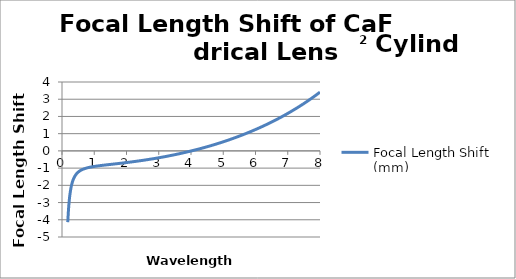
| Category | Focal Length Shift (mm) |
|---|---|
| 0.18 | -4.138 |
| 0.181 | -4.098 |
| 0.182 | -4.059 |
| 0.183 | -4.02 |
| 0.184 | -3.982 |
| 0.185 | -3.945 |
| 0.186 | -3.908 |
| 0.187 | -3.872 |
| 0.188 | -3.837 |
| 0.189 | -3.802 |
| 0.19 | -3.768 |
| 0.191 | -3.735 |
| 0.192 | -3.702 |
| 0.193 | -3.67 |
| 0.194 | -3.638 |
| 0.195 | -3.607 |
| 0.196 | -3.577 |
| 0.197 | -3.547 |
| 0.198 | -3.517 |
| 0.199 | -3.488 |
| 0.2 | -3.46 |
| 0.201 | -3.432 |
| 0.202 | -3.404 |
| 0.203 | -3.377 |
| 0.204 | -3.35 |
| 0.205 | -3.324 |
| 0.206 | -3.298 |
| 0.207 | -3.273 |
| 0.208 | -3.248 |
| 0.209 | -3.223 |
| 0.21 | -3.199 |
| 0.211 | -3.175 |
| 0.212 | -3.152 |
| 0.213 | -3.129 |
| 0.214 | -3.106 |
| 0.215 | -3.084 |
| 0.216 | -3.062 |
| 0.217 | -3.04 |
| 0.218 | -3.019 |
| 0.219 | -2.998 |
| 0.22 | -2.977 |
| 0.221 | -2.956 |
| 0.222 | -2.936 |
| 0.223 | -2.916 |
| 0.224 | -2.897 |
| 0.225 | -2.878 |
| 0.226 | -2.859 |
| 0.227 | -2.84 |
| 0.228 | -2.821 |
| 0.229 | -2.803 |
| 0.23 | -2.785 |
| 0.231 | -2.768 |
| 0.232 | -2.75 |
| 0.233 | -2.733 |
| 0.234 | -2.716 |
| 0.235 | -2.699 |
| 0.236 | -2.683 |
| 0.237 | -2.666 |
| 0.238 | -2.65 |
| 0.239 | -2.635 |
| 0.24 | -2.619 |
| 0.241 | -2.604 |
| 0.242 | -2.588 |
| 0.243 | -2.573 |
| 0.244 | -2.559 |
| 0.245 | -2.544 |
| 0.246 | -2.53 |
| 0.247 | -2.515 |
| 0.248 | -2.501 |
| 0.249 | -2.487 |
| 0.25 | -2.474 |
| 0.251 | -2.46 |
| 0.252 | -2.447 |
| 0.253 | -2.434 |
| 0.254 | -2.421 |
| 0.255 | -2.408 |
| 0.256 | -2.395 |
| 0.257 | -2.382 |
| 0.258 | -2.37 |
| 0.259 | -2.358 |
| 0.26 | -2.346 |
| 0.261 | -2.334 |
| 0.262 | -2.322 |
| 0.263 | -2.31 |
| 0.264 | -2.299 |
| 0.265 | -2.288 |
| 0.266 | -2.276 |
| 0.267 | -2.265 |
| 0.268 | -2.254 |
| 0.269 | -2.243 |
| 0.27 | -2.233 |
| 0.271 | -2.222 |
| 0.272 | -2.212 |
| 0.273 | -2.201 |
| 0.274 | -2.191 |
| 0.275 | -2.181 |
| 0.276 | -2.171 |
| 0.277 | -2.161 |
| 0.278 | -2.151 |
| 0.279 | -2.142 |
| 0.28 | -2.132 |
| 0.281 | -2.123 |
| 0.282 | -2.113 |
| 0.283 | -2.104 |
| 0.284 | -2.095 |
| 0.285 | -2.086 |
| 0.286 | -2.077 |
| 0.287 | -2.068 |
| 0.288 | -2.059 |
| 0.289 | -2.051 |
| 0.29 | -2.042 |
| 0.291 | -2.034 |
| 0.292 | -2.025 |
| 0.293 | -2.017 |
| 0.294 | -2.009 |
| 0.295 | -2.001 |
| 0.296 | -1.993 |
| 0.297 | -1.985 |
| 0.298 | -1.977 |
| 0.299 | -1.969 |
| 0.3 | -1.961 |
| 0.301 | -1.954 |
| 0.302 | -1.946 |
| 0.303 | -1.939 |
| 0.304 | -1.931 |
| 0.305 | -1.924 |
| 0.306 | -1.917 |
| 0.307 | -1.91 |
| 0.308 | -1.903 |
| 0.309 | -1.896 |
| 0.31 | -1.889 |
| 0.311 | -1.882 |
| 0.312 | -1.875 |
| 0.313 | -1.868 |
| 0.314 | -1.862 |
| 0.315 | -1.855 |
| 0.316 | -1.848 |
| 0.317 | -1.842 |
| 0.318 | -1.835 |
| 0.319 | -1.829 |
| 0.32 | -1.823 |
| 0.321 | -1.817 |
| 0.322 | -1.81 |
| 0.323 | -1.804 |
| 0.324 | -1.798 |
| 0.325 | -1.792 |
| 0.326 | -1.786 |
| 0.327 | -1.78 |
| 0.328 | -1.775 |
| 0.329 | -1.769 |
| 0.33 | -1.763 |
| 0.331 | -1.757 |
| 0.332 | -1.752 |
| 0.333 | -1.746 |
| 0.334 | -1.741 |
| 0.335 | -1.735 |
| 0.336 | -1.73 |
| 0.337 | -1.724 |
| 0.338 | -1.719 |
| 0.339 | -1.714 |
| 0.34 | -1.709 |
| 0.341 | -1.703 |
| 0.342 | -1.698 |
| 0.343 | -1.693 |
| 0.344 | -1.688 |
| 0.345 | -1.683 |
| 0.346 | -1.678 |
| 0.347 | -1.673 |
| 0.348 | -1.668 |
| 0.349 | -1.664 |
| 0.35 | -1.659 |
| 0.351 | -1.654 |
| 0.352 | -1.649 |
| 0.353 | -1.645 |
| 0.354 | -1.64 |
| 0.355 | -1.636 |
| 0.356 | -1.631 |
| 0.357 | -1.627 |
| 0.358 | -1.622 |
| 0.359 | -1.618 |
| 0.36 | -1.613 |
| 0.361 | -1.609 |
| 0.362 | -1.605 |
| 0.363 | -1.6 |
| 0.364 | -1.596 |
| 0.365 | -1.592 |
| 0.366 | -1.588 |
| 0.367 | -1.584 |
| 0.368 | -1.58 |
| 0.369 | -1.576 |
| 0.37 | -1.572 |
| 0.371 | -1.568 |
| 0.372 | -1.564 |
| 0.373 | -1.56 |
| 0.374 | -1.556 |
| 0.375 | -1.552 |
| 0.376 | -1.548 |
| 0.377 | -1.544 |
| 0.378 | -1.54 |
| 0.379 | -1.537 |
| 0.38 | -1.533 |
| 0.381 | -1.529 |
| 0.382 | -1.526 |
| 0.383 | -1.522 |
| 0.384 | -1.518 |
| 0.385 | -1.515 |
| 0.386 | -1.511 |
| 0.387 | -1.508 |
| 0.388 | -1.504 |
| 0.389 | -1.501 |
| 0.39 | -1.497 |
| 0.391 | -1.494 |
| 0.392 | -1.491 |
| 0.393 | -1.487 |
| 0.394 | -1.484 |
| 0.395 | -1.481 |
| 0.396 | -1.477 |
| 0.397 | -1.474 |
| 0.398 | -1.471 |
| 0.399 | -1.468 |
| 0.4 | -1.464 |
| 0.401 | -1.461 |
| 0.402 | -1.458 |
| 0.403 | -1.455 |
| 0.404 | -1.452 |
| 0.405 | -1.449 |
| 0.406 | -1.446 |
| 0.407 | -1.443 |
| 0.408 | -1.44 |
| 0.409 | -1.437 |
| 0.41 | -1.434 |
| 0.411 | -1.431 |
| 0.412 | -1.428 |
| 0.413 | -1.425 |
| 0.414 | -1.422 |
| 0.415 | -1.419 |
| 0.416 | -1.417 |
| 0.417 | -1.414 |
| 0.418 | -1.411 |
| 0.419 | -1.408 |
| 0.42 | -1.406 |
| 0.421 | -1.403 |
| 0.422 | -1.4 |
| 0.423 | -1.397 |
| 0.424 | -1.395 |
| 0.425 | -1.392 |
| 0.426 | -1.389 |
| 0.427 | -1.387 |
| 0.428 | -1.384 |
| 0.429 | -1.382 |
| 0.43 | -1.379 |
| 0.431 | -1.377 |
| 0.432 | -1.374 |
| 0.433 | -1.372 |
| 0.434 | -1.369 |
| 0.435 | -1.367 |
| 0.436 | -1.364 |
| 0.437 | -1.362 |
| 0.438 | -1.359 |
| 0.439 | -1.357 |
| 0.44 | -1.354 |
| 0.441 | -1.352 |
| 0.442 | -1.35 |
| 0.443 | -1.347 |
| 0.444 | -1.345 |
| 0.445 | -1.343 |
| 0.446 | -1.34 |
| 0.447 | -1.338 |
| 0.448 | -1.336 |
| 0.449 | -1.334 |
| 0.45 | -1.331 |
| 0.451 | -1.329 |
| 0.452 | -1.327 |
| 0.453 | -1.325 |
| 0.454 | -1.323 |
| 0.455 | -1.321 |
| 0.456 | -1.318 |
| 0.457 | -1.316 |
| 0.458 | -1.314 |
| 0.459 | -1.312 |
| 0.46 | -1.31 |
| 0.461 | -1.308 |
| 0.462 | -1.306 |
| 0.463 | -1.304 |
| 0.464 | -1.302 |
| 0.465 | -1.3 |
| 0.466 | -1.298 |
| 0.467 | -1.296 |
| 0.468 | -1.294 |
| 0.469 | -1.292 |
| 0.47 | -1.29 |
| 0.471 | -1.288 |
| 0.472 | -1.286 |
| 0.473 | -1.284 |
| 0.474 | -1.282 |
| 0.475 | -1.28 |
| 0.476 | -1.278 |
| 0.477 | -1.276 |
| 0.478 | -1.274 |
| 0.479 | -1.273 |
| 0.48 | -1.271 |
| 0.481 | -1.269 |
| 0.482 | -1.267 |
| 0.483 | -1.265 |
| 0.484 | -1.263 |
| 0.485 | -1.262 |
| 0.486 | -1.26 |
| 0.487 | -1.258 |
| 0.488 | -1.256 |
| 0.489 | -1.255 |
| 0.49 | -1.253 |
| 0.491 | -1.251 |
| 0.492 | -1.249 |
| 0.493 | -1.248 |
| 0.494 | -1.246 |
| 0.495 | -1.244 |
| 0.496 | -1.243 |
| 0.497 | -1.241 |
| 0.498 | -1.239 |
| 0.499 | -1.238 |
| 0.5 | -1.236 |
| 0.501 | -1.234 |
| 0.502 | -1.233 |
| 0.503 | -1.231 |
| 0.504 | -1.23 |
| 0.505 | -1.228 |
| 0.506 | -1.226 |
| 0.507 | -1.225 |
| 0.508 | -1.223 |
| 0.509 | -1.222 |
| 0.51 | -1.22 |
| 0.511 | -1.219 |
| 0.512 | -1.217 |
| 0.513 | -1.216 |
| 0.514 | -1.214 |
| 0.515 | -1.213 |
| 0.516 | -1.211 |
| 0.517 | -1.21 |
| 0.518 | -1.208 |
| 0.519 | -1.207 |
| 0.52 | -1.205 |
| 0.521 | -1.204 |
| 0.522 | -1.202 |
| 0.523 | -1.201 |
| 0.524 | -1.199 |
| 0.525 | -1.198 |
| 0.526 | -1.197 |
| 0.527 | -1.195 |
| 0.528 | -1.194 |
| 0.529 | -1.192 |
| 0.53 | -1.191 |
| 0.531 | -1.19 |
| 0.532 | -1.188 |
| 0.533 | -1.187 |
| 0.534 | -1.186 |
| 0.535 | -1.184 |
| 0.536 | -1.183 |
| 0.537 | -1.182 |
| 0.538 | -1.18 |
| 0.539 | -1.179 |
| 0.54 | -1.178 |
| 0.541 | -1.176 |
| 0.542 | -1.175 |
| 0.543 | -1.174 |
| 0.544 | -1.172 |
| 0.545 | -1.171 |
| 0.546 | -1.17 |
| 0.547 | -1.169 |
| 0.548 | -1.167 |
| 0.549 | -1.166 |
| 0.55 | -1.165 |
| 0.551 | -1.164 |
| 0.552 | -1.162 |
| 0.553 | -1.161 |
| 0.554 | -1.16 |
| 0.555 | -1.159 |
| 0.556 | -1.158 |
| 0.557 | -1.156 |
| 0.558 | -1.155 |
| 0.559 | -1.154 |
| 0.56 | -1.153 |
| 0.561 | -1.152 |
| 0.562 | -1.15 |
| 0.563 | -1.149 |
| 0.564 | -1.148 |
| 0.565 | -1.147 |
| 0.566 | -1.146 |
| 0.567 | -1.145 |
| 0.568 | -1.144 |
| 0.569 | -1.142 |
| 0.57 | -1.141 |
| 0.571 | -1.14 |
| 0.572 | -1.139 |
| 0.573 | -1.138 |
| 0.574 | -1.137 |
| 0.575 | -1.136 |
| 0.576 | -1.135 |
| 0.577 | -1.134 |
| 0.578 | -1.133 |
| 0.579 | -1.131 |
| 0.58 | -1.13 |
| 0.581 | -1.129 |
| 0.582 | -1.128 |
| 0.583 | -1.127 |
| 0.584 | -1.126 |
| 0.585 | -1.125 |
| 0.586 | -1.124 |
| 0.587 | -1.123 |
| 0.588 | -1.122 |
| 0.589 | -1.121 |
| 0.59 | -1.12 |
| 0.591 | -1.119 |
| 0.592 | -1.118 |
| 0.593 | -1.117 |
| 0.594 | -1.116 |
| 0.595 | -1.115 |
| 0.596 | -1.114 |
| 0.597 | -1.113 |
| 0.598 | -1.112 |
| 0.599 | -1.111 |
| 0.6 | -1.11 |
| 0.601 | -1.109 |
| 0.602 | -1.108 |
| 0.603 | -1.107 |
| 0.604 | -1.106 |
| 0.605 | -1.105 |
| 0.606 | -1.104 |
| 0.607 | -1.103 |
| 0.608 | -1.102 |
| 0.609 | -1.102 |
| 0.61 | -1.101 |
| 0.611 | -1.1 |
| 0.612 | -1.099 |
| 0.613 | -1.098 |
| 0.614 | -1.097 |
| 0.615 | -1.096 |
| 0.616 | -1.095 |
| 0.617 | -1.094 |
| 0.618 | -1.093 |
| 0.619 | -1.092 |
| 0.62 | -1.092 |
| 0.621 | -1.091 |
| 0.622 | -1.09 |
| 0.623 | -1.089 |
| 0.624 | -1.088 |
| 0.625 | -1.087 |
| 0.626 | -1.086 |
| 0.627 | -1.085 |
| 0.628 | -1.085 |
| 0.629 | -1.084 |
| 0.63 | -1.083 |
| 0.631 | -1.082 |
| 0.632 | -1.081 |
| 0.633 | -1.08 |
| 0.634 | -1.079 |
| 0.635 | -1.079 |
| 0.636 | -1.078 |
| 0.637 | -1.077 |
| 0.638 | -1.076 |
| 0.639 | -1.075 |
| 0.64 | -1.075 |
| 0.641 | -1.074 |
| 0.642 | -1.073 |
| 0.643 | -1.072 |
| 0.644 | -1.071 |
| 0.645 | -1.071 |
| 0.646 | -1.07 |
| 0.647 | -1.069 |
| 0.648 | -1.068 |
| 0.649 | -1.067 |
| 0.65 | -1.067 |
| 0.651 | -1.066 |
| 0.652 | -1.065 |
| 0.653 | -1.064 |
| 0.654 | -1.063 |
| 0.655 | -1.063 |
| 0.656 | -1.062 |
| 0.657 | -1.061 |
| 0.658 | -1.06 |
| 0.659 | -1.06 |
| 0.66 | -1.059 |
| 0.661 | -1.058 |
| 0.662 | -1.057 |
| 0.663 | -1.057 |
| 0.664 | -1.056 |
| 0.665 | -1.055 |
| 0.666 | -1.054 |
| 0.667 | -1.054 |
| 0.668 | -1.053 |
| 0.669 | -1.052 |
| 0.67 | -1.052 |
| 0.671 | -1.051 |
| 0.672 | -1.05 |
| 0.673 | -1.049 |
| 0.674 | -1.049 |
| 0.675 | -1.048 |
| 0.676 | -1.047 |
| 0.677 | -1.047 |
| 0.678 | -1.046 |
| 0.679 | -1.045 |
| 0.68 | -1.045 |
| 0.681 | -1.044 |
| 0.682 | -1.043 |
| 0.683 | -1.042 |
| 0.684 | -1.042 |
| 0.685 | -1.041 |
| 0.686 | -1.04 |
| 0.687 | -1.04 |
| 0.688 | -1.039 |
| 0.689 | -1.038 |
| 0.69 | -1.038 |
| 0.691 | -1.037 |
| 0.692 | -1.036 |
| 0.693 | -1.036 |
| 0.694 | -1.035 |
| 0.695 | -1.034 |
| 0.696 | -1.034 |
| 0.697 | -1.033 |
| 0.698 | -1.033 |
| 0.699 | -1.032 |
| 0.7 | -1.031 |
| 0.701 | -1.031 |
| 0.702 | -1.03 |
| 0.703 | -1.029 |
| 0.704 | -1.029 |
| 0.705 | -1.028 |
| 0.706 | -1.027 |
| 0.707 | -1.027 |
| 0.708 | -1.026 |
| 0.709 | -1.026 |
| 0.71 | -1.025 |
| 0.711 | -1.024 |
| 0.712 | -1.024 |
| 0.713 | -1.023 |
| 0.714 | -1.022 |
| 0.715 | -1.022 |
| 0.716 | -1.021 |
| 0.717 | -1.021 |
| 0.718 | -1.02 |
| 0.719 | -1.019 |
| 0.72 | -1.019 |
| 0.721 | -1.018 |
| 0.722 | -1.018 |
| 0.723 | -1.017 |
| 0.724 | -1.016 |
| 0.725 | -1.016 |
| 0.726 | -1.015 |
| 0.727 | -1.015 |
| 0.728 | -1.014 |
| 0.729 | -1.014 |
| 0.73 | -1.013 |
| 0.731 | -1.012 |
| 0.732 | -1.012 |
| 0.733 | -1.011 |
| 0.734 | -1.011 |
| 0.735 | -1.01 |
| 0.736 | -1.01 |
| 0.737 | -1.009 |
| 0.738 | -1.008 |
| 0.739 | -1.008 |
| 0.74 | -1.007 |
| 0.741 | -1.007 |
| 0.742 | -1.006 |
| 0.743 | -1.006 |
| 0.744 | -1.005 |
| 0.745 | -1.005 |
| 0.746 | -1.004 |
| 0.747 | -1.003 |
| 0.748 | -1.003 |
| 0.749 | -1.002 |
| 0.75 | -1.002 |
| 0.751 | -1.001 |
| 0.752 | -1.001 |
| 0.753 | -1 |
| 0.754 | -1 |
| 0.755 | -0.999 |
| 0.756 | -0.999 |
| 0.757 | -0.998 |
| 0.758 | -0.998 |
| 0.759 | -0.997 |
| 0.76 | -0.997 |
| 0.761 | -0.996 |
| 0.762 | -0.996 |
| 0.763 | -0.995 |
| 0.764 | -0.994 |
| 0.765 | -0.994 |
| 0.766 | -0.993 |
| 0.767 | -0.993 |
| 0.768 | -0.992 |
| 0.769 | -0.992 |
| 0.77 | -0.991 |
| 0.771 | -0.991 |
| 0.772 | -0.99 |
| 0.773 | -0.99 |
| 0.774 | -0.989 |
| 0.775 | -0.989 |
| 0.776 | -0.988 |
| 0.777 | -0.988 |
| 0.778 | -0.987 |
| 0.779 | -0.987 |
| 0.78 | -0.986 |
| 0.781 | -0.986 |
| 0.782 | -0.985 |
| 0.783 | -0.985 |
| 0.784 | -0.984 |
| 0.785 | -0.984 |
| 0.786 | -0.984 |
| 0.787 | -0.983 |
| 0.788 | -0.983 |
| 0.789 | -0.982 |
| 0.79 | -0.982 |
| 0.791 | -0.981 |
| 0.792 | -0.981 |
| 0.793 | -0.98 |
| 0.794 | -0.98 |
| 0.795 | -0.979 |
| 0.796 | -0.979 |
| 0.797 | -0.978 |
| 0.798 | -0.978 |
| 0.799 | -0.977 |
| 0.8 | -0.977 |
| 0.801 | -0.976 |
| 0.802 | -0.976 |
| 0.803 | -0.976 |
| 0.804 | -0.975 |
| 0.805 | -0.975 |
| 0.806 | -0.974 |
| 0.807 | -0.974 |
| 0.808 | -0.973 |
| 0.809 | -0.973 |
| 0.81 | -0.972 |
| 0.811 | -0.972 |
| 0.812 | -0.971 |
| 0.813 | -0.971 |
| 0.814 | -0.971 |
| 0.815 | -0.97 |
| 0.816 | -0.97 |
| 0.817 | -0.969 |
| 0.818 | -0.969 |
| 0.819 | -0.968 |
| 0.82 | -0.968 |
| 0.821 | -0.967 |
| 0.822 | -0.967 |
| 0.823 | -0.967 |
| 0.824 | -0.966 |
| 0.825 | -0.966 |
| 0.826 | -0.965 |
| 0.827 | -0.965 |
| 0.828 | -0.964 |
| 0.829 | -0.964 |
| 0.83 | -0.964 |
| 0.831 | -0.963 |
| 0.832 | -0.963 |
| 0.833 | -0.962 |
| 0.834 | -0.962 |
| 0.835 | -0.962 |
| 0.836 | -0.961 |
| 0.837 | -0.961 |
| 0.838 | -0.96 |
| 0.839 | -0.96 |
| 0.84 | -0.959 |
| 0.841 | -0.959 |
| 0.842 | -0.959 |
| 0.843 | -0.958 |
| 0.844 | -0.958 |
| 0.845 | -0.957 |
| 0.846 | -0.957 |
| 0.847 | -0.957 |
| 0.848 | -0.956 |
| 0.849 | -0.956 |
| 0.85 | -0.955 |
| 0.851 | -0.955 |
| 0.852 | -0.955 |
| 0.853 | -0.954 |
| 0.854 | -0.954 |
| 0.855 | -0.953 |
| 0.856 | -0.953 |
| 0.857 | -0.953 |
| 0.858 | -0.952 |
| 0.859 | -0.952 |
| 0.86 | -0.951 |
| 0.861 | -0.951 |
| 0.862 | -0.951 |
| 0.863 | -0.95 |
| 0.864 | -0.95 |
| 0.865 | -0.949 |
| 0.866 | -0.949 |
| 0.867 | -0.949 |
| 0.868 | -0.948 |
| 0.869 | -0.948 |
| 0.87 | -0.947 |
| 0.871 | -0.947 |
| 0.872 | -0.947 |
| 0.873 | -0.946 |
| 0.874 | -0.946 |
| 0.875 | -0.946 |
| 0.876 | -0.945 |
| 0.877 | -0.945 |
| 0.878 | -0.944 |
| 0.879 | -0.944 |
| 0.88 | -0.944 |
| 0.881 | -0.943 |
| 0.882 | -0.943 |
| 0.883 | -0.943 |
| 0.884 | -0.942 |
| 0.885 | -0.942 |
| 0.886 | -0.941 |
| 0.887 | -0.941 |
| 0.888 | -0.941 |
| 0.889 | -0.94 |
| 0.89 | -0.94 |
| 0.891 | -0.94 |
| 0.892 | -0.939 |
| 0.893 | -0.939 |
| 0.894 | -0.938 |
| 0.895 | -0.938 |
| 0.896 | -0.938 |
| 0.897 | -0.937 |
| 0.898 | -0.937 |
| 0.899 | -0.937 |
| 0.9 | -0.936 |
| 0.901 | -0.936 |
| 0.902 | -0.936 |
| 0.903 | -0.935 |
| 0.904 | -0.935 |
| 0.905 | -0.935 |
| 0.906 | -0.934 |
| 0.907 | -0.934 |
| 0.908 | -0.933 |
| 0.909 | -0.933 |
| 0.91 | -0.933 |
| 0.911 | -0.932 |
| 0.912 | -0.932 |
| 0.913 | -0.932 |
| 0.914 | -0.931 |
| 0.915 | -0.931 |
| 0.916 | -0.931 |
| 0.917 | -0.93 |
| 0.918 | -0.93 |
| 0.919 | -0.93 |
| 0.92 | -0.929 |
| 0.921 | -0.929 |
| 0.922 | -0.929 |
| 0.923 | -0.928 |
| 0.924 | -0.928 |
| 0.925 | -0.928 |
| 0.926 | -0.927 |
| 0.927 | -0.927 |
| 0.928 | -0.927 |
| 0.929 | -0.926 |
| 0.93 | -0.926 |
| 0.931 | -0.926 |
| 0.932 | -0.925 |
| 0.933 | -0.925 |
| 0.934 | -0.925 |
| 0.935 | -0.924 |
| 0.936 | -0.924 |
| 0.937 | -0.924 |
| 0.938 | -0.923 |
| 0.939 | -0.923 |
| 0.94 | -0.923 |
| 0.941 | -0.922 |
| 0.942 | -0.922 |
| 0.943 | -0.922 |
| 0.944 | -0.921 |
| 0.945 | -0.921 |
| 0.946 | -0.921 |
| 0.947 | -0.92 |
| 0.948 | -0.92 |
| 0.949 | -0.92 |
| 0.95 | -0.919 |
| 0.951 | -0.919 |
| 0.952 | -0.919 |
| 0.953 | -0.918 |
| 0.954 | -0.918 |
| 0.955 | -0.918 |
| 0.956 | -0.917 |
| 0.957 | -0.917 |
| 0.958 | -0.917 |
| 0.959 | -0.916 |
| 0.96 | -0.916 |
| 0.961 | -0.916 |
| 0.962 | -0.915 |
| 0.963 | -0.915 |
| 0.964 | -0.915 |
| 0.965 | -0.915 |
| 0.966 | -0.914 |
| 0.967 | -0.914 |
| 0.968 | -0.914 |
| 0.969 | -0.913 |
| 0.97 | -0.913 |
| 0.971 | -0.913 |
| 0.972 | -0.912 |
| 0.973 | -0.912 |
| 0.974 | -0.912 |
| 0.975 | -0.911 |
| 0.976 | -0.911 |
| 0.977 | -0.911 |
| 0.978 | -0.91 |
| 0.979 | -0.91 |
| 0.98 | -0.91 |
| 0.981 | -0.91 |
| 0.982 | -0.909 |
| 0.983 | -0.909 |
| 0.984 | -0.909 |
| 0.985 | -0.908 |
| 0.986 | -0.908 |
| 0.987 | -0.908 |
| 0.988 | -0.907 |
| 0.989 | -0.907 |
| 0.99 | -0.907 |
| 0.991 | -0.907 |
| 0.992 | -0.906 |
| 0.993 | -0.906 |
| 0.994 | -0.906 |
| 0.995 | -0.905 |
| 0.996 | -0.905 |
| 0.997 | -0.905 |
| 0.998 | -0.904 |
| 0.999 | -0.904 |
| 1.0 | -0.904 |
| 1.001 | -0.904 |
| 1.002 | -0.903 |
| 1.003 | -0.903 |
| 1.004 | -0.903 |
| 1.005 | -0.902 |
| 1.006 | -0.902 |
| 1.007 | -0.902 |
| 1.008 | -0.902 |
| 1.009 | -0.901 |
| 1.01 | -0.901 |
| 1.011 | -0.901 |
| 1.012 | -0.9 |
| 1.013 | -0.9 |
| 1.014 | -0.9 |
| 1.015 | -0.899 |
| 1.016 | -0.899 |
| 1.017 | -0.899 |
| 1.018 | -0.899 |
| 1.019 | -0.898 |
| 1.02 | -0.898 |
| 1.021 | -0.898 |
| 1.022 | -0.897 |
| 1.023 | -0.897 |
| 1.024 | -0.897 |
| 1.025 | -0.897 |
| 1.026 | -0.896 |
| 1.027 | -0.896 |
| 1.028 | -0.896 |
| 1.029 | -0.895 |
| 1.03 | -0.895 |
| 1.031 | -0.895 |
| 1.032 | -0.895 |
| 1.033 | -0.894 |
| 1.034 | -0.894 |
| 1.035 | -0.894 |
| 1.036 | -0.894 |
| 1.037 | -0.893 |
| 1.038 | -0.893 |
| 1.039 | -0.893 |
| 1.04 | -0.892 |
| 1.041 | -0.892 |
| 1.042 | -0.892 |
| 1.043 | -0.892 |
| 1.044 | -0.891 |
| 1.045 | -0.891 |
| 1.046 | -0.891 |
| 1.047 | -0.89 |
| 1.048 | -0.89 |
| 1.049 | -0.89 |
| 1.05 | -0.89 |
| 1.051 | -0.889 |
| 1.052 | -0.889 |
| 1.053 | -0.889 |
| 1.054 | -0.889 |
| 1.055 | -0.888 |
| 1.056 | -0.888 |
| 1.057 | -0.888 |
| 1.058 | -0.887 |
| 1.059 | -0.887 |
| 1.06 | -0.887 |
| 1.061 | -0.887 |
| 1.062 | -0.886 |
| 1.063 | -0.886 |
| 1.064 | -0.886 |
| 1.065 | -0.886 |
| 1.066 | -0.885 |
| 1.067 | -0.885 |
| 1.068 | -0.885 |
| 1.069 | -0.884 |
| 1.07 | -0.884 |
| 1.071 | -0.884 |
| 1.072 | -0.884 |
| 1.073 | -0.883 |
| 1.074 | -0.883 |
| 1.075 | -0.883 |
| 1.076 | -0.883 |
| 1.077 | -0.882 |
| 1.078 | -0.882 |
| 1.079 | -0.882 |
| 1.08 | -0.882 |
| 1.081 | -0.881 |
| 1.082 | -0.881 |
| 1.083 | -0.881 |
| 1.084 | -0.88 |
| 1.085 | -0.88 |
| 1.086 | -0.88 |
| 1.087 | -0.88 |
| 1.088 | -0.879 |
| 1.089 | -0.879 |
| 1.09 | -0.879 |
| 1.091 | -0.879 |
| 1.092 | -0.878 |
| 1.093 | -0.878 |
| 1.094 | -0.878 |
| 1.095 | -0.878 |
| 1.096 | -0.877 |
| 1.097 | -0.877 |
| 1.098 | -0.877 |
| 1.099 | -0.877 |
| 1.1 | -0.876 |
| 1.101 | -0.876 |
| 1.102 | -0.876 |
| 1.103 | -0.876 |
| 1.104 | -0.875 |
| 1.105 | -0.875 |
| 1.106 | -0.875 |
| 1.107 | -0.875 |
| 1.108 | -0.874 |
| 1.109 | -0.874 |
| 1.11 | -0.874 |
| 1.111 | -0.874 |
| 1.112 | -0.873 |
| 1.113 | -0.873 |
| 1.114 | -0.873 |
| 1.115 | -0.873 |
| 1.116 | -0.872 |
| 1.117 | -0.872 |
| 1.118 | -0.872 |
| 1.119 | -0.872 |
| 1.12 | -0.871 |
| 1.121 | -0.871 |
| 1.122 | -0.871 |
| 1.123 | -0.87 |
| 1.124 | -0.87 |
| 1.125 | -0.87 |
| 1.126 | -0.87 |
| 1.127 | -0.869 |
| 1.128 | -0.869 |
| 1.129 | -0.869 |
| 1.13 | -0.869 |
| 1.131 | -0.868 |
| 1.132 | -0.868 |
| 1.133 | -0.868 |
| 1.134 | -0.868 |
| 1.135 | -0.867 |
| 1.136 | -0.867 |
| 1.137 | -0.867 |
| 1.138 | -0.867 |
| 1.139 | -0.866 |
| 1.14 | -0.866 |
| 1.141 | -0.866 |
| 1.142 | -0.866 |
| 1.143 | -0.866 |
| 1.144 | -0.865 |
| 1.145 | -0.865 |
| 1.146 | -0.865 |
| 1.147 | -0.865 |
| 1.148 | -0.864 |
| 1.149 | -0.864 |
| 1.15 | -0.864 |
| 1.151 | -0.864 |
| 1.152 | -0.863 |
| 1.153 | -0.863 |
| 1.154 | -0.863 |
| 1.155 | -0.863 |
| 1.156 | -0.862 |
| 1.157 | -0.862 |
| 1.158 | -0.862 |
| 1.159 | -0.862 |
| 1.16 | -0.861 |
| 1.161 | -0.861 |
| 1.162 | -0.861 |
| 1.163 | -0.861 |
| 1.164 | -0.86 |
| 1.165 | -0.86 |
| 1.166 | -0.86 |
| 1.167 | -0.86 |
| 1.168 | -0.859 |
| 1.169 | -0.859 |
| 1.17 | -0.859 |
| 1.171 | -0.859 |
| 1.172 | -0.858 |
| 1.173 | -0.858 |
| 1.174 | -0.858 |
| 1.175 | -0.858 |
| 1.176 | -0.858 |
| 1.177 | -0.857 |
| 1.178 | -0.857 |
| 1.179 | -0.857 |
| 1.18 | -0.857 |
| 1.181 | -0.856 |
| 1.182 | -0.856 |
| 1.183 | -0.856 |
| 1.184 | -0.856 |
| 1.185 | -0.855 |
| 1.186 | -0.855 |
| 1.187 | -0.855 |
| 1.188 | -0.855 |
| 1.189 | -0.854 |
| 1.19 | -0.854 |
| 1.191 | -0.854 |
| 1.192 | -0.854 |
| 1.193 | -0.853 |
| 1.194 | -0.853 |
| 1.195 | -0.853 |
| 1.196 | -0.853 |
| 1.197 | -0.853 |
| 1.198 | -0.852 |
| 1.199 | -0.852 |
| 1.2 | -0.852 |
| 1.201 | -0.852 |
| 1.202 | -0.851 |
| 1.203 | -0.851 |
| 1.204 | -0.851 |
| 1.205 | -0.851 |
| 1.206 | -0.85 |
| 1.207 | -0.85 |
| 1.208 | -0.85 |
| 1.209 | -0.85 |
| 1.21 | -0.85 |
| 1.211 | -0.849 |
| 1.212 | -0.849 |
| 1.213 | -0.849 |
| 1.214 | -0.849 |
| 1.215 | -0.848 |
| 1.216 | -0.848 |
| 1.217 | -0.848 |
| 1.218 | -0.848 |
| 1.219 | -0.847 |
| 1.22 | -0.847 |
| 1.221 | -0.847 |
| 1.222 | -0.847 |
| 1.223 | -0.846 |
| 1.224 | -0.846 |
| 1.225 | -0.846 |
| 1.226 | -0.846 |
| 1.227 | -0.846 |
| 1.228 | -0.845 |
| 1.229 | -0.845 |
| 1.23 | -0.845 |
| 1.231 | -0.845 |
| 1.232 | -0.844 |
| 1.233 | -0.844 |
| 1.234 | -0.844 |
| 1.235 | -0.844 |
| 1.236 | -0.844 |
| 1.237 | -0.843 |
| 1.238 | -0.843 |
| 1.239 | -0.843 |
| 1.24 | -0.843 |
| 1.241 | -0.842 |
| 1.242 | -0.842 |
| 1.243 | -0.842 |
| 1.244 | -0.842 |
| 1.245 | -0.841 |
| 1.246 | -0.841 |
| 1.247 | -0.841 |
| 1.248 | -0.841 |
| 1.249 | -0.841 |
| 1.25 | -0.84 |
| 1.251 | -0.84 |
| 1.252 | -0.84 |
| 1.253 | -0.84 |
| 1.254 | -0.839 |
| 1.255 | -0.839 |
| 1.256 | -0.839 |
| 1.257 | -0.839 |
| 1.258 | -0.839 |
| 1.259 | -0.838 |
| 1.26 | -0.838 |
| 1.261 | -0.838 |
| 1.262 | -0.838 |
| 1.263 | -0.837 |
| 1.264 | -0.837 |
| 1.265 | -0.837 |
| 1.266 | -0.837 |
| 1.267 | -0.836 |
| 1.268 | -0.836 |
| 1.269 | -0.836 |
| 1.27 | -0.836 |
| 1.271 | -0.836 |
| 1.272 | -0.835 |
| 1.273 | -0.835 |
| 1.274 | -0.835 |
| 1.275 | -0.835 |
| 1.276 | -0.834 |
| 1.277 | -0.834 |
| 1.278 | -0.834 |
| 1.279 | -0.834 |
| 1.28 | -0.834 |
| 1.281 | -0.833 |
| 1.282 | -0.833 |
| 1.283 | -0.833 |
| 1.284 | -0.833 |
| 1.285 | -0.832 |
| 1.286 | -0.832 |
| 1.287 | -0.832 |
| 1.288 | -0.832 |
| 1.289 | -0.832 |
| 1.29 | -0.831 |
| 1.291 | -0.831 |
| 1.292 | -0.831 |
| 1.293 | -0.831 |
| 1.294 | -0.83 |
| 1.295 | -0.83 |
| 1.296 | -0.83 |
| 1.297 | -0.83 |
| 1.298 | -0.83 |
| 1.299 | -0.829 |
| 1.3 | -0.829 |
| 1.301 | -0.829 |
| 1.302 | -0.829 |
| 1.303 | -0.828 |
| 1.304 | -0.828 |
| 1.305 | -0.828 |
| 1.306 | -0.828 |
| 1.307 | -0.828 |
| 1.308 | -0.827 |
| 1.309 | -0.827 |
| 1.31 | -0.827 |
| 1.311 | -0.827 |
| 1.312 | -0.826 |
| 1.313 | -0.826 |
| 1.314 | -0.826 |
| 1.315 | -0.826 |
| 1.316 | -0.826 |
| 1.317 | -0.825 |
| 1.318 | -0.825 |
| 1.319 | -0.825 |
| 1.32 | -0.825 |
| 1.321 | -0.825 |
| 1.322 | -0.824 |
| 1.323 | -0.824 |
| 1.324 | -0.824 |
| 1.325 | -0.824 |
| 1.326 | -0.823 |
| 1.327 | -0.823 |
| 1.328 | -0.823 |
| 1.329 | -0.823 |
| 1.33 | -0.823 |
| 1.331 | -0.822 |
| 1.332 | -0.822 |
| 1.333 | -0.822 |
| 1.334 | -0.822 |
| 1.335 | -0.821 |
| 1.336 | -0.821 |
| 1.337 | -0.821 |
| 1.338 | -0.821 |
| 1.339 | -0.821 |
| 1.34 | -0.82 |
| 1.341 | -0.82 |
| 1.342 | -0.82 |
| 1.343 | -0.82 |
| 1.344 | -0.82 |
| 1.345 | -0.819 |
| 1.346 | -0.819 |
| 1.347 | -0.819 |
| 1.348 | -0.819 |
| 1.349 | -0.818 |
| 1.35 | -0.818 |
| 1.351 | -0.818 |
| 1.352 | -0.818 |
| 1.353 | -0.818 |
| 1.354 | -0.817 |
| 1.355 | -0.817 |
| 1.356 | -0.817 |
| 1.357 | -0.817 |
| 1.358 | -0.816 |
| 1.359 | -0.816 |
| 1.36 | -0.816 |
| 1.361 | -0.816 |
| 1.362 | -0.816 |
| 1.363 | -0.815 |
| 1.364 | -0.815 |
| 1.365 | -0.815 |
| 1.366 | -0.815 |
| 1.367 | -0.815 |
| 1.368 | -0.814 |
| 1.369 | -0.814 |
| 1.37 | -0.814 |
| 1.371 | -0.814 |
| 1.372 | -0.813 |
| 1.373 | -0.813 |
| 1.374 | -0.813 |
| 1.375 | -0.813 |
| 1.376 | -0.813 |
| 1.377 | -0.812 |
| 1.378 | -0.812 |
| 1.379 | -0.812 |
| 1.38 | -0.812 |
| 1.381 | -0.812 |
| 1.382 | -0.811 |
| 1.383 | -0.811 |
| 1.384 | -0.811 |
| 1.385 | -0.811 |
| 1.386 | -0.81 |
| 1.387 | -0.81 |
| 1.388 | -0.81 |
| 1.389 | -0.81 |
| 1.39 | -0.81 |
| 1.391 | -0.809 |
| 1.392 | -0.809 |
| 1.393 | -0.809 |
| 1.394 | -0.809 |
| 1.395 | -0.809 |
| 1.396 | -0.808 |
| 1.397 | -0.808 |
| 1.398 | -0.808 |
| 1.399 | -0.808 |
| 1.4 | -0.807 |
| 1.401 | -0.807 |
| 1.402 | -0.807 |
| 1.403 | -0.807 |
| 1.404 | -0.807 |
| 1.405 | -0.806 |
| 1.406 | -0.806 |
| 1.407 | -0.806 |
| 1.408 | -0.806 |
| 1.409 | -0.806 |
| 1.41 | -0.805 |
| 1.411 | -0.805 |
| 1.412 | -0.805 |
| 1.413 | -0.805 |
| 1.414 | -0.804 |
| 1.415 | -0.804 |
| 1.416 | -0.804 |
| 1.417 | -0.804 |
| 1.418 | -0.804 |
| 1.419 | -0.803 |
| 1.42 | -0.803 |
| 1.421 | -0.803 |
| 1.422 | -0.803 |
| 1.423 | -0.803 |
| 1.424 | -0.802 |
| 1.425 | -0.802 |
| 1.426 | -0.802 |
| 1.427 | -0.802 |
| 1.428 | -0.802 |
| 1.429 | -0.801 |
| 1.43 | -0.801 |
| 1.431 | -0.801 |
| 1.432 | -0.801 |
| 1.433 | -0.8 |
| 1.434 | -0.8 |
| 1.435 | -0.8 |
| 1.436 | -0.8 |
| 1.437 | -0.8 |
| 1.438 | -0.799 |
| 1.439 | -0.799 |
| 1.44 | -0.799 |
| 1.441 | -0.799 |
| 1.442 | -0.799 |
| 1.443 | -0.798 |
| 1.444 | -0.798 |
| 1.445 | -0.798 |
| 1.446 | -0.798 |
| 1.447 | -0.797 |
| 1.448 | -0.797 |
| 1.449 | -0.797 |
| 1.45 | -0.797 |
| 1.451 | -0.797 |
| 1.452 | -0.796 |
| 1.453 | -0.796 |
| 1.454 | -0.796 |
| 1.455 | -0.796 |
| 1.456 | -0.796 |
| 1.457 | -0.795 |
| 1.458 | -0.795 |
| 1.459 | -0.795 |
| 1.46 | -0.795 |
| 1.461 | -0.795 |
| 1.462 | -0.794 |
| 1.463 | -0.794 |
| 1.464 | -0.794 |
| 1.465 | -0.794 |
| 1.466 | -0.793 |
| 1.467 | -0.793 |
| 1.468 | -0.793 |
| 1.469 | -0.793 |
| 1.47 | -0.793 |
| 1.471 | -0.792 |
| 1.472 | -0.792 |
| 1.473 | -0.792 |
| 1.474 | -0.792 |
| 1.475 | -0.792 |
| 1.476 | -0.791 |
| 1.477 | -0.791 |
| 1.478 | -0.791 |
| 1.479 | -0.791 |
| 1.48 | -0.79 |
| 1.481 | -0.79 |
| 1.482 | -0.79 |
| 1.483 | -0.79 |
| 1.484 | -0.79 |
| 1.485 | -0.789 |
| 1.486 | -0.789 |
| 1.487 | -0.789 |
| 1.488 | -0.789 |
| 1.489 | -0.789 |
| 1.49 | -0.788 |
| 1.491 | -0.788 |
| 1.492 | -0.788 |
| 1.493 | -0.788 |
| 1.494 | -0.788 |
| 1.495 | -0.787 |
| 1.496 | -0.787 |
| 1.497 | -0.787 |
| 1.498 | -0.787 |
| 1.499 | -0.786 |
| 1.5 | -0.786 |
| 1.501 | -0.786 |
| 1.502 | -0.786 |
| 1.503 | -0.786 |
| 1.504 | -0.785 |
| 1.505 | -0.785 |
| 1.506 | -0.785 |
| 1.507 | -0.785 |
| 1.508 | -0.785 |
| 1.509 | -0.784 |
| 1.51 | -0.784 |
| 1.511 | -0.784 |
| 1.512 | -0.784 |
| 1.513 | -0.784 |
| 1.514 | -0.783 |
| 1.515 | -0.783 |
| 1.516 | -0.783 |
| 1.517 | -0.783 |
| 1.518 | -0.782 |
| 1.519 | -0.782 |
| 1.52 | -0.782 |
| 1.521 | -0.782 |
| 1.522 | -0.782 |
| 1.523 | -0.781 |
| 1.524 | -0.781 |
| 1.525 | -0.781 |
| 1.526 | -0.781 |
| 1.527 | -0.781 |
| 1.528 | -0.78 |
| 1.529 | -0.78 |
| 1.53 | -0.78 |
| 1.531 | -0.78 |
| 1.532 | -0.78 |
| 1.533 | -0.779 |
| 1.534 | -0.779 |
| 1.535 | -0.779 |
| 1.536 | -0.779 |
| 1.537 | -0.778 |
| 1.538 | -0.778 |
| 1.539 | -0.778 |
| 1.54 | -0.778 |
| 1.541 | -0.778 |
| 1.542 | -0.777 |
| 1.543 | -0.777 |
| 1.544 | -0.777 |
| 1.545 | -0.777 |
| 1.546 | -0.777 |
| 1.547 | -0.776 |
| 1.548 | -0.776 |
| 1.549 | -0.776 |
| 1.55 | -0.776 |
| 1.551 | -0.776 |
| 1.552 | -0.775 |
| 1.553 | -0.775 |
| 1.554 | -0.775 |
| 1.555 | -0.775 |
| 1.556 | -0.774 |
| 1.557 | -0.774 |
| 1.558 | -0.774 |
| 1.559 | -0.774 |
| 1.56 | -0.774 |
| 1.561 | -0.773 |
| 1.562 | -0.773 |
| 1.563 | -0.773 |
| 1.564 | -0.773 |
| 1.565 | -0.773 |
| 1.566 | -0.772 |
| 1.567 | -0.772 |
| 1.568 | -0.772 |
| 1.569 | -0.772 |
| 1.57 | -0.772 |
| 1.571 | -0.771 |
| 1.572 | -0.771 |
| 1.573 | -0.771 |
| 1.574 | -0.771 |
| 1.575 | -0.77 |
| 1.576 | -0.77 |
| 1.577 | -0.77 |
| 1.578 | -0.77 |
| 1.579 | -0.77 |
| 1.58 | -0.769 |
| 1.581 | -0.769 |
| 1.582 | -0.769 |
| 1.583 | -0.769 |
| 1.584 | -0.769 |
| 1.585 | -0.768 |
| 1.586 | -0.768 |
| 1.587 | -0.768 |
| 1.588 | -0.768 |
| 1.589 | -0.768 |
| 1.59 | -0.767 |
| 1.591 | -0.767 |
| 1.592 | -0.767 |
| 1.593 | -0.767 |
| 1.594 | -0.766 |
| 1.595 | -0.766 |
| 1.596 | -0.766 |
| 1.597 | -0.766 |
| 1.598 | -0.766 |
| 1.599 | -0.765 |
| 1.6 | -0.765 |
| 1.601 | -0.765 |
| 1.602 | -0.765 |
| 1.603 | -0.765 |
| 1.604 | -0.764 |
| 1.605 | -0.764 |
| 1.606 | -0.764 |
| 1.607 | -0.764 |
| 1.608 | -0.764 |
| 1.609 | -0.763 |
| 1.61 | -0.763 |
| 1.611 | -0.763 |
| 1.612 | -0.763 |
| 1.613 | -0.762 |
| 1.614 | -0.762 |
| 1.615 | -0.762 |
| 1.616 | -0.762 |
| 1.617 | -0.762 |
| 1.618 | -0.761 |
| 1.619 | -0.761 |
| 1.62 | -0.761 |
| 1.621 | -0.761 |
| 1.622 | -0.761 |
| 1.623 | -0.76 |
| 1.624 | -0.76 |
| 1.625 | -0.76 |
| 1.626 | -0.76 |
| 1.627 | -0.759 |
| 1.628 | -0.759 |
| 1.629 | -0.759 |
| 1.63 | -0.759 |
| 1.631 | -0.759 |
| 1.632 | -0.758 |
| 1.633 | -0.758 |
| 1.634 | -0.758 |
| 1.635 | -0.758 |
| 1.636 | -0.758 |
| 1.637 | -0.757 |
| 1.638 | -0.757 |
| 1.639 | -0.757 |
| 1.64 | -0.757 |
| 1.641 | -0.757 |
| 1.642 | -0.756 |
| 1.643 | -0.756 |
| 1.644 | -0.756 |
| 1.645 | -0.756 |
| 1.646 | -0.755 |
| 1.647 | -0.755 |
| 1.648 | -0.755 |
| 1.649 | -0.755 |
| 1.65 | -0.755 |
| 1.651 | -0.754 |
| 1.652 | -0.754 |
| 1.653 | -0.754 |
| 1.654 | -0.754 |
| 1.655 | -0.754 |
| 1.656 | -0.753 |
| 1.657 | -0.753 |
| 1.658 | -0.753 |
| 1.659 | -0.753 |
| 1.66 | -0.752 |
| 1.661 | -0.752 |
| 1.662 | -0.752 |
| 1.663 | -0.752 |
| 1.664 | -0.752 |
| 1.665 | -0.751 |
| 1.666 | -0.751 |
| 1.667 | -0.751 |
| 1.668 | -0.751 |
| 1.669 | -0.751 |
| 1.67 | -0.75 |
| 1.671 | -0.75 |
| 1.672 | -0.75 |
| 1.673 | -0.75 |
| 1.674 | -0.75 |
| 1.675 | -0.749 |
| 1.676 | -0.749 |
| 1.677 | -0.749 |
| 1.678 | -0.749 |
| 1.679 | -0.748 |
| 1.68 | -0.748 |
| 1.681 | -0.748 |
| 1.682 | -0.748 |
| 1.683 | -0.748 |
| 1.684 | -0.747 |
| 1.685 | -0.747 |
| 1.686 | -0.747 |
| 1.687 | -0.747 |
| 1.688 | -0.747 |
| 1.689 | -0.746 |
| 1.69 | -0.746 |
| 1.691 | -0.746 |
| 1.692 | -0.746 |
| 1.693 | -0.745 |
| 1.694 | -0.745 |
| 1.695 | -0.745 |
| 1.696 | -0.745 |
| 1.697 | -0.745 |
| 1.698 | -0.744 |
| 1.699 | -0.744 |
| 1.7 | -0.744 |
| 1.701 | -0.744 |
| 1.702 | -0.744 |
| 1.703 | -0.743 |
| 1.704 | -0.743 |
| 1.705 | -0.743 |
| 1.706 | -0.743 |
| 1.707 | -0.742 |
| 1.708 | -0.742 |
| 1.709 | -0.742 |
| 1.71 | -0.742 |
| 1.711 | -0.742 |
| 1.712 | -0.741 |
| 1.713 | -0.741 |
| 1.714 | -0.741 |
| 1.715 | -0.741 |
| 1.716 | -0.741 |
| 1.717 | -0.74 |
| 1.718 | -0.74 |
| 1.719 | -0.74 |
| 1.72 | -0.74 |
| 1.721 | -0.739 |
| 1.722 | -0.739 |
| 1.723 | -0.739 |
| 1.724 | -0.739 |
| 1.725 | -0.739 |
| 1.726 | -0.738 |
| 1.727 | -0.738 |
| 1.728 | -0.738 |
| 1.729 | -0.738 |
| 1.73 | -0.738 |
| 1.731 | -0.737 |
| 1.732 | -0.737 |
| 1.733 | -0.737 |
| 1.734 | -0.737 |
| 1.735 | -0.736 |
| 1.736 | -0.736 |
| 1.737 | -0.736 |
| 1.738 | -0.736 |
| 1.739 | -0.736 |
| 1.74 | -0.735 |
| 1.741 | -0.735 |
| 1.742 | -0.735 |
| 1.743 | -0.735 |
| 1.744 | -0.734 |
| 1.745 | -0.734 |
| 1.746 | -0.734 |
| 1.747 | -0.734 |
| 1.748 | -0.734 |
| 1.749 | -0.733 |
| 1.75 | -0.733 |
| 1.751 | -0.733 |
| 1.752 | -0.733 |
| 1.753 | -0.733 |
| 1.754 | -0.732 |
| 1.755 | -0.732 |
| 1.756 | -0.732 |
| 1.757 | -0.732 |
| 1.758 | -0.731 |
| 1.759 | -0.731 |
| 1.76 | -0.731 |
| 1.761 | -0.731 |
| 1.762 | -0.731 |
| 1.763 | -0.73 |
| 1.764 | -0.73 |
| 1.765 | -0.73 |
| 1.766 | -0.73 |
| 1.767 | -0.73 |
| 1.768 | -0.729 |
| 1.769 | -0.729 |
| 1.77 | -0.729 |
| 1.771 | -0.729 |
| 1.772 | -0.728 |
| 1.773 | -0.728 |
| 1.774 | -0.728 |
| 1.775 | -0.728 |
| 1.776 | -0.728 |
| 1.777 | -0.727 |
| 1.778 | -0.727 |
| 1.779 | -0.727 |
| 1.78 | -0.727 |
| 1.781 | -0.726 |
| 1.782 | -0.726 |
| 1.783 | -0.726 |
| 1.784 | -0.726 |
| 1.785 | -0.726 |
| 1.786 | -0.725 |
| 1.787 | -0.725 |
| 1.788 | -0.725 |
| 1.789 | -0.725 |
| 1.79 | -0.724 |
| 1.791 | -0.724 |
| 1.792 | -0.724 |
| 1.793 | -0.724 |
| 1.794 | -0.724 |
| 1.795 | -0.723 |
| 1.796 | -0.723 |
| 1.797 | -0.723 |
| 1.798 | -0.723 |
| 1.799 | -0.723 |
| 1.8 | -0.722 |
| 1.801 | -0.722 |
| 1.802 | -0.722 |
| 1.803 | -0.722 |
| 1.804 | -0.721 |
| 1.805 | -0.721 |
| 1.806 | -0.721 |
| 1.807 | -0.721 |
| 1.808 | -0.721 |
| 1.809 | -0.72 |
| 1.81 | -0.72 |
| 1.811 | -0.72 |
| 1.812 | -0.72 |
| 1.813 | -0.719 |
| 1.814 | -0.719 |
| 1.815 | -0.719 |
| 1.816 | -0.719 |
| 1.817 | -0.719 |
| 1.818 | -0.718 |
| 1.819 | -0.718 |
| 1.82 | -0.718 |
| 1.821 | -0.718 |
| 1.822 | -0.717 |
| 1.823 | -0.717 |
| 1.824 | -0.717 |
| 1.825 | -0.717 |
| 1.826 | -0.717 |
| 1.827 | -0.716 |
| 1.828 | -0.716 |
| 1.829 | -0.716 |
| 1.83 | -0.716 |
| 1.831 | -0.716 |
| 1.832 | -0.715 |
| 1.833 | -0.715 |
| 1.834 | -0.715 |
| 1.835 | -0.715 |
| 1.836 | -0.714 |
| 1.837 | -0.714 |
| 1.838 | -0.714 |
| 1.839 | -0.714 |
| 1.84 | -0.714 |
| 1.841 | -0.713 |
| 1.842 | -0.713 |
| 1.843 | -0.713 |
| 1.844 | -0.713 |
| 1.845 | -0.712 |
| 1.846 | -0.712 |
| 1.847 | -0.712 |
| 1.848 | -0.712 |
| 1.849 | -0.712 |
| 1.85 | -0.711 |
| 1.851 | -0.711 |
| 1.852 | -0.711 |
| 1.853 | -0.711 |
| 1.854 | -0.71 |
| 1.855 | -0.71 |
| 1.856 | -0.71 |
| 1.857 | -0.71 |
| 1.858 | -0.71 |
| 1.859 | -0.709 |
| 1.86 | -0.709 |
| 1.861 | -0.709 |
| 1.862 | -0.709 |
| 1.863 | -0.708 |
| 1.864 | -0.708 |
| 1.865 | -0.708 |
| 1.866 | -0.708 |
| 1.867 | -0.708 |
| 1.868 | -0.707 |
| 1.869 | -0.707 |
| 1.87 | -0.707 |
| 1.871 | -0.707 |
| 1.872 | -0.706 |
| 1.873 | -0.706 |
| 1.874 | -0.706 |
| 1.875 | -0.706 |
| 1.876 | -0.706 |
| 1.877 | -0.705 |
| 1.878 | -0.705 |
| 1.879 | -0.705 |
| 1.88 | -0.705 |
| 1.881 | -0.704 |
| 1.882 | -0.704 |
| 1.883 | -0.704 |
| 1.884 | -0.704 |
| 1.885 | -0.704 |
| 1.886 | -0.703 |
| 1.887 | -0.703 |
| 1.888 | -0.703 |
| 1.889 | -0.703 |
| 1.89 | -0.702 |
| 1.891 | -0.702 |
| 1.892 | -0.702 |
| 1.893 | -0.702 |
| 1.894 | -0.702 |
| 1.895 | -0.701 |
| 1.896 | -0.701 |
| 1.897 | -0.701 |
| 1.898 | -0.701 |
| 1.899 | -0.7 |
| 1.9 | -0.7 |
| 1.901 | -0.7 |
| 1.902 | -0.7 |
| 1.903 | -0.699 |
| 1.904 | -0.699 |
| 1.905 | -0.699 |
| 1.906 | -0.699 |
| 1.907 | -0.699 |
| 1.908 | -0.698 |
| 1.909 | -0.698 |
| 1.91 | -0.698 |
| 1.911 | -0.698 |
| 1.912 | -0.697 |
| 1.913 | -0.697 |
| 1.914 | -0.697 |
| 1.915 | -0.697 |
| 1.916 | -0.697 |
| 1.917 | -0.696 |
| 1.918 | -0.696 |
| 1.919 | -0.696 |
| 1.92 | -0.696 |
| 1.921 | -0.695 |
| 1.922 | -0.695 |
| 1.923 | -0.695 |
| 1.924 | -0.695 |
| 1.925 | -0.695 |
| 1.926 | -0.694 |
| 1.927 | -0.694 |
| 1.928 | -0.694 |
| 1.929 | -0.694 |
| 1.93 | -0.693 |
| 1.931 | -0.693 |
| 1.932 | -0.693 |
| 1.933 | -0.693 |
| 1.934 | -0.692 |
| 1.935 | -0.692 |
| 1.936 | -0.692 |
| 1.937 | -0.692 |
| 1.938 | -0.692 |
| 1.939 | -0.691 |
| 1.94 | -0.691 |
| 1.941 | -0.691 |
| 1.942 | -0.691 |
| 1.943 | -0.69 |
| 1.944 | -0.69 |
| 1.945 | -0.69 |
| 1.946 | -0.69 |
| 1.947 | -0.69 |
| 1.948 | -0.689 |
| 1.949 | -0.689 |
| 1.95 | -0.689 |
| 1.951 | -0.689 |
| 1.952 | -0.688 |
| 1.953 | -0.688 |
| 1.954 | -0.688 |
| 1.955 | -0.688 |
| 1.956 | -0.687 |
| 1.957 | -0.687 |
| 1.958 | -0.687 |
| 1.959 | -0.687 |
| 1.96 | -0.687 |
| 1.961 | -0.686 |
| 1.962 | -0.686 |
| 1.963 | -0.686 |
| 1.964 | -0.686 |
| 1.965 | -0.685 |
| 1.966 | -0.685 |
| 1.967 | -0.685 |
| 1.968 | -0.685 |
| 1.969 | -0.685 |
| 1.97 | -0.684 |
| 1.971 | -0.684 |
| 1.972 | -0.684 |
| 1.973 | -0.684 |
| 1.974 | -0.683 |
| 1.975 | -0.683 |
| 1.976 | -0.683 |
| 1.977 | -0.683 |
| 1.978 | -0.682 |
| 1.979 | -0.682 |
| 1.98 | -0.682 |
| 1.981 | -0.682 |
| 1.982 | -0.682 |
| 1.983 | -0.681 |
| 1.984 | -0.681 |
| 1.985 | -0.681 |
| 1.986 | -0.681 |
| 1.987 | -0.68 |
| 1.988 | -0.68 |
| 1.989 | -0.68 |
| 1.99 | -0.68 |
| 1.991 | -0.679 |
| 1.992 | -0.679 |
| 1.993 | -0.679 |
| 1.994 | -0.679 |
| 1.995 | -0.679 |
| 1.996 | -0.678 |
| 1.997 | -0.678 |
| 1.998 | -0.678 |
| 1.999 | -0.678 |
| 2.0 | -0.677 |
| 2.001 | -0.677 |
| 2.002 | -0.677 |
| 2.003 | -0.677 |
| 2.004 | -0.676 |
| 2.005 | -0.676 |
| 2.006 | -0.676 |
| 2.007 | -0.676 |
| 2.008 | -0.676 |
| 2.009 | -0.675 |
| 2.01 | -0.675 |
| 2.011 | -0.675 |
| 2.012 | -0.675 |
| 2.013 | -0.674 |
| 2.014 | -0.674 |
| 2.015 | -0.674 |
| 2.016 | -0.674 |
| 2.017 | -0.673 |
| 2.018 | -0.673 |
| 2.019 | -0.673 |
| 2.02 | -0.673 |
| 2.021 | -0.672 |
| 2.022 | -0.672 |
| 2.023 | -0.672 |
| 2.024 | -0.672 |
| 2.025 | -0.672 |
| 2.026 | -0.671 |
| 2.027 | -0.671 |
| 2.028 | -0.671 |
| 2.029 | -0.671 |
| 2.03 | -0.67 |
| 2.031 | -0.67 |
| 2.032 | -0.67 |
| 2.033 | -0.67 |
| 2.034 | -0.669 |
| 2.035 | -0.669 |
| 2.036 | -0.669 |
| 2.037 | -0.669 |
| 2.038 | -0.669 |
| 2.039 | -0.668 |
| 2.04 | -0.668 |
| 2.041 | -0.668 |
| 2.042 | -0.668 |
| 2.043 | -0.667 |
| 2.044 | -0.667 |
| 2.045 | -0.667 |
| 2.046 | -0.667 |
| 2.047 | -0.666 |
| 2.048 | -0.666 |
| 2.049 | -0.666 |
| 2.05 | -0.666 |
| 2.051 | -0.665 |
| 2.052 | -0.665 |
| 2.053 | -0.665 |
| 2.054 | -0.665 |
| 2.055 | -0.665 |
| 2.056 | -0.664 |
| 2.057 | -0.664 |
| 2.058 | -0.664 |
| 2.059 | -0.664 |
| 2.06 | -0.663 |
| 2.061 | -0.663 |
| 2.062 | -0.663 |
| 2.063 | -0.663 |
| 2.064 | -0.662 |
| 2.065 | -0.662 |
| 2.066 | -0.662 |
| 2.067 | -0.662 |
| 2.068 | -0.661 |
| 2.069 | -0.661 |
| 2.07 | -0.661 |
| 2.071 | -0.661 |
| 2.072 | -0.66 |
| 2.073 | -0.66 |
| 2.074 | -0.66 |
| 2.075 | -0.66 |
| 2.076 | -0.66 |
| 2.077 | -0.659 |
| 2.078 | -0.659 |
| 2.079 | -0.659 |
| 2.08 | -0.659 |
| 2.081 | -0.658 |
| 2.082 | -0.658 |
| 2.083 | -0.658 |
| 2.084 | -0.658 |
| 2.085 | -0.657 |
| 2.086 | -0.657 |
| 2.087 | -0.657 |
| 2.088 | -0.657 |
| 2.089 | -0.656 |
| 2.09 | -0.656 |
| 2.091 | -0.656 |
| 2.092 | -0.656 |
| 2.093 | -0.656 |
| 2.094 | -0.655 |
| 2.095 | -0.655 |
| 2.096 | -0.655 |
| 2.097 | -0.655 |
| 2.098 | -0.654 |
| 2.099 | -0.654 |
| 2.1 | -0.654 |
| 2.101 | -0.654 |
| 2.102 | -0.653 |
| 2.103 | -0.653 |
| 2.104 | -0.653 |
| 2.105 | -0.653 |
| 2.106 | -0.652 |
| 2.107 | -0.652 |
| 2.108 | -0.652 |
| 2.109 | -0.652 |
| 2.11 | -0.651 |
| 2.111 | -0.651 |
| 2.112 | -0.651 |
| 2.113 | -0.651 |
| 2.114 | -0.65 |
| 2.115 | -0.65 |
| 2.116 | -0.65 |
| 2.117 | -0.65 |
| 2.118 | -0.65 |
| 2.119 | -0.649 |
| 2.12 | -0.649 |
| 2.121 | -0.649 |
| 2.122 | -0.649 |
| 2.123 | -0.648 |
| 2.124 | -0.648 |
| 2.125 | -0.648 |
| 2.126 | -0.648 |
| 2.127 | -0.647 |
| 2.128 | -0.647 |
| 2.129 | -0.647 |
| 2.13 | -0.647 |
| 2.131 | -0.646 |
| 2.132 | -0.646 |
| 2.133 | -0.646 |
| 2.134 | -0.646 |
| 2.135 | -0.645 |
| 2.136 | -0.645 |
| 2.137 | -0.645 |
| 2.138 | -0.645 |
| 2.139 | -0.644 |
| 2.14 | -0.644 |
| 2.141 | -0.644 |
| 2.142 | -0.644 |
| 2.143 | -0.643 |
| 2.144 | -0.643 |
| 2.145 | -0.643 |
| 2.146 | -0.643 |
| 2.147 | -0.642 |
| 2.148 | -0.642 |
| 2.149 | -0.642 |
| 2.15 | -0.642 |
| 2.151 | -0.642 |
| 2.152 | -0.641 |
| 2.153 | -0.641 |
| 2.154 | -0.641 |
| 2.155 | -0.641 |
| 2.156 | -0.64 |
| 2.157 | -0.64 |
| 2.158 | -0.64 |
| 2.159 | -0.64 |
| 2.16 | -0.639 |
| 2.161 | -0.639 |
| 2.162 | -0.639 |
| 2.163 | -0.639 |
| 2.164 | -0.638 |
| 2.165 | -0.638 |
| 2.166 | -0.638 |
| 2.167 | -0.638 |
| 2.168 | -0.637 |
| 2.169 | -0.637 |
| 2.17 | -0.637 |
| 2.171 | -0.637 |
| 2.172 | -0.636 |
| 2.173 | -0.636 |
| 2.174 | -0.636 |
| 2.175 | -0.636 |
| 2.176 | -0.635 |
| 2.177 | -0.635 |
| 2.178 | -0.635 |
| 2.179 | -0.635 |
| 2.18 | -0.634 |
| 2.181 | -0.634 |
| 2.182 | -0.634 |
| 2.183 | -0.634 |
| 2.184 | -0.633 |
| 2.185 | -0.633 |
| 2.186 | -0.633 |
| 2.187 | -0.633 |
| 2.188 | -0.632 |
| 2.189 | -0.632 |
| 2.19 | -0.632 |
| 2.191 | -0.632 |
| 2.192 | -0.631 |
| 2.193 | -0.631 |
| 2.194 | -0.631 |
| 2.195 | -0.631 |
| 2.196 | -0.63 |
| 2.197 | -0.63 |
| 2.198 | -0.63 |
| 2.199 | -0.63 |
| 2.2 | -0.629 |
| 2.201 | -0.629 |
| 2.202 | -0.629 |
| 2.203 | -0.629 |
| 2.204 | -0.628 |
| 2.205 | -0.628 |
| 2.206 | -0.628 |
| 2.207 | -0.628 |
| 2.208 | -0.628 |
| 2.209 | -0.627 |
| 2.21 | -0.627 |
| 2.211 | -0.627 |
| 2.212 | -0.627 |
| 2.213 | -0.626 |
| 2.214 | -0.626 |
| 2.215 | -0.626 |
| 2.216 | -0.626 |
| 2.217 | -0.625 |
| 2.218 | -0.625 |
| 2.219 | -0.625 |
| 2.22 | -0.625 |
| 2.221 | -0.624 |
| 2.222 | -0.624 |
| 2.223 | -0.624 |
| 2.224 | -0.624 |
| 2.225 | -0.623 |
| 2.226 | -0.623 |
| 2.227 | -0.623 |
| 2.228 | -0.623 |
| 2.229 | -0.622 |
| 2.23 | -0.622 |
| 2.231 | -0.622 |
| 2.232 | -0.622 |
| 2.233 | -0.621 |
| 2.234 | -0.621 |
| 2.235 | -0.621 |
| 2.236 | -0.621 |
| 2.237 | -0.62 |
| 2.238 | -0.62 |
| 2.239 | -0.62 |
| 2.24 | -0.62 |
| 2.241 | -0.619 |
| 2.242 | -0.619 |
| 2.243 | -0.619 |
| 2.244 | -0.619 |
| 2.245 | -0.618 |
| 2.246 | -0.618 |
| 2.247 | -0.618 |
| 2.248 | -0.618 |
| 2.249 | -0.617 |
| 2.25 | -0.617 |
| 2.251 | -0.617 |
| 2.252 | -0.616 |
| 2.253 | -0.616 |
| 2.254 | -0.616 |
| 2.255 | -0.616 |
| 2.256 | -0.615 |
| 2.257 | -0.615 |
| 2.258 | -0.615 |
| 2.259 | -0.615 |
| 2.26 | -0.614 |
| 2.261 | -0.614 |
| 2.262 | -0.614 |
| 2.263 | -0.614 |
| 2.264 | -0.613 |
| 2.265 | -0.613 |
| 2.266 | -0.613 |
| 2.267 | -0.613 |
| 2.268 | -0.612 |
| 2.269 | -0.612 |
| 2.27 | -0.612 |
| 2.271 | -0.612 |
| 2.272 | -0.611 |
| 2.273 | -0.611 |
| 2.274 | -0.611 |
| 2.275 | -0.611 |
| 2.276 | -0.61 |
| 2.277 | -0.61 |
| 2.278 | -0.61 |
| 2.279 | -0.61 |
| 2.28 | -0.609 |
| 2.281 | -0.609 |
| 2.282 | -0.609 |
| 2.283 | -0.609 |
| 2.284 | -0.608 |
| 2.285 | -0.608 |
| 2.286 | -0.608 |
| 2.287 | -0.608 |
| 2.288 | -0.607 |
| 2.289 | -0.607 |
| 2.29 | -0.607 |
| 2.291 | -0.607 |
| 2.292 | -0.606 |
| 2.293 | -0.606 |
| 2.294 | -0.606 |
| 2.295 | -0.606 |
| 2.296 | -0.605 |
| 2.297 | -0.605 |
| 2.298 | -0.605 |
| 2.299 | -0.605 |
| 2.3 | -0.604 |
| 2.301 | -0.604 |
| 2.302 | -0.604 |
| 2.303 | -0.604 |
| 2.304 | -0.603 |
| 2.305 | -0.603 |
| 2.306 | -0.603 |
| 2.307 | -0.602 |
| 2.308 | -0.602 |
| 2.309 | -0.602 |
| 2.31 | -0.602 |
| 2.311 | -0.601 |
| 2.312 | -0.601 |
| 2.313 | -0.601 |
| 2.314 | -0.601 |
| 2.315 | -0.6 |
| 2.316 | -0.6 |
| 2.317 | -0.6 |
| 2.318 | -0.6 |
| 2.319 | -0.599 |
| 2.32 | -0.599 |
| 2.321 | -0.599 |
| 2.322 | -0.599 |
| 2.323 | -0.598 |
| 2.324 | -0.598 |
| 2.325 | -0.598 |
| 2.326 | -0.598 |
| 2.327 | -0.597 |
| 2.328 | -0.597 |
| 2.329 | -0.597 |
| 2.33 | -0.597 |
| 2.331 | -0.596 |
| 2.332 | -0.596 |
| 2.333 | -0.596 |
| 2.334 | -0.596 |
| 2.335 | -0.595 |
| 2.336 | -0.595 |
| 2.337 | -0.595 |
| 2.338 | -0.594 |
| 2.339 | -0.594 |
| 2.34 | -0.594 |
| 2.341 | -0.594 |
| 2.342 | -0.593 |
| 2.343 | -0.593 |
| 2.344 | -0.593 |
| 2.345 | -0.593 |
| 2.346 | -0.592 |
| 2.347 | -0.592 |
| 2.348 | -0.592 |
| 2.349 | -0.592 |
| 2.35 | -0.591 |
| 2.351 | -0.591 |
| 2.352 | -0.591 |
| 2.353 | -0.591 |
| 2.354 | -0.59 |
| 2.355 | -0.59 |
| 2.356 | -0.59 |
| 2.357 | -0.59 |
| 2.358 | -0.589 |
| 2.359 | -0.589 |
| 2.36 | -0.589 |
| 2.361 | -0.588 |
| 2.362 | -0.588 |
| 2.363 | -0.588 |
| 2.364 | -0.588 |
| 2.365 | -0.587 |
| 2.366 | -0.587 |
| 2.367 | -0.587 |
| 2.368 | -0.587 |
| 2.369 | -0.586 |
| 2.37 | -0.586 |
| 2.371 | -0.586 |
| 2.372 | -0.586 |
| 2.373 | -0.585 |
| 2.374 | -0.585 |
| 2.375 | -0.585 |
| 2.376 | -0.584 |
| 2.377 | -0.584 |
| 2.378 | -0.584 |
| 2.379 | -0.584 |
| 2.38 | -0.583 |
| 2.381 | -0.583 |
| 2.382 | -0.583 |
| 2.383 | -0.583 |
| 2.384 | -0.582 |
| 2.385 | -0.582 |
| 2.386 | -0.582 |
| 2.387 | -0.582 |
| 2.388 | -0.581 |
| 2.389 | -0.581 |
| 2.39 | -0.581 |
| 2.391 | -0.581 |
| 2.392 | -0.58 |
| 2.393 | -0.58 |
| 2.394 | -0.58 |
| 2.395 | -0.579 |
| 2.396 | -0.579 |
| 2.397 | -0.579 |
| 2.398 | -0.579 |
| 2.399 | -0.578 |
| 2.4 | -0.578 |
| 2.401 | -0.578 |
| 2.402 | -0.578 |
| 2.403 | -0.577 |
| 2.404 | -0.577 |
| 2.405 | -0.577 |
| 2.406 | -0.577 |
| 2.407 | -0.576 |
| 2.408 | -0.576 |
| 2.409 | -0.576 |
| 2.41 | -0.575 |
| 2.411 | -0.575 |
| 2.412 | -0.575 |
| 2.413 | -0.575 |
| 2.414 | -0.574 |
| 2.415 | -0.574 |
| 2.416 | -0.574 |
| 2.417 | -0.574 |
| 2.418 | -0.573 |
| 2.419 | -0.573 |
| 2.42 | -0.573 |
| 2.421 | -0.573 |
| 2.422 | -0.572 |
| 2.423 | -0.572 |
| 2.424 | -0.572 |
| 2.425 | -0.571 |
| 2.426 | -0.571 |
| 2.427 | -0.571 |
| 2.428 | -0.571 |
| 2.429 | -0.57 |
| 2.43 | -0.57 |
| 2.431 | -0.57 |
| 2.432 | -0.57 |
| 2.433 | -0.569 |
| 2.434 | -0.569 |
| 2.435 | -0.569 |
| 2.436 | -0.568 |
| 2.437 | -0.568 |
| 2.438 | -0.568 |
| 2.439 | -0.568 |
| 2.44 | -0.567 |
| 2.441 | -0.567 |
| 2.442 | -0.567 |
| 2.443 | -0.567 |
| 2.444 | -0.566 |
| 2.445 | -0.566 |
| 2.446 | -0.566 |
| 2.447 | -0.566 |
| 2.448 | -0.565 |
| 2.449 | -0.565 |
| 2.45 | -0.565 |
| 2.451 | -0.564 |
| 2.452 | -0.564 |
| 2.453 | -0.564 |
| 2.454 | -0.564 |
| 2.455 | -0.563 |
| 2.456 | -0.563 |
| 2.457 | -0.563 |
| 2.458 | -0.563 |
| 2.459 | -0.562 |
| 2.46 | -0.562 |
| 2.461 | -0.562 |
| 2.462 | -0.561 |
| 2.463 | -0.561 |
| 2.464 | -0.561 |
| 2.465 | -0.561 |
| 2.466 | -0.56 |
| 2.467 | -0.56 |
| 2.468 | -0.56 |
| 2.469 | -0.56 |
| 2.47 | -0.559 |
| 2.471 | -0.559 |
| 2.472 | -0.559 |
| 2.473 | -0.558 |
| 2.474 | -0.558 |
| 2.475 | -0.558 |
| 2.476 | -0.558 |
| 2.477 | -0.557 |
| 2.478 | -0.557 |
| 2.479 | -0.557 |
| 2.48 | -0.557 |
| 2.481 | -0.556 |
| 2.482 | -0.556 |
| 2.483 | -0.556 |
| 2.484 | -0.555 |
| 2.485 | -0.555 |
| 2.486 | -0.555 |
| 2.487 | -0.555 |
| 2.488 | -0.554 |
| 2.489 | -0.554 |
| 2.49 | -0.554 |
| 2.491 | -0.554 |
| 2.492 | -0.553 |
| 2.493 | -0.553 |
| 2.494 | -0.553 |
| 2.495 | -0.552 |
| 2.496 | -0.552 |
| 2.497 | -0.552 |
| 2.498 | -0.552 |
| 2.499 | -0.551 |
| 2.5 | -0.551 |
| 2.501 | -0.551 |
| 2.502 | -0.55 |
| 2.503 | -0.55 |
| 2.504 | -0.55 |
| 2.505 | -0.55 |
| 2.506 | -0.549 |
| 2.507 | -0.549 |
| 2.508 | -0.549 |
| 2.509 | -0.549 |
| 2.51 | -0.548 |
| 2.511 | -0.548 |
| 2.512 | -0.548 |
| 2.513 | -0.547 |
| 2.514 | -0.547 |
| 2.515 | -0.547 |
| 2.516 | -0.547 |
| 2.517 | -0.546 |
| 2.518 | -0.546 |
| 2.519 | -0.546 |
| 2.52 | -0.545 |
| 2.521 | -0.545 |
| 2.522 | -0.545 |
| 2.523 | -0.545 |
| 2.524 | -0.544 |
| 2.525 | -0.544 |
| 2.526 | -0.544 |
| 2.527 | -0.544 |
| 2.528 | -0.543 |
| 2.529 | -0.543 |
| 2.53 | -0.543 |
| 2.531 | -0.542 |
| 2.532 | -0.542 |
| 2.533 | -0.542 |
| 2.534 | -0.542 |
| 2.535 | -0.541 |
| 2.536 | -0.541 |
| 2.537 | -0.541 |
| 2.538 | -0.54 |
| 2.539 | -0.54 |
| 2.54 | -0.54 |
| 2.541 | -0.54 |
| 2.542 | -0.539 |
| 2.543 | -0.539 |
| 2.544 | -0.539 |
| 2.545 | -0.538 |
| 2.546 | -0.538 |
| 2.547 | -0.538 |
| 2.548 | -0.538 |
| 2.549 | -0.537 |
| 2.55 | -0.537 |
| 2.551 | -0.537 |
| 2.552 | -0.537 |
| 2.553 | -0.536 |
| 2.554 | -0.536 |
| 2.555 | -0.536 |
| 2.556 | -0.535 |
| 2.557 | -0.535 |
| 2.558 | -0.535 |
| 2.559 | -0.535 |
| 2.56 | -0.534 |
| 2.561 | -0.534 |
| 2.562 | -0.534 |
| 2.563 | -0.533 |
| 2.564 | -0.533 |
| 2.565 | -0.533 |
| 2.566 | -0.533 |
| 2.567 | -0.532 |
| 2.568 | -0.532 |
| 2.569 | -0.532 |
| 2.57 | -0.531 |
| 2.571 | -0.531 |
| 2.572 | -0.531 |
| 2.573 | -0.531 |
| 2.574 | -0.53 |
| 2.575 | -0.53 |
| 2.576 | -0.53 |
| 2.577 | -0.529 |
| 2.578 | -0.529 |
| 2.579 | -0.529 |
| 2.58 | -0.529 |
| 2.581 | -0.528 |
| 2.582 | -0.528 |
| 2.583 | -0.528 |
| 2.584 | -0.527 |
| 2.585 | -0.527 |
| 2.586 | -0.527 |
| 2.587 | -0.527 |
| 2.588 | -0.526 |
| 2.589 | -0.526 |
| 2.59 | -0.526 |
| 2.591 | -0.525 |
| 2.592 | -0.525 |
| 2.593 | -0.525 |
| 2.594 | -0.525 |
| 2.595 | -0.524 |
| 2.596 | -0.524 |
| 2.597 | -0.524 |
| 2.598 | -0.523 |
| 2.599 | -0.523 |
| 2.6 | -0.523 |
| 2.601 | -0.523 |
| 2.602 | -0.522 |
| 2.603 | -0.522 |
| 2.604 | -0.522 |
| 2.605 | -0.521 |
| 2.606 | -0.521 |
| 2.607 | -0.521 |
| 2.608 | -0.521 |
| 2.609 | -0.52 |
| 2.61 | -0.52 |
| 2.611 | -0.52 |
| 2.612 | -0.519 |
| 2.613 | -0.519 |
| 2.614 | -0.519 |
| 2.615 | -0.519 |
| 2.616 | -0.518 |
| 2.617 | -0.518 |
| 2.618 | -0.518 |
| 2.619 | -0.517 |
| 2.62 | -0.517 |
| 2.621 | -0.517 |
| 2.622 | -0.517 |
| 2.623 | -0.516 |
| 2.624 | -0.516 |
| 2.625 | -0.516 |
| 2.626 | -0.515 |
| 2.627 | -0.515 |
| 2.628 | -0.515 |
| 2.629 | -0.515 |
| 2.63 | -0.514 |
| 2.631 | -0.514 |
| 2.632 | -0.514 |
| 2.633 | -0.513 |
| 2.634 | -0.513 |
| 2.635 | -0.513 |
| 2.636 | -0.513 |
| 2.637 | -0.512 |
| 2.638 | -0.512 |
| 2.639 | -0.512 |
| 2.64 | -0.511 |
| 2.641 | -0.511 |
| 2.642 | -0.511 |
| 2.643 | -0.51 |
| 2.644 | -0.51 |
| 2.645 | -0.51 |
| 2.646 | -0.51 |
| 2.647 | -0.509 |
| 2.648 | -0.509 |
| 2.649 | -0.509 |
| 2.65 | -0.508 |
| 2.651 | -0.508 |
| 2.652 | -0.508 |
| 2.653 | -0.508 |
| 2.654 | -0.507 |
| 2.655 | -0.507 |
| 2.656 | -0.507 |
| 2.657 | -0.506 |
| 2.658 | -0.506 |
| 2.659 | -0.506 |
| 2.66 | -0.506 |
| 2.661 | -0.505 |
| 2.662 | -0.505 |
| 2.663 | -0.505 |
| 2.664 | -0.504 |
| 2.665 | -0.504 |
| 2.666 | -0.504 |
| 2.667 | -0.503 |
| 2.668 | -0.503 |
| 2.669 | -0.503 |
| 2.67 | -0.503 |
| 2.671 | -0.502 |
| 2.672 | -0.502 |
| 2.673 | -0.502 |
| 2.674 | -0.501 |
| 2.675 | -0.501 |
| 2.676 | -0.501 |
| 2.677 | -0.501 |
| 2.678 | -0.5 |
| 2.679 | -0.5 |
| 2.68 | -0.5 |
| 2.681 | -0.499 |
| 2.682 | -0.499 |
| 2.683 | -0.499 |
| 2.684 | -0.498 |
| 2.685 | -0.498 |
| 2.686 | -0.498 |
| 2.687 | -0.498 |
| 2.688 | -0.497 |
| 2.689 | -0.497 |
| 2.69 | -0.497 |
| 2.691 | -0.496 |
| 2.692 | -0.496 |
| 2.693 | -0.496 |
| 2.694 | -0.496 |
| 2.695 | -0.495 |
| 2.696 | -0.495 |
| 2.697 | -0.495 |
| 2.698 | -0.494 |
| 2.699 | -0.494 |
| 2.7 | -0.494 |
| 2.701 | -0.493 |
| 2.702 | -0.493 |
| 2.703 | -0.493 |
| 2.704 | -0.493 |
| 2.705 | -0.492 |
| 2.706 | -0.492 |
| 2.707 | -0.492 |
| 2.708 | -0.491 |
| 2.709 | -0.491 |
| 2.71 | -0.491 |
| 2.711 | -0.49 |
| 2.712 | -0.49 |
| 2.713 | -0.49 |
| 2.714 | -0.49 |
| 2.715 | -0.489 |
| 2.716 | -0.489 |
| 2.717 | -0.489 |
| 2.718 | -0.488 |
| 2.719 | -0.488 |
| 2.72 | -0.488 |
| 2.721 | -0.487 |
| 2.722 | -0.487 |
| 2.723 | -0.487 |
| 2.724 | -0.487 |
| 2.725 | -0.486 |
| 2.726 | -0.486 |
| 2.727 | -0.486 |
| 2.728 | -0.485 |
| 2.729 | -0.485 |
| 2.73 | -0.485 |
| 2.731 | -0.484 |
| 2.732 | -0.484 |
| 2.733 | -0.484 |
| 2.734 | -0.484 |
| 2.735 | -0.483 |
| 2.736 | -0.483 |
| 2.737 | -0.483 |
| 2.738 | -0.482 |
| 2.739 | -0.482 |
| 2.74 | -0.482 |
| 2.741 | -0.481 |
| 2.742 | -0.481 |
| 2.743 | -0.481 |
| 2.744 | -0.481 |
| 2.745 | -0.48 |
| 2.746 | -0.48 |
| 2.747 | -0.48 |
| 2.748 | -0.479 |
| 2.749 | -0.479 |
| 2.75 | -0.479 |
| 2.751 | -0.478 |
| 2.752 | -0.478 |
| 2.753 | -0.478 |
| 2.754 | -0.478 |
| 2.755 | -0.477 |
| 2.756 | -0.477 |
| 2.757 | -0.477 |
| 2.758 | -0.476 |
| 2.759 | -0.476 |
| 2.76 | -0.476 |
| 2.761 | -0.475 |
| 2.762 | -0.475 |
| 2.763 | -0.475 |
| 2.764 | -0.475 |
| 2.765 | -0.474 |
| 2.766 | -0.474 |
| 2.767 | -0.474 |
| 2.768 | -0.473 |
| 2.769 | -0.473 |
| 2.77 | -0.473 |
| 2.771 | -0.472 |
| 2.772 | -0.472 |
| 2.773 | -0.472 |
| 2.774 | -0.471 |
| 2.775 | -0.471 |
| 2.776 | -0.471 |
| 2.777 | -0.471 |
| 2.778 | -0.47 |
| 2.779 | -0.47 |
| 2.78 | -0.47 |
| 2.781 | -0.469 |
| 2.782 | -0.469 |
| 2.783 | -0.469 |
| 2.784 | -0.468 |
| 2.785 | -0.468 |
| 2.786 | -0.468 |
| 2.787 | -0.468 |
| 2.788 | -0.467 |
| 2.789 | -0.467 |
| 2.79 | -0.467 |
| 2.791 | -0.466 |
| 2.792 | -0.466 |
| 2.793 | -0.466 |
| 2.794 | -0.465 |
| 2.795 | -0.465 |
| 2.796 | -0.465 |
| 2.797 | -0.464 |
| 2.798 | -0.464 |
| 2.799 | -0.464 |
| 2.8 | -0.464 |
| 2.801 | -0.463 |
| 2.802 | -0.463 |
| 2.803 | -0.463 |
| 2.804 | -0.462 |
| 2.805 | -0.462 |
| 2.806 | -0.462 |
| 2.807 | -0.461 |
| 2.808 | -0.461 |
| 2.809 | -0.461 |
| 2.81 | -0.46 |
| 2.811 | -0.46 |
| 2.812 | -0.46 |
| 2.813 | -0.46 |
| 2.814 | -0.459 |
| 2.815 | -0.459 |
| 2.816 | -0.459 |
| 2.817 | -0.458 |
| 2.818 | -0.458 |
| 2.819 | -0.458 |
| 2.82 | -0.457 |
| 2.821 | -0.457 |
| 2.822 | -0.457 |
| 2.823 | -0.456 |
| 2.824 | -0.456 |
| 2.825 | -0.456 |
| 2.826 | -0.455 |
| 2.827 | -0.455 |
| 2.828 | -0.455 |
| 2.829 | -0.455 |
| 2.83 | -0.454 |
| 2.831 | -0.454 |
| 2.832 | -0.454 |
| 2.833 | -0.453 |
| 2.834 | -0.453 |
| 2.835 | -0.453 |
| 2.836 | -0.452 |
| 2.837 | -0.452 |
| 2.838 | -0.452 |
| 2.839 | -0.451 |
| 2.84 | -0.451 |
| 2.841 | -0.451 |
| 2.842 | -0.45 |
| 2.843 | -0.45 |
| 2.844 | -0.45 |
| 2.845 | -0.45 |
| 2.846 | -0.449 |
| 2.847 | -0.449 |
| 2.848 | -0.449 |
| 2.849 | -0.448 |
| 2.85 | -0.448 |
| 2.851 | -0.448 |
| 2.852 | -0.447 |
| 2.853 | -0.447 |
| 2.854 | -0.447 |
| 2.855 | -0.446 |
| 2.856 | -0.446 |
| 2.857 | -0.446 |
| 2.858 | -0.445 |
| 2.859 | -0.445 |
| 2.86 | -0.445 |
| 2.861 | -0.445 |
| 2.862 | -0.444 |
| 2.863 | -0.444 |
| 2.864 | -0.444 |
| 2.865 | -0.443 |
| 2.866 | -0.443 |
| 2.867 | -0.443 |
| 2.868 | -0.442 |
| 2.869 | -0.442 |
| 2.87 | -0.442 |
| 2.871 | -0.441 |
| 2.872 | -0.441 |
| 2.873 | -0.441 |
| 2.874 | -0.44 |
| 2.875 | -0.44 |
| 2.876 | -0.44 |
| 2.877 | -0.439 |
| 2.878 | -0.439 |
| 2.879 | -0.439 |
| 2.88 | -0.439 |
| 2.881 | -0.438 |
| 2.882 | -0.438 |
| 2.883 | -0.438 |
| 2.884 | -0.437 |
| 2.885 | -0.437 |
| 2.886 | -0.437 |
| 2.887 | -0.436 |
| 2.888 | -0.436 |
| 2.889 | -0.436 |
| 2.89 | -0.435 |
| 2.891 | -0.435 |
| 2.892 | -0.435 |
| 2.893 | -0.434 |
| 2.894 | -0.434 |
| 2.895 | -0.434 |
| 2.896 | -0.433 |
| 2.897 | -0.433 |
| 2.898 | -0.433 |
| 2.899 | -0.432 |
| 2.9 | -0.432 |
| 2.901 | -0.432 |
| 2.902 | -0.432 |
| 2.903 | -0.431 |
| 2.904 | -0.431 |
| 2.905 | -0.431 |
| 2.906 | -0.43 |
| 2.907 | -0.43 |
| 2.908 | -0.43 |
| 2.909 | -0.429 |
| 2.91 | -0.429 |
| 2.911 | -0.429 |
| 2.912 | -0.428 |
| 2.913 | -0.428 |
| 2.914 | -0.428 |
| 2.915 | -0.427 |
| 2.916 | -0.427 |
| 2.917 | -0.427 |
| 2.918 | -0.426 |
| 2.919 | -0.426 |
| 2.92 | -0.426 |
| 2.921 | -0.425 |
| 2.922 | -0.425 |
| 2.923 | -0.425 |
| 2.924 | -0.424 |
| 2.925 | -0.424 |
| 2.926 | -0.424 |
| 2.927 | -0.424 |
| 2.928 | -0.423 |
| 2.929 | -0.423 |
| 2.93 | -0.423 |
| 2.931 | -0.422 |
| 2.932 | -0.422 |
| 2.933 | -0.422 |
| 2.934 | -0.421 |
| 2.935 | -0.421 |
| 2.936 | -0.421 |
| 2.937 | -0.42 |
| 2.938 | -0.42 |
| 2.939 | -0.42 |
| 2.94 | -0.419 |
| 2.941 | -0.419 |
| 2.942 | -0.419 |
| 2.943 | -0.418 |
| 2.944 | -0.418 |
| 2.945 | -0.418 |
| 2.946 | -0.417 |
| 2.947 | -0.417 |
| 2.948 | -0.417 |
| 2.949 | -0.416 |
| 2.95 | -0.416 |
| 2.951 | -0.416 |
| 2.952 | -0.415 |
| 2.953 | -0.415 |
| 2.954 | -0.415 |
| 2.955 | -0.414 |
| 2.956 | -0.414 |
| 2.957 | -0.414 |
| 2.958 | -0.413 |
| 2.959 | -0.413 |
| 2.96 | -0.413 |
| 2.961 | -0.412 |
| 2.962 | -0.412 |
| 2.963 | -0.412 |
| 2.964 | -0.412 |
| 2.965 | -0.411 |
| 2.966 | -0.411 |
| 2.967 | -0.411 |
| 2.968 | -0.41 |
| 2.969 | -0.41 |
| 2.97 | -0.41 |
| 2.971 | -0.409 |
| 2.972 | -0.409 |
| 2.973 | -0.409 |
| 2.974 | -0.408 |
| 2.975 | -0.408 |
| 2.976 | -0.408 |
| 2.977 | -0.407 |
| 2.978 | -0.407 |
| 2.979 | -0.407 |
| 2.98 | -0.406 |
| 2.981 | -0.406 |
| 2.982 | -0.406 |
| 2.983 | -0.405 |
| 2.984 | -0.405 |
| 2.985 | -0.405 |
| 2.986 | -0.404 |
| 2.987 | -0.404 |
| 2.988 | -0.404 |
| 2.989 | -0.403 |
| 2.99 | -0.403 |
| 2.991 | -0.403 |
| 2.992 | -0.402 |
| 2.993 | -0.402 |
| 2.994 | -0.402 |
| 2.995 | -0.401 |
| 2.996 | -0.401 |
| 2.997 | -0.401 |
| 2.998 | -0.4 |
| 2.999 | -0.4 |
| 3.0 | -0.4 |
| 3.001 | -0.399 |
| 3.002 | -0.399 |
| 3.003 | -0.399 |
| 3.004 | -0.398 |
| 3.005 | -0.398 |
| 3.006 | -0.398 |
| 3.007 | -0.397 |
| 3.008 | -0.397 |
| 3.009 | -0.397 |
| 3.01 | -0.396 |
| 3.011 | -0.396 |
| 3.012 | -0.396 |
| 3.013 | -0.395 |
| 3.014 | -0.395 |
| 3.015 | -0.395 |
| 3.016 | -0.394 |
| 3.017 | -0.394 |
| 3.018 | -0.394 |
| 3.019 | -0.393 |
| 3.02 | -0.393 |
| 3.021 | -0.393 |
| 3.022 | -0.392 |
| 3.023 | -0.392 |
| 3.024 | -0.392 |
| 3.025 | -0.391 |
| 3.026 | -0.391 |
| 3.027 | -0.391 |
| 3.028 | -0.39 |
| 3.029 | -0.39 |
| 3.03 | -0.39 |
| 3.031 | -0.389 |
| 3.032 | -0.389 |
| 3.033 | -0.389 |
| 3.034 | -0.388 |
| 3.035 | -0.388 |
| 3.036 | -0.388 |
| 3.037 | -0.387 |
| 3.038 | -0.387 |
| 3.039 | -0.387 |
| 3.04 | -0.386 |
| 3.041 | -0.386 |
| 3.042 | -0.386 |
| 3.043 | -0.385 |
| 3.044 | -0.385 |
| 3.045 | -0.385 |
| 3.046 | -0.384 |
| 3.047 | -0.384 |
| 3.048 | -0.384 |
| 3.049 | -0.383 |
| 3.05 | -0.383 |
| 3.051 | -0.383 |
| 3.052 | -0.382 |
| 3.053 | -0.382 |
| 3.054 | -0.382 |
| 3.055 | -0.381 |
| 3.056 | -0.381 |
| 3.057 | -0.381 |
| 3.058 | -0.38 |
| 3.059 | -0.38 |
| 3.06 | -0.38 |
| 3.061 | -0.379 |
| 3.062 | -0.379 |
| 3.063 | -0.379 |
| 3.064 | -0.378 |
| 3.065 | -0.378 |
| 3.066 | -0.378 |
| 3.067 | -0.377 |
| 3.068 | -0.377 |
| 3.069 | -0.377 |
| 3.07 | -0.376 |
| 3.071 | -0.376 |
| 3.072 | -0.376 |
| 3.073 | -0.375 |
| 3.074 | -0.375 |
| 3.075 | -0.375 |
| 3.076 | -0.374 |
| 3.077 | -0.374 |
| 3.078 | -0.374 |
| 3.079 | -0.373 |
| 3.08 | -0.373 |
| 3.081 | -0.373 |
| 3.082 | -0.372 |
| 3.083 | -0.372 |
| 3.084 | -0.372 |
| 3.085 | -0.371 |
| 3.086 | -0.371 |
| 3.087 | -0.37 |
| 3.088 | -0.37 |
| 3.089 | -0.37 |
| 3.09 | -0.369 |
| 3.091 | -0.369 |
| 3.092 | -0.369 |
| 3.093 | -0.368 |
| 3.094 | -0.368 |
| 3.095 | -0.368 |
| 3.096 | -0.367 |
| 3.097 | -0.367 |
| 3.098 | -0.367 |
| 3.099 | -0.366 |
| 3.1 | -0.366 |
| 3.101 | -0.366 |
| 3.102 | -0.365 |
| 3.103 | -0.365 |
| 3.104 | -0.365 |
| 3.105 | -0.364 |
| 3.106 | -0.364 |
| 3.107 | -0.364 |
| 3.108 | -0.363 |
| 3.109 | -0.363 |
| 3.11 | -0.363 |
| 3.111 | -0.362 |
| 3.112 | -0.362 |
| 3.113 | -0.362 |
| 3.114 | -0.361 |
| 3.115 | -0.361 |
| 3.116 | -0.361 |
| 3.117 | -0.36 |
| 3.118 | -0.36 |
| 3.119 | -0.36 |
| 3.12 | -0.359 |
| 3.121 | -0.359 |
| 3.122 | -0.358 |
| 3.123 | -0.358 |
| 3.124 | -0.358 |
| 3.125 | -0.357 |
| 3.126 | -0.357 |
| 3.127 | -0.357 |
| 3.128 | -0.356 |
| 3.129 | -0.356 |
| 3.13 | -0.356 |
| 3.131 | -0.355 |
| 3.132 | -0.355 |
| 3.133 | -0.355 |
| 3.134 | -0.354 |
| 3.135 | -0.354 |
| 3.136 | -0.354 |
| 3.137 | -0.353 |
| 3.138 | -0.353 |
| 3.139 | -0.353 |
| 3.14 | -0.352 |
| 3.141 | -0.352 |
| 3.142 | -0.352 |
| 3.143 | -0.351 |
| 3.144 | -0.351 |
| 3.145 | -0.351 |
| 3.146 | -0.35 |
| 3.147 | -0.35 |
| 3.148 | -0.349 |
| 3.149 | -0.349 |
| 3.15 | -0.349 |
| 3.151 | -0.348 |
| 3.152 | -0.348 |
| 3.153 | -0.348 |
| 3.154 | -0.347 |
| 3.155 | -0.347 |
| 3.156 | -0.347 |
| 3.157 | -0.346 |
| 3.158 | -0.346 |
| 3.159 | -0.346 |
| 3.16 | -0.345 |
| 3.161 | -0.345 |
| 3.162 | -0.345 |
| 3.163 | -0.344 |
| 3.164 | -0.344 |
| 3.165 | -0.344 |
| 3.166 | -0.343 |
| 3.167 | -0.343 |
| 3.168 | -0.342 |
| 3.169 | -0.342 |
| 3.17 | -0.342 |
| 3.171 | -0.341 |
| 3.172 | -0.341 |
| 3.173 | -0.341 |
| 3.174 | -0.34 |
| 3.175 | -0.34 |
| 3.176 | -0.34 |
| 3.177 | -0.339 |
| 3.178 | -0.339 |
| 3.179 | -0.339 |
| 3.18 | -0.338 |
| 3.181 | -0.338 |
| 3.182 | -0.338 |
| 3.183 | -0.337 |
| 3.184 | -0.337 |
| 3.185 | -0.337 |
| 3.186 | -0.336 |
| 3.187 | -0.336 |
| 3.188 | -0.335 |
| 3.189 | -0.335 |
| 3.19 | -0.335 |
| 3.191 | -0.334 |
| 3.192 | -0.334 |
| 3.193 | -0.334 |
| 3.194 | -0.333 |
| 3.195 | -0.333 |
| 3.196 | -0.333 |
| 3.197 | -0.332 |
| 3.198 | -0.332 |
| 3.199 | -0.332 |
| 3.2 | -0.331 |
| 3.201 | -0.331 |
| 3.202 | -0.33 |
| 3.203 | -0.33 |
| 3.204 | -0.33 |
| 3.205 | -0.329 |
| 3.206 | -0.329 |
| 3.207 | -0.329 |
| 3.208 | -0.328 |
| 3.209 | -0.328 |
| 3.21 | -0.328 |
| 3.211 | -0.327 |
| 3.212 | -0.327 |
| 3.213 | -0.327 |
| 3.214 | -0.326 |
| 3.215 | -0.326 |
| 3.216 | -0.326 |
| 3.217 | -0.325 |
| 3.218 | -0.325 |
| 3.219 | -0.324 |
| 3.22 | -0.324 |
| 3.221 | -0.324 |
| 3.222 | -0.323 |
| 3.223 | -0.323 |
| 3.224 | -0.323 |
| 3.225 | -0.322 |
| 3.226 | -0.322 |
| 3.227 | -0.322 |
| 3.228 | -0.321 |
| 3.229 | -0.321 |
| 3.23 | -0.321 |
| 3.231 | -0.32 |
| 3.232 | -0.32 |
| 3.233 | -0.319 |
| 3.234 | -0.319 |
| 3.235 | -0.319 |
| 3.236 | -0.318 |
| 3.237 | -0.318 |
| 3.238 | -0.318 |
| 3.239 | -0.317 |
| 3.24 | -0.317 |
| 3.241 | -0.317 |
| 3.242 | -0.316 |
| 3.243 | -0.316 |
| 3.244 | -0.316 |
| 3.245 | -0.315 |
| 3.246 | -0.315 |
| 3.247 | -0.314 |
| 3.248 | -0.314 |
| 3.249 | -0.314 |
| 3.25 | -0.313 |
| 3.251 | -0.313 |
| 3.252 | -0.313 |
| 3.253 | -0.312 |
| 3.254 | -0.312 |
| 3.255 | -0.312 |
| 3.256 | -0.311 |
| 3.257 | -0.311 |
| 3.258 | -0.31 |
| 3.259 | -0.31 |
| 3.26 | -0.31 |
| 3.261 | -0.309 |
| 3.262 | -0.309 |
| 3.263 | -0.309 |
| 3.264 | -0.308 |
| 3.265 | -0.308 |
| 3.266 | -0.308 |
| 3.267 | -0.307 |
| 3.268 | -0.307 |
| 3.269 | -0.306 |
| 3.27 | -0.306 |
| 3.271 | -0.306 |
| 3.272 | -0.305 |
| 3.273 | -0.305 |
| 3.274 | -0.305 |
| 3.275 | -0.304 |
| 3.276 | -0.304 |
| 3.277 | -0.304 |
| 3.278 | -0.303 |
| 3.279 | -0.303 |
| 3.28 | -0.302 |
| 3.281 | -0.302 |
| 3.282 | -0.302 |
| 3.283 | -0.301 |
| 3.284 | -0.301 |
| 3.285 | -0.301 |
| 3.286 | -0.3 |
| 3.287 | -0.3 |
| 3.288 | -0.3 |
| 3.289 | -0.299 |
| 3.29 | -0.299 |
| 3.291 | -0.298 |
| 3.292 | -0.298 |
| 3.293 | -0.298 |
| 3.294 | -0.297 |
| 3.295 | -0.297 |
| 3.296 | -0.297 |
| 3.297 | -0.296 |
| 3.298 | -0.296 |
| 3.299 | -0.296 |
| 3.3 | -0.295 |
| 3.301 | -0.295 |
| 3.302 | -0.294 |
| 3.303 | -0.294 |
| 3.304 | -0.294 |
| 3.305 | -0.293 |
| 3.306 | -0.293 |
| 3.307 | -0.293 |
| 3.308 | -0.292 |
| 3.309 | -0.292 |
| 3.31 | -0.292 |
| 3.311 | -0.291 |
| 3.312 | -0.291 |
| 3.313 | -0.29 |
| 3.314 | -0.29 |
| 3.315 | -0.29 |
| 3.316 | -0.289 |
| 3.317 | -0.289 |
| 3.318 | -0.289 |
| 3.319 | -0.288 |
| 3.32 | -0.288 |
| 3.321 | -0.287 |
| 3.322 | -0.287 |
| 3.323 | -0.287 |
| 3.324 | -0.286 |
| 3.325 | -0.286 |
| 3.326 | -0.286 |
| 3.327 | -0.285 |
| 3.328 | -0.285 |
| 3.329 | -0.284 |
| 3.33 | -0.284 |
| 3.331 | -0.284 |
| 3.332 | -0.283 |
| 3.333 | -0.283 |
| 3.334 | -0.283 |
| 3.335 | -0.282 |
| 3.336 | -0.282 |
| 3.337 | -0.282 |
| 3.338 | -0.281 |
| 3.339 | -0.281 |
| 3.34 | -0.28 |
| 3.341 | -0.28 |
| 3.342 | -0.28 |
| 3.343 | -0.279 |
| 3.344 | -0.279 |
| 3.345 | -0.279 |
| 3.346 | -0.278 |
| 3.347 | -0.278 |
| 3.348 | -0.277 |
| 3.349 | -0.277 |
| 3.35 | -0.277 |
| 3.351 | -0.276 |
| 3.352 | -0.276 |
| 3.353 | -0.276 |
| 3.354 | -0.275 |
| 3.355 | -0.275 |
| 3.356 | -0.274 |
| 3.357 | -0.274 |
| 3.358 | -0.274 |
| 3.359 | -0.273 |
| 3.36 | -0.273 |
| 3.361 | -0.273 |
| 3.362 | -0.272 |
| 3.363 | -0.272 |
| 3.364 | -0.271 |
| 3.365 | -0.271 |
| 3.366 | -0.271 |
| 3.367 | -0.27 |
| 3.368 | -0.27 |
| 3.369 | -0.27 |
| 3.37 | -0.269 |
| 3.371 | -0.269 |
| 3.372 | -0.268 |
| 3.373 | -0.268 |
| 3.374 | -0.268 |
| 3.375 | -0.267 |
| 3.376 | -0.267 |
| 3.377 | -0.267 |
| 3.378 | -0.266 |
| 3.379 | -0.266 |
| 3.38 | -0.265 |
| 3.381 | -0.265 |
| 3.382 | -0.265 |
| 3.383 | -0.264 |
| 3.384 | -0.264 |
| 3.385 | -0.264 |
| 3.386 | -0.263 |
| 3.387 | -0.263 |
| 3.388 | -0.262 |
| 3.389 | -0.262 |
| 3.39 | -0.262 |
| 3.391 | -0.261 |
| 3.392 | -0.261 |
| 3.393 | -0.261 |
| 3.394 | -0.26 |
| 3.395 | -0.26 |
| 3.396 | -0.259 |
| 3.397 | -0.259 |
| 3.398 | -0.259 |
| 3.399 | -0.258 |
| 3.4 | -0.258 |
| 3.401 | -0.258 |
| 3.402 | -0.257 |
| 3.403 | -0.257 |
| 3.404 | -0.256 |
| 3.405 | -0.256 |
| 3.406 | -0.256 |
| 3.407 | -0.255 |
| 3.408 | -0.255 |
| 3.409 | -0.254 |
| 3.41 | -0.254 |
| 3.411 | -0.254 |
| 3.412 | -0.253 |
| 3.413 | -0.253 |
| 3.414 | -0.253 |
| 3.415 | -0.252 |
| 3.416 | -0.252 |
| 3.417 | -0.251 |
| 3.418 | -0.251 |
| 3.419 | -0.251 |
| 3.42 | -0.25 |
| 3.421 | -0.25 |
| 3.422 | -0.25 |
| 3.423 | -0.249 |
| 3.424 | -0.249 |
| 3.425 | -0.248 |
| 3.426 | -0.248 |
| 3.427 | -0.248 |
| 3.428 | -0.247 |
| 3.429 | -0.247 |
| 3.43 | -0.246 |
| 3.431 | -0.246 |
| 3.432 | -0.246 |
| 3.433 | -0.245 |
| 3.434 | -0.245 |
| 3.435 | -0.245 |
| 3.436 | -0.244 |
| 3.437 | -0.244 |
| 3.438 | -0.243 |
| 3.439 | -0.243 |
| 3.44 | -0.243 |
| 3.441 | -0.242 |
| 3.442 | -0.242 |
| 3.443 | -0.241 |
| 3.444 | -0.241 |
| 3.445 | -0.241 |
| 3.446 | -0.24 |
| 3.447 | -0.24 |
| 3.448 | -0.24 |
| 3.449 | -0.239 |
| 3.45 | -0.239 |
| 3.451 | -0.238 |
| 3.452 | -0.238 |
| 3.453 | -0.238 |
| 3.454 | -0.237 |
| 3.455 | -0.237 |
| 3.456 | -0.236 |
| 3.457 | -0.236 |
| 3.458 | -0.236 |
| 3.459 | -0.235 |
| 3.46 | -0.235 |
| 3.461 | -0.235 |
| 3.462 | -0.234 |
| 3.463 | -0.234 |
| 3.464 | -0.233 |
| 3.465 | -0.233 |
| 3.466 | -0.233 |
| 3.467 | -0.232 |
| 3.468 | -0.232 |
| 3.469 | -0.231 |
| 3.47 | -0.231 |
| 3.471 | -0.231 |
| 3.472 | -0.23 |
| 3.473 | -0.23 |
| 3.474 | -0.23 |
| 3.475 | -0.229 |
| 3.476 | -0.229 |
| 3.477 | -0.228 |
| 3.478 | -0.228 |
| 3.479 | -0.228 |
| 3.48 | -0.227 |
| 3.481 | -0.227 |
| 3.482 | -0.226 |
| 3.483 | -0.226 |
| 3.484 | -0.226 |
| 3.485 | -0.225 |
| 3.486 | -0.225 |
| 3.487 | -0.224 |
| 3.488 | -0.224 |
| 3.489 | -0.224 |
| 3.49 | -0.223 |
| 3.491 | -0.223 |
| 3.492 | -0.222 |
| 3.493 | -0.222 |
| 3.494 | -0.222 |
| 3.495 | -0.221 |
| 3.496 | -0.221 |
| 3.497 | -0.221 |
| 3.498 | -0.22 |
| 3.499 | -0.22 |
| 3.5 | -0.219 |
| 3.501 | -0.219 |
| 3.502 | -0.219 |
| 3.503 | -0.218 |
| 3.504 | -0.218 |
| 3.505 | -0.217 |
| 3.506 | -0.217 |
| 3.507 | -0.217 |
| 3.508 | -0.216 |
| 3.509 | -0.216 |
| 3.51 | -0.215 |
| 3.511 | -0.215 |
| 3.512 | -0.215 |
| 3.513 | -0.214 |
| 3.514 | -0.214 |
| 3.515 | -0.213 |
| 3.516 | -0.213 |
| 3.517 | -0.213 |
| 3.518 | -0.212 |
| 3.519 | -0.212 |
| 3.52 | -0.211 |
| 3.521 | -0.211 |
| 3.522 | -0.211 |
| 3.523 | -0.21 |
| 3.524 | -0.21 |
| 3.525 | -0.21 |
| 3.526 | -0.209 |
| 3.527 | -0.209 |
| 3.528 | -0.208 |
| 3.529 | -0.208 |
| 3.53 | -0.208 |
| 3.531 | -0.207 |
| 3.532 | -0.207 |
| 3.533 | -0.206 |
| 3.534 | -0.206 |
| 3.535 | -0.206 |
| 3.536 | -0.205 |
| 3.537 | -0.205 |
| 3.538 | -0.204 |
| 3.539 | -0.204 |
| 3.54 | -0.204 |
| 3.541 | -0.203 |
| 3.542 | -0.203 |
| 3.543 | -0.202 |
| 3.544 | -0.202 |
| 3.545 | -0.202 |
| 3.546 | -0.201 |
| 3.547 | -0.201 |
| 3.548 | -0.2 |
| 3.549 | -0.2 |
| 3.55 | -0.2 |
| 3.551 | -0.199 |
| 3.552 | -0.199 |
| 3.553 | -0.198 |
| 3.554 | -0.198 |
| 3.555 | -0.198 |
| 3.556 | -0.197 |
| 3.557 | -0.197 |
| 3.558 | -0.196 |
| 3.559 | -0.196 |
| 3.56 | -0.196 |
| 3.561 | -0.195 |
| 3.562 | -0.195 |
| 3.563 | -0.194 |
| 3.564 | -0.194 |
| 3.565 | -0.194 |
| 3.566 | -0.193 |
| 3.567 | -0.193 |
| 3.568 | -0.192 |
| 3.569 | -0.192 |
| 3.57 | -0.192 |
| 3.571 | -0.191 |
| 3.572 | -0.191 |
| 3.573 | -0.19 |
| 3.574 | -0.19 |
| 3.575 | -0.19 |
| 3.576 | -0.189 |
| 3.577 | -0.189 |
| 3.578 | -0.188 |
| 3.579 | -0.188 |
| 3.58 | -0.188 |
| 3.581 | -0.187 |
| 3.582 | -0.187 |
| 3.583 | -0.186 |
| 3.584 | -0.186 |
| 3.585 | -0.186 |
| 3.586 | -0.185 |
| 3.587 | -0.185 |
| 3.588 | -0.184 |
| 3.589 | -0.184 |
| 3.59 | -0.184 |
| 3.591 | -0.183 |
| 3.592 | -0.183 |
| 3.593 | -0.182 |
| 3.594 | -0.182 |
| 3.595 | -0.182 |
| 3.596 | -0.181 |
| 3.597 | -0.181 |
| 3.598 | -0.18 |
| 3.599 | -0.18 |
| 3.6 | -0.18 |
| 3.601 | -0.179 |
| 3.602 | -0.179 |
| 3.603 | -0.178 |
| 3.604 | -0.178 |
| 3.605 | -0.178 |
| 3.606 | -0.177 |
| 3.607 | -0.177 |
| 3.608 | -0.176 |
| 3.609 | -0.176 |
| 3.61 | -0.175 |
| 3.611 | -0.175 |
| 3.612 | -0.175 |
| 3.613 | -0.174 |
| 3.614 | -0.174 |
| 3.615 | -0.173 |
| 3.616 | -0.173 |
| 3.617 | -0.173 |
| 3.618 | -0.172 |
| 3.619 | -0.172 |
| 3.62 | -0.171 |
| 3.621 | -0.171 |
| 3.622 | -0.171 |
| 3.623 | -0.17 |
| 3.624 | -0.17 |
| 3.625 | -0.169 |
| 3.626 | -0.169 |
| 3.627 | -0.169 |
| 3.628 | -0.168 |
| 3.629 | -0.168 |
| 3.63 | -0.167 |
| 3.631 | -0.167 |
| 3.632 | -0.166 |
| 3.633 | -0.166 |
| 3.634 | -0.166 |
| 3.635 | -0.165 |
| 3.636 | -0.165 |
| 3.637 | -0.164 |
| 3.638 | -0.164 |
| 3.639 | -0.164 |
| 3.64 | -0.163 |
| 3.641 | -0.163 |
| 3.642 | -0.162 |
| 3.643 | -0.162 |
| 3.644 | -0.162 |
| 3.645 | -0.161 |
| 3.646 | -0.161 |
| 3.647 | -0.16 |
| 3.648 | -0.16 |
| 3.649 | -0.16 |
| 3.65 | -0.159 |
| 3.651 | -0.159 |
| 3.652 | -0.158 |
| 3.653 | -0.158 |
| 3.654 | -0.157 |
| 3.655 | -0.157 |
| 3.656 | -0.157 |
| 3.657 | -0.156 |
| 3.658 | -0.156 |
| 3.659 | -0.155 |
| 3.66 | -0.155 |
| 3.661 | -0.155 |
| 3.662 | -0.154 |
| 3.663 | -0.154 |
| 3.664 | -0.153 |
| 3.665 | -0.153 |
| 3.666 | -0.153 |
| 3.667 | -0.152 |
| 3.668 | -0.152 |
| 3.669 | -0.151 |
| 3.67 | -0.151 |
| 3.671 | -0.15 |
| 3.672 | -0.15 |
| 3.673 | -0.15 |
| 3.674 | -0.149 |
| 3.675 | -0.149 |
| 3.676 | -0.148 |
| 3.677 | -0.148 |
| 3.678 | -0.148 |
| 3.679 | -0.147 |
| 3.68 | -0.147 |
| 3.681 | -0.146 |
| 3.682 | -0.146 |
| 3.683 | -0.145 |
| 3.684 | -0.145 |
| 3.685 | -0.145 |
| 3.686 | -0.144 |
| 3.687 | -0.144 |
| 3.688 | -0.143 |
| 3.689 | -0.143 |
| 3.69 | -0.143 |
| 3.691 | -0.142 |
| 3.692 | -0.142 |
| 3.693 | -0.141 |
| 3.694 | -0.141 |
| 3.695 | -0.14 |
| 3.696 | -0.14 |
| 3.697 | -0.14 |
| 3.698 | -0.139 |
| 3.699 | -0.139 |
| 3.7 | -0.138 |
| 3.701 | -0.138 |
| 3.702 | -0.138 |
| 3.703 | -0.137 |
| 3.704 | -0.137 |
| 3.705 | -0.136 |
| 3.706 | -0.136 |
| 3.707 | -0.135 |
| 3.708 | -0.135 |
| 3.709 | -0.135 |
| 3.71 | -0.134 |
| 3.711 | -0.134 |
| 3.712 | -0.133 |
| 3.713 | -0.133 |
| 3.714 | -0.133 |
| 3.715 | -0.132 |
| 3.716 | -0.132 |
| 3.717 | -0.131 |
| 3.718 | -0.131 |
| 3.719 | -0.13 |
| 3.72 | -0.13 |
| 3.721 | -0.13 |
| 3.722 | -0.129 |
| 3.723 | -0.129 |
| 3.724 | -0.128 |
| 3.725 | -0.128 |
| 3.726 | -0.127 |
| 3.727 | -0.127 |
| 3.728 | -0.127 |
| 3.729 | -0.126 |
| 3.73 | -0.126 |
| 3.731 | -0.125 |
| 3.732 | -0.125 |
| 3.733 | -0.125 |
| 3.734 | -0.124 |
| 3.735 | -0.124 |
| 3.736 | -0.123 |
| 3.737 | -0.123 |
| 3.738 | -0.122 |
| 3.739 | -0.122 |
| 3.74 | -0.122 |
| 3.741 | -0.121 |
| 3.742 | -0.121 |
| 3.743 | -0.12 |
| 3.744 | -0.12 |
| 3.745 | -0.119 |
| 3.746 | -0.119 |
| 3.747 | -0.119 |
| 3.748 | -0.118 |
| 3.749 | -0.118 |
| 3.75 | -0.117 |
| 3.751 | -0.117 |
| 3.752 | -0.116 |
| 3.753 | -0.116 |
| 3.754 | -0.116 |
| 3.755 | -0.115 |
| 3.756 | -0.115 |
| 3.757 | -0.114 |
| 3.758 | -0.114 |
| 3.759 | -0.113 |
| 3.76 | -0.113 |
| 3.761 | -0.113 |
| 3.762 | -0.112 |
| 3.763 | -0.112 |
| 3.764 | -0.111 |
| 3.765 | -0.111 |
| 3.766 | -0.11 |
| 3.767 | -0.11 |
| 3.768 | -0.11 |
| 3.769 | -0.109 |
| 3.77 | -0.109 |
| 3.771 | -0.108 |
| 3.772 | -0.108 |
| 3.773 | -0.108 |
| 3.774 | -0.107 |
| 3.775 | -0.107 |
| 3.776 | -0.106 |
| 3.777 | -0.106 |
| 3.778 | -0.105 |
| 3.779 | -0.105 |
| 3.78 | -0.105 |
| 3.781 | -0.104 |
| 3.782 | -0.104 |
| 3.783 | -0.103 |
| 3.784 | -0.103 |
| 3.785 | -0.102 |
| 3.786 | -0.102 |
| 3.787 | -0.102 |
| 3.788 | -0.101 |
| 3.789 | -0.101 |
| 3.79 | -0.1 |
| 3.791 | -0.1 |
| 3.792 | -0.099 |
| 3.793 | -0.099 |
| 3.794 | -0.098 |
| 3.795 | -0.098 |
| 3.796 | -0.098 |
| 3.797 | -0.097 |
| 3.798 | -0.097 |
| 3.799 | -0.096 |
| 3.8 | -0.096 |
| 3.801 | -0.095 |
| 3.802 | -0.095 |
| 3.803 | -0.095 |
| 3.804 | -0.094 |
| 3.805 | -0.094 |
| 3.806 | -0.093 |
| 3.807 | -0.093 |
| 3.808 | -0.092 |
| 3.809 | -0.092 |
| 3.81 | -0.092 |
| 3.811 | -0.091 |
| 3.812 | -0.091 |
| 3.813 | -0.09 |
| 3.814 | -0.09 |
| 3.815 | -0.089 |
| 3.816 | -0.089 |
| 3.817 | -0.089 |
| 3.818 | -0.088 |
| 3.819 | -0.088 |
| 3.82 | -0.087 |
| 3.821 | -0.087 |
| 3.822 | -0.086 |
| 3.823 | -0.086 |
| 3.824 | -0.086 |
| 3.825 | -0.085 |
| 3.826 | -0.085 |
| 3.827 | -0.084 |
| 3.828 | -0.084 |
| 3.829 | -0.083 |
| 3.83 | -0.083 |
| 3.831 | -0.082 |
| 3.832 | -0.082 |
| 3.833 | -0.082 |
| 3.834 | -0.081 |
| 3.835 | -0.081 |
| 3.836 | -0.08 |
| 3.837 | -0.08 |
| 3.838 | -0.079 |
| 3.839 | -0.079 |
| 3.84 | -0.079 |
| 3.841 | -0.078 |
| 3.842 | -0.078 |
| 3.843 | -0.077 |
| 3.844 | -0.077 |
| 3.845 | -0.076 |
| 3.846 | -0.076 |
| 3.847 | -0.075 |
| 3.848 | -0.075 |
| 3.849 | -0.075 |
| 3.85 | -0.074 |
| 3.851 | -0.074 |
| 3.852 | -0.073 |
| 3.853 | -0.073 |
| 3.854 | -0.072 |
| 3.855 | -0.072 |
| 3.856 | -0.072 |
| 3.857 | -0.071 |
| 3.858 | -0.071 |
| 3.859 | -0.07 |
| 3.86 | -0.07 |
| 3.861 | -0.069 |
| 3.862 | -0.069 |
| 3.863 | -0.068 |
| 3.864 | -0.068 |
| 3.865 | -0.068 |
| 3.866 | -0.067 |
| 3.867 | -0.067 |
| 3.868 | -0.066 |
| 3.869 | -0.066 |
| 3.87 | -0.065 |
| 3.871 | -0.065 |
| 3.872 | -0.064 |
| 3.873 | -0.064 |
| 3.874 | -0.064 |
| 3.875 | -0.063 |
| 3.876 | -0.063 |
| 3.877 | -0.062 |
| 3.878 | -0.062 |
| 3.879 | -0.061 |
| 3.88 | -0.061 |
| 3.881 | -0.06 |
| 3.882 | -0.06 |
| 3.883 | -0.06 |
| 3.884 | -0.059 |
| 3.885 | -0.059 |
| 3.886 | -0.058 |
| 3.887 | -0.058 |
| 3.888 | -0.057 |
| 3.889 | -0.057 |
| 3.89 | -0.057 |
| 3.891 | -0.056 |
| 3.892 | -0.056 |
| 3.893 | -0.055 |
| 3.894 | -0.055 |
| 3.895 | -0.054 |
| 3.896 | -0.054 |
| 3.897 | -0.053 |
| 3.898 | -0.053 |
| 3.899 | -0.053 |
| 3.9 | -0.052 |
| 3.901 | -0.052 |
| 3.902 | -0.051 |
| 3.903 | -0.051 |
| 3.904 | -0.05 |
| 3.905 | -0.05 |
| 3.906 | -0.049 |
| 3.907 | -0.049 |
| 3.908 | -0.048 |
| 3.909 | -0.048 |
| 3.91 | -0.048 |
| 3.911 | -0.047 |
| 3.912 | -0.047 |
| 3.913 | -0.046 |
| 3.914 | -0.046 |
| 3.915 | -0.045 |
| 3.916 | -0.045 |
| 3.917 | -0.044 |
| 3.918 | -0.044 |
| 3.919 | -0.044 |
| 3.92 | -0.043 |
| 3.921 | -0.043 |
| 3.922 | -0.042 |
| 3.923 | -0.042 |
| 3.924 | -0.041 |
| 3.925 | -0.041 |
| 3.926 | -0.04 |
| 3.927 | -0.04 |
| 3.928 | -0.04 |
| 3.929 | -0.039 |
| 3.93 | -0.039 |
| 3.931 | -0.038 |
| 3.932 | -0.038 |
| 3.933 | -0.037 |
| 3.934 | -0.037 |
| 3.935 | -0.036 |
| 3.936 | -0.036 |
| 3.937 | -0.035 |
| 3.938 | -0.035 |
| 3.939 | -0.035 |
| 3.94 | -0.034 |
| 3.941 | -0.034 |
| 3.942 | -0.033 |
| 3.943 | -0.033 |
| 3.944 | -0.032 |
| 3.945 | -0.032 |
| 3.946 | -0.031 |
| 3.947 | -0.031 |
| 3.948 | -0.031 |
| 3.949 | -0.03 |
| 3.95 | -0.03 |
| 3.951 | -0.029 |
| 3.952 | -0.029 |
| 3.953 | -0.028 |
| 3.954 | -0.028 |
| 3.955 | -0.027 |
| 3.956 | -0.027 |
| 3.957 | -0.026 |
| 3.958 | -0.026 |
| 3.959 | -0.026 |
| 3.96 | -0.025 |
| 3.961 | -0.025 |
| 3.962 | -0.024 |
| 3.963 | -0.024 |
| 3.964 | -0.023 |
| 3.965 | -0.023 |
| 3.966 | -0.022 |
| 3.967 | -0.022 |
| 3.968 | -0.021 |
| 3.969 | -0.021 |
| 3.97 | -0.021 |
| 3.971 | -0.02 |
| 3.972 | -0.02 |
| 3.973 | -0.019 |
| 3.974 | -0.019 |
| 3.975 | -0.018 |
| 3.976 | -0.018 |
| 3.977 | -0.017 |
| 3.978 | -0.017 |
| 3.979 | -0.016 |
| 3.98 | -0.016 |
| 3.981 | -0.016 |
| 3.982 | -0.015 |
| 3.983 | -0.015 |
| 3.984 | -0.014 |
| 3.985 | -0.014 |
| 3.986 | -0.013 |
| 3.987 | -0.013 |
| 3.988 | -0.012 |
| 3.989 | -0.012 |
| 3.99 | -0.011 |
| 3.991 | -0.011 |
| 3.992 | -0.01 |
| 3.993 | -0.01 |
| 3.994 | -0.01 |
| 3.995 | -0.009 |
| 3.996 | -0.009 |
| 3.997 | -0.008 |
| 3.998 | -0.008 |
| 3.999 | -0.007 |
| 4.0 | -0.007 |
| 4.001 | -0.006 |
| 4.002 | -0.006 |
| 4.003 | -0.005 |
| 4.004 | -0.005 |
| 4.005 | -0.005 |
| 4.006 | -0.004 |
| 4.007 | -0.004 |
| 4.008 | -0.003 |
| 4.009 | -0.003 |
| 4.01 | -0.002 |
| 4.011 | -0.002 |
| 4.012 | -0.001 |
| 4.013 | -0.001 |
| 4.014 | 0 |
| 4.015 | 0 |
| 4.016 | 0.001 |
| 4.017 | 0.001 |
| 4.018 | 0.001 |
| 4.019 | 0.002 |
| 4.02 | 0.002 |
| 4.021 | 0.003 |
| 4.022 | 0.003 |
| 4.023 | 0.004 |
| 4.024 | 0.004 |
| 4.025 | 0.005 |
| 4.026 | 0.005 |
| 4.027 | 0.006 |
| 4.028 | 0.006 |
| 4.029 | 0.007 |
| 4.03 | 0.007 |
| 4.031 | 0.007 |
| 4.032 | 0.008 |
| 4.033 | 0.008 |
| 4.034 | 0.009 |
| 4.035 | 0.009 |
| 4.036 | 0.01 |
| 4.037 | 0.01 |
| 4.038 | 0.011 |
| 4.039 | 0.011 |
| 4.04 | 0.012 |
| 4.041 | 0.012 |
| 4.042 | 0.013 |
| 4.043 | 0.013 |
| 4.044 | 0.014 |
| 4.045 | 0.014 |
| 4.046 | 0.014 |
| 4.047 | 0.015 |
| 4.048 | 0.015 |
| 4.049 | 0.016 |
| 4.05 | 0.016 |
| 4.051 | 0.017 |
| 4.052 | 0.017 |
| 4.053 | 0.018 |
| 4.054 | 0.018 |
| 4.055 | 0.019 |
| 4.056 | 0.019 |
| 4.057 | 0.02 |
| 4.058 | 0.02 |
| 4.059 | 0.021 |
| 4.06 | 0.021 |
| 4.061 | 0.021 |
| 4.062 | 0.022 |
| 4.063 | 0.022 |
| 4.064 | 0.023 |
| 4.065 | 0.023 |
| 4.066 | 0.024 |
| 4.067 | 0.024 |
| 4.068 | 0.025 |
| 4.069 | 0.025 |
| 4.07 | 0.026 |
| 4.071 | 0.026 |
| 4.072 | 0.027 |
| 4.073 | 0.027 |
| 4.074 | 0.028 |
| 4.075 | 0.028 |
| 4.076 | 0.028 |
| 4.077 | 0.029 |
| 4.078 | 0.029 |
| 4.079 | 0.03 |
| 4.08 | 0.03 |
| 4.081 | 0.031 |
| 4.082 | 0.031 |
| 4.083 | 0.032 |
| 4.084 | 0.032 |
| 4.085 | 0.033 |
| 4.086 | 0.033 |
| 4.087 | 0.034 |
| 4.088 | 0.034 |
| 4.089 | 0.035 |
| 4.09 | 0.035 |
| 4.091 | 0.036 |
| 4.092 | 0.036 |
| 4.093 | 0.037 |
| 4.094 | 0.037 |
| 4.095 | 0.037 |
| 4.096 | 0.038 |
| 4.097 | 0.038 |
| 4.098 | 0.039 |
| 4.099 | 0.039 |
| 4.1 | 0.04 |
| 4.101 | 0.04 |
| 4.102 | 0.041 |
| 4.103 | 0.041 |
| 4.104 | 0.042 |
| 4.105 | 0.042 |
| 4.106 | 0.043 |
| 4.107 | 0.043 |
| 4.108 | 0.044 |
| 4.109 | 0.044 |
| 4.11 | 0.045 |
| 4.111 | 0.045 |
| 4.112 | 0.046 |
| 4.113 | 0.046 |
| 4.114 | 0.046 |
| 4.115 | 0.047 |
| 4.116 | 0.047 |
| 4.117 | 0.048 |
| 4.118 | 0.048 |
| 4.119 | 0.049 |
| 4.12 | 0.049 |
| 4.121 | 0.05 |
| 4.122 | 0.05 |
| 4.123 | 0.051 |
| 4.124 | 0.051 |
| 4.125 | 0.052 |
| 4.126 | 0.052 |
| 4.127 | 0.053 |
| 4.128 | 0.053 |
| 4.129 | 0.054 |
| 4.13 | 0.054 |
| 4.131 | 0.055 |
| 4.132 | 0.055 |
| 4.133 | 0.056 |
| 4.134 | 0.056 |
| 4.135 | 0.056 |
| 4.136 | 0.057 |
| 4.137 | 0.057 |
| 4.138 | 0.058 |
| 4.139 | 0.058 |
| 4.14 | 0.059 |
| 4.141 | 0.059 |
| 4.142 | 0.06 |
| 4.143 | 0.06 |
| 4.144 | 0.061 |
| 4.145 | 0.061 |
| 4.146 | 0.062 |
| 4.147 | 0.062 |
| 4.148 | 0.063 |
| 4.149 | 0.063 |
| 4.15 | 0.064 |
| 4.151 | 0.064 |
| 4.152 | 0.065 |
| 4.153 | 0.065 |
| 4.154 | 0.066 |
| 4.155 | 0.066 |
| 4.156 | 0.067 |
| 4.157 | 0.067 |
| 4.158 | 0.068 |
| 4.159 | 0.068 |
| 4.16 | 0.068 |
| 4.161 | 0.069 |
| 4.162 | 0.069 |
| 4.163 | 0.07 |
| 4.164 | 0.07 |
| 4.165 | 0.071 |
| 4.166 | 0.071 |
| 4.167 | 0.072 |
| 4.168 | 0.072 |
| 4.169 | 0.073 |
| 4.17 | 0.073 |
| 4.171 | 0.074 |
| 4.172 | 0.074 |
| 4.173 | 0.075 |
| 4.174 | 0.075 |
| 4.175 | 0.076 |
| 4.176 | 0.076 |
| 4.177 | 0.077 |
| 4.178 | 0.077 |
| 4.179 | 0.078 |
| 4.18 | 0.078 |
| 4.181 | 0.079 |
| 4.182 | 0.079 |
| 4.183 | 0.08 |
| 4.184 | 0.08 |
| 4.185 | 0.081 |
| 4.186 | 0.081 |
| 4.187 | 0.082 |
| 4.188 | 0.082 |
| 4.189 | 0.083 |
| 4.19 | 0.083 |
| 4.191 | 0.084 |
| 4.192 | 0.084 |
| 4.193 | 0.084 |
| 4.194 | 0.085 |
| 4.195 | 0.085 |
| 4.196 | 0.086 |
| 4.197 | 0.086 |
| 4.198 | 0.087 |
| 4.199 | 0.087 |
| 4.2 | 0.088 |
| 4.201 | 0.088 |
| 4.202 | 0.089 |
| 4.203 | 0.089 |
| 4.204 | 0.09 |
| 4.205 | 0.09 |
| 4.206 | 0.091 |
| 4.207 | 0.091 |
| 4.208 | 0.092 |
| 4.209 | 0.092 |
| 4.21 | 0.093 |
| 4.211 | 0.093 |
| 4.212 | 0.094 |
| 4.213 | 0.094 |
| 4.214 | 0.095 |
| 4.215 | 0.095 |
| 4.216 | 0.096 |
| 4.217 | 0.096 |
| 4.218 | 0.097 |
| 4.219 | 0.097 |
| 4.22 | 0.098 |
| 4.221 | 0.098 |
| 4.222 | 0.099 |
| 4.223 | 0.099 |
| 4.224 | 0.1 |
| 4.225 | 0.1 |
| 4.226 | 0.101 |
| 4.227 | 0.101 |
| 4.228 | 0.102 |
| 4.229 | 0.102 |
| 4.23 | 0.103 |
| 4.231 | 0.103 |
| 4.232 | 0.104 |
| 4.233 | 0.104 |
| 4.234 | 0.105 |
| 4.235 | 0.105 |
| 4.236 | 0.106 |
| 4.237 | 0.106 |
| 4.238 | 0.107 |
| 4.239 | 0.107 |
| 4.24 | 0.108 |
| 4.241 | 0.108 |
| 4.242 | 0.109 |
| 4.243 | 0.109 |
| 4.244 | 0.11 |
| 4.245 | 0.11 |
| 4.246 | 0.111 |
| 4.247 | 0.111 |
| 4.248 | 0.112 |
| 4.249 | 0.112 |
| 4.25 | 0.113 |
| 4.251 | 0.113 |
| 4.252 | 0.114 |
| 4.253 | 0.114 |
| 4.254 | 0.114 |
| 4.255 | 0.115 |
| 4.256 | 0.115 |
| 4.257 | 0.116 |
| 4.258 | 0.116 |
| 4.259 | 0.117 |
| 4.26 | 0.117 |
| 4.261 | 0.118 |
| 4.262 | 0.118 |
| 4.263 | 0.119 |
| 4.264 | 0.119 |
| 4.265 | 0.12 |
| 4.266 | 0.12 |
| 4.267 | 0.121 |
| 4.268 | 0.121 |
| 4.269 | 0.122 |
| 4.27 | 0.122 |
| 4.271 | 0.123 |
| 4.272 | 0.123 |
| 4.273 | 0.124 |
| 4.274 | 0.124 |
| 4.275 | 0.125 |
| 4.276 | 0.125 |
| 4.277 | 0.126 |
| 4.278 | 0.126 |
| 4.279 | 0.127 |
| 4.28 | 0.127 |
| 4.281 | 0.128 |
| 4.282 | 0.128 |
| 4.283 | 0.129 |
| 4.284 | 0.129 |
| 4.285 | 0.13 |
| 4.286 | 0.13 |
| 4.287 | 0.131 |
| 4.288 | 0.131 |
| 4.289 | 0.132 |
| 4.29 | 0.132 |
| 4.291 | 0.133 |
| 4.292 | 0.133 |
| 4.293 | 0.134 |
| 4.294 | 0.134 |
| 4.295 | 0.135 |
| 4.296 | 0.135 |
| 4.297 | 0.136 |
| 4.298 | 0.136 |
| 4.299 | 0.137 |
| 4.3 | 0.137 |
| 4.301 | 0.138 |
| 4.302 | 0.138 |
| 4.303 | 0.139 |
| 4.304 | 0.14 |
| 4.305 | 0.14 |
| 4.306 | 0.141 |
| 4.307 | 0.141 |
| 4.308 | 0.142 |
| 4.309 | 0.142 |
| 4.31 | 0.143 |
| 4.311 | 0.143 |
| 4.312 | 0.144 |
| 4.313 | 0.144 |
| 4.314 | 0.145 |
| 4.315 | 0.145 |
| 4.316 | 0.146 |
| 4.317 | 0.146 |
| 4.318 | 0.147 |
| 4.319 | 0.147 |
| 4.32 | 0.148 |
| 4.321 | 0.148 |
| 4.322 | 0.149 |
| 4.323 | 0.149 |
| 4.324 | 0.15 |
| 4.325 | 0.15 |
| 4.326 | 0.151 |
| 4.327 | 0.151 |
| 4.328 | 0.152 |
| 4.329 | 0.152 |
| 4.33 | 0.153 |
| 4.331 | 0.153 |
| 4.332 | 0.154 |
| 4.333 | 0.154 |
| 4.334 | 0.155 |
| 4.335 | 0.155 |
| 4.336 | 0.156 |
| 4.337 | 0.156 |
| 4.338 | 0.157 |
| 4.339 | 0.157 |
| 4.34 | 0.158 |
| 4.341 | 0.158 |
| 4.342 | 0.159 |
| 4.343 | 0.159 |
| 4.344 | 0.16 |
| 4.345 | 0.16 |
| 4.346 | 0.161 |
| 4.347 | 0.161 |
| 4.348 | 0.162 |
| 4.349 | 0.162 |
| 4.35 | 0.163 |
| 4.351 | 0.163 |
| 4.352 | 0.164 |
| 4.353 | 0.164 |
| 4.354 | 0.165 |
| 4.355 | 0.165 |
| 4.356 | 0.166 |
| 4.357 | 0.166 |
| 4.358 | 0.167 |
| 4.359 | 0.167 |
| 4.36 | 0.168 |
| 4.361 | 0.168 |
| 4.362 | 0.169 |
| 4.363 | 0.169 |
| 4.364 | 0.17 |
| 4.365 | 0.171 |
| 4.366 | 0.171 |
| 4.367 | 0.172 |
| 4.368 | 0.172 |
| 4.369 | 0.173 |
| 4.37 | 0.173 |
| 4.371 | 0.174 |
| 4.372 | 0.174 |
| 4.373 | 0.175 |
| 4.374 | 0.175 |
| 4.375 | 0.176 |
| 4.376 | 0.176 |
| 4.377 | 0.177 |
| 4.378 | 0.177 |
| 4.379 | 0.178 |
| 4.38 | 0.178 |
| 4.381 | 0.179 |
| 4.382 | 0.179 |
| 4.383 | 0.18 |
| 4.384 | 0.18 |
| 4.385 | 0.181 |
| 4.386 | 0.181 |
| 4.387 | 0.182 |
| 4.388 | 0.182 |
| 4.389 | 0.183 |
| 4.39 | 0.183 |
| 4.391 | 0.184 |
| 4.392 | 0.184 |
| 4.393 | 0.185 |
| 4.394 | 0.185 |
| 4.395 | 0.186 |
| 4.396 | 0.186 |
| 4.397 | 0.187 |
| 4.398 | 0.188 |
| 4.399 | 0.188 |
| 4.4 | 0.189 |
| 4.401 | 0.189 |
| 4.402 | 0.19 |
| 4.403 | 0.19 |
| 4.404 | 0.191 |
| 4.405 | 0.191 |
| 4.406 | 0.192 |
| 4.407 | 0.192 |
| 4.408 | 0.193 |
| 4.409 | 0.193 |
| 4.41 | 0.194 |
| 4.411 | 0.194 |
| 4.412 | 0.195 |
| 4.413 | 0.195 |
| 4.414 | 0.196 |
| 4.415 | 0.196 |
| 4.416 | 0.197 |
| 4.417 | 0.197 |
| 4.418 | 0.198 |
| 4.419 | 0.198 |
| 4.42 | 0.199 |
| 4.421 | 0.199 |
| 4.422 | 0.2 |
| 4.423 | 0.201 |
| 4.424 | 0.201 |
| 4.425 | 0.202 |
| 4.426 | 0.202 |
| 4.427 | 0.203 |
| 4.428 | 0.203 |
| 4.429 | 0.204 |
| 4.43 | 0.204 |
| 4.431 | 0.205 |
| 4.432 | 0.205 |
| 4.433 | 0.206 |
| 4.434 | 0.206 |
| 4.435 | 0.207 |
| 4.436 | 0.207 |
| 4.437 | 0.208 |
| 4.438 | 0.208 |
| 4.439 | 0.209 |
| 4.44 | 0.209 |
| 4.441 | 0.21 |
| 4.442 | 0.21 |
| 4.443 | 0.211 |
| 4.444 | 0.212 |
| 4.445 | 0.212 |
| 4.446 | 0.213 |
| 4.447 | 0.213 |
| 4.448 | 0.214 |
| 4.449 | 0.214 |
| 4.45 | 0.215 |
| 4.451 | 0.215 |
| 4.452 | 0.216 |
| 4.453 | 0.216 |
| 4.454 | 0.217 |
| 4.455 | 0.217 |
| 4.456 | 0.218 |
| 4.457 | 0.218 |
| 4.458 | 0.219 |
| 4.459 | 0.219 |
| 4.46 | 0.22 |
| 4.461 | 0.22 |
| 4.462 | 0.221 |
| 4.463 | 0.222 |
| 4.464 | 0.222 |
| 4.465 | 0.223 |
| 4.466 | 0.223 |
| 4.467 | 0.224 |
| 4.468 | 0.224 |
| 4.469 | 0.225 |
| 4.47 | 0.225 |
| 4.471 | 0.226 |
| 4.472 | 0.226 |
| 4.473 | 0.227 |
| 4.474 | 0.227 |
| 4.475 | 0.228 |
| 4.476 | 0.228 |
| 4.477 | 0.229 |
| 4.478 | 0.229 |
| 4.479 | 0.23 |
| 4.48 | 0.231 |
| 4.481 | 0.231 |
| 4.482 | 0.232 |
| 4.483 | 0.232 |
| 4.484 | 0.233 |
| 4.485 | 0.233 |
| 4.486 | 0.234 |
| 4.487 | 0.234 |
| 4.488 | 0.235 |
| 4.489 | 0.235 |
| 4.49 | 0.236 |
| 4.491 | 0.236 |
| 4.492 | 0.237 |
| 4.493 | 0.237 |
| 4.494 | 0.238 |
| 4.495 | 0.239 |
| 4.496 | 0.239 |
| 4.497 | 0.24 |
| 4.498 | 0.24 |
| 4.499 | 0.241 |
| 4.5 | 0.241 |
| 4.501 | 0.242 |
| 4.502 | 0.242 |
| 4.503 | 0.243 |
| 4.504 | 0.243 |
| 4.505 | 0.244 |
| 4.506 | 0.244 |
| 4.507 | 0.245 |
| 4.508 | 0.245 |
| 4.509 | 0.246 |
| 4.51 | 0.247 |
| 4.511 | 0.247 |
| 4.512 | 0.248 |
| 4.513 | 0.248 |
| 4.514 | 0.249 |
| 4.515 | 0.249 |
| 4.516 | 0.25 |
| 4.517 | 0.25 |
| 4.518 | 0.251 |
| 4.519 | 0.251 |
| 4.52 | 0.252 |
| 4.521 | 0.252 |
| 4.522 | 0.253 |
| 4.523 | 0.254 |
| 4.524 | 0.254 |
| 4.525 | 0.255 |
| 4.526 | 0.255 |
| 4.527 | 0.256 |
| 4.528 | 0.256 |
| 4.529 | 0.257 |
| 4.53 | 0.257 |
| 4.531 | 0.258 |
| 4.532 | 0.258 |
| 4.533 | 0.259 |
| 4.534 | 0.259 |
| 4.535 | 0.26 |
| 4.536 | 0.261 |
| 4.537 | 0.261 |
| 4.538 | 0.262 |
| 4.539 | 0.262 |
| 4.54 | 0.263 |
| 4.541 | 0.263 |
| 4.542 | 0.264 |
| 4.543 | 0.264 |
| 4.544 | 0.265 |
| 4.545 | 0.265 |
| 4.546 | 0.266 |
| 4.547 | 0.266 |
| 4.548 | 0.267 |
| 4.549 | 0.268 |
| 4.55 | 0.268 |
| 4.551 | 0.269 |
| 4.552 | 0.269 |
| 4.553 | 0.27 |
| 4.554 | 0.27 |
| 4.555 | 0.271 |
| 4.556 | 0.271 |
| 4.557 | 0.272 |
| 4.558 | 0.272 |
| 4.559 | 0.273 |
| 4.56 | 0.274 |
| 4.561 | 0.274 |
| 4.562 | 0.275 |
| 4.563 | 0.275 |
| 4.564 | 0.276 |
| 4.565 | 0.276 |
| 4.566 | 0.277 |
| 4.567 | 0.277 |
| 4.568 | 0.278 |
| 4.569 | 0.278 |
| 4.57 | 0.279 |
| 4.571 | 0.279 |
| 4.572 | 0.28 |
| 4.573 | 0.281 |
| 4.574 | 0.281 |
| 4.575 | 0.282 |
| 4.576 | 0.282 |
| 4.577 | 0.283 |
| 4.578 | 0.283 |
| 4.579 | 0.284 |
| 4.58 | 0.284 |
| 4.581 | 0.285 |
| 4.582 | 0.286 |
| 4.583 | 0.286 |
| 4.584 | 0.287 |
| 4.585 | 0.287 |
| 4.586 | 0.288 |
| 4.587 | 0.288 |
| 4.588 | 0.289 |
| 4.589 | 0.289 |
| 4.59 | 0.29 |
| 4.591 | 0.29 |
| 4.592 | 0.291 |
| 4.593 | 0.292 |
| 4.594 | 0.292 |
| 4.595 | 0.293 |
| 4.596 | 0.293 |
| 4.597 | 0.294 |
| 4.598 | 0.294 |
| 4.599 | 0.295 |
| 4.6 | 0.295 |
| 4.601 | 0.296 |
| 4.602 | 0.296 |
| 4.603 | 0.297 |
| 4.604 | 0.298 |
| 4.605 | 0.298 |
| 4.606 | 0.299 |
| 4.607 | 0.299 |
| 4.608 | 0.3 |
| 4.609 | 0.3 |
| 4.61 | 0.301 |
| 4.611 | 0.301 |
| 4.612 | 0.302 |
| 4.613 | 0.303 |
| 4.614 | 0.303 |
| 4.615 | 0.304 |
| 4.616 | 0.304 |
| 4.617 | 0.305 |
| 4.618 | 0.305 |
| 4.619 | 0.306 |
| 4.62 | 0.306 |
| 4.621 | 0.307 |
| 4.622 | 0.308 |
| 4.623 | 0.308 |
| 4.624 | 0.309 |
| 4.625 | 0.309 |
| 4.626 | 0.31 |
| 4.627 | 0.31 |
| 4.628 | 0.311 |
| 4.629 | 0.311 |
| 4.63 | 0.312 |
| 4.631 | 0.312 |
| 4.632 | 0.313 |
| 4.633 | 0.314 |
| 4.634 | 0.314 |
| 4.635 | 0.315 |
| 4.636 | 0.315 |
| 4.637 | 0.316 |
| 4.638 | 0.316 |
| 4.639 | 0.317 |
| 4.64 | 0.317 |
| 4.641 | 0.318 |
| 4.642 | 0.319 |
| 4.643 | 0.319 |
| 4.644 | 0.32 |
| 4.645 | 0.32 |
| 4.646 | 0.321 |
| 4.647 | 0.321 |
| 4.648 | 0.322 |
| 4.649 | 0.322 |
| 4.65 | 0.323 |
| 4.651 | 0.324 |
| 4.652 | 0.324 |
| 4.653 | 0.325 |
| 4.654 | 0.325 |
| 4.655 | 0.326 |
| 4.656 | 0.326 |
| 4.657 | 0.327 |
| 4.658 | 0.328 |
| 4.659 | 0.328 |
| 4.66 | 0.329 |
| 4.661 | 0.329 |
| 4.662 | 0.33 |
| 4.663 | 0.33 |
| 4.664 | 0.331 |
| 4.665 | 0.331 |
| 4.666 | 0.332 |
| 4.667 | 0.333 |
| 4.668 | 0.333 |
| 4.669 | 0.334 |
| 4.67 | 0.334 |
| 4.671 | 0.335 |
| 4.672 | 0.335 |
| 4.673 | 0.336 |
| 4.674 | 0.336 |
| 4.675 | 0.337 |
| 4.676 | 0.338 |
| 4.677 | 0.338 |
| 4.678 | 0.339 |
| 4.679 | 0.339 |
| 4.68 | 0.34 |
| 4.681 | 0.34 |
| 4.682 | 0.341 |
| 4.683 | 0.342 |
| 4.684 | 0.342 |
| 4.685 | 0.343 |
| 4.686 | 0.343 |
| 4.687 | 0.344 |
| 4.688 | 0.344 |
| 4.689 | 0.345 |
| 4.69 | 0.346 |
| 4.691 | 0.346 |
| 4.692 | 0.347 |
| 4.693 | 0.347 |
| 4.694 | 0.348 |
| 4.695 | 0.348 |
| 4.696 | 0.349 |
| 4.697 | 0.349 |
| 4.698 | 0.35 |
| 4.699 | 0.351 |
| 4.7 | 0.351 |
| 4.701 | 0.352 |
| 4.702 | 0.352 |
| 4.703 | 0.353 |
| 4.704 | 0.353 |
| 4.705 | 0.354 |
| 4.706 | 0.355 |
| 4.707 | 0.355 |
| 4.708 | 0.356 |
| 4.709 | 0.356 |
| 4.71 | 0.357 |
| 4.711 | 0.357 |
| 4.712 | 0.358 |
| 4.713 | 0.359 |
| 4.714 | 0.359 |
| 4.715 | 0.36 |
| 4.716 | 0.36 |
| 4.717 | 0.361 |
| 4.718 | 0.361 |
| 4.719 | 0.362 |
| 4.72 | 0.363 |
| 4.721 | 0.363 |
| 4.722 | 0.364 |
| 4.723 | 0.364 |
| 4.724 | 0.365 |
| 4.725 | 0.365 |
| 4.726 | 0.366 |
| 4.727 | 0.366 |
| 4.728 | 0.367 |
| 4.729 | 0.368 |
| 4.73 | 0.368 |
| 4.731 | 0.369 |
| 4.732 | 0.369 |
| 4.733 | 0.37 |
| 4.734 | 0.37 |
| 4.735 | 0.371 |
| 4.736 | 0.372 |
| 4.737 | 0.372 |
| 4.738 | 0.373 |
| 4.739 | 0.373 |
| 4.74 | 0.374 |
| 4.741 | 0.374 |
| 4.742 | 0.375 |
| 4.743 | 0.376 |
| 4.744 | 0.376 |
| 4.745 | 0.377 |
| 4.746 | 0.377 |
| 4.747 | 0.378 |
| 4.748 | 0.379 |
| 4.749 | 0.379 |
| 4.75 | 0.38 |
| 4.751 | 0.38 |
| 4.752 | 0.381 |
| 4.753 | 0.381 |
| 4.754 | 0.382 |
| 4.755 | 0.383 |
| 4.756 | 0.383 |
| 4.757 | 0.384 |
| 4.758 | 0.384 |
| 4.759 | 0.385 |
| 4.76 | 0.385 |
| 4.761 | 0.386 |
| 4.762 | 0.387 |
| 4.763 | 0.387 |
| 4.764 | 0.388 |
| 4.765 | 0.388 |
| 4.766 | 0.389 |
| 4.767 | 0.389 |
| 4.768 | 0.39 |
| 4.769 | 0.391 |
| 4.77 | 0.391 |
| 4.771 | 0.392 |
| 4.772 | 0.392 |
| 4.773 | 0.393 |
| 4.774 | 0.393 |
| 4.775 | 0.394 |
| 4.776 | 0.395 |
| 4.777 | 0.395 |
| 4.778 | 0.396 |
| 4.779 | 0.396 |
| 4.78 | 0.397 |
| 4.781 | 0.398 |
| 4.782 | 0.398 |
| 4.783 | 0.399 |
| 4.784 | 0.399 |
| 4.785 | 0.4 |
| 4.786 | 0.4 |
| 4.787 | 0.401 |
| 4.788 | 0.402 |
| 4.789 | 0.402 |
| 4.79 | 0.403 |
| 4.791 | 0.403 |
| 4.792 | 0.404 |
| 4.793 | 0.404 |
| 4.794 | 0.405 |
| 4.795 | 0.406 |
| 4.796 | 0.406 |
| 4.797 | 0.407 |
| 4.798 | 0.407 |
| 4.799 | 0.408 |
| 4.8 | 0.409 |
| 4.801 | 0.409 |
| 4.802 | 0.41 |
| 4.803 | 0.41 |
| 4.804 | 0.411 |
| 4.805 | 0.411 |
| 4.806 | 0.412 |
| 4.807 | 0.413 |
| 4.808 | 0.413 |
| 4.809 | 0.414 |
| 4.81 | 0.414 |
| 4.811 | 0.415 |
| 4.812 | 0.416 |
| 4.813 | 0.416 |
| 4.814 | 0.417 |
| 4.815 | 0.417 |
| 4.816 | 0.418 |
| 4.817 | 0.418 |
| 4.818 | 0.419 |
| 4.819 | 0.42 |
| 4.82 | 0.42 |
| 4.821 | 0.421 |
| 4.822 | 0.421 |
| 4.823 | 0.422 |
| 4.824 | 0.423 |
| 4.825 | 0.423 |
| 4.826 | 0.424 |
| 4.827 | 0.424 |
| 4.828 | 0.425 |
| 4.829 | 0.426 |
| 4.83 | 0.426 |
| 4.831 | 0.427 |
| 4.832 | 0.427 |
| 4.833 | 0.428 |
| 4.834 | 0.428 |
| 4.835 | 0.429 |
| 4.836 | 0.43 |
| 4.837 | 0.43 |
| 4.838 | 0.431 |
| 4.839 | 0.431 |
| 4.84 | 0.432 |
| 4.841 | 0.433 |
| 4.842 | 0.433 |
| 4.843 | 0.434 |
| 4.844 | 0.434 |
| 4.845 | 0.435 |
| 4.846 | 0.436 |
| 4.847 | 0.436 |
| 4.848 | 0.437 |
| 4.849 | 0.437 |
| 4.85 | 0.438 |
| 4.851 | 0.438 |
| 4.852 | 0.439 |
| 4.853 | 0.44 |
| 4.854 | 0.44 |
| 4.855 | 0.441 |
| 4.856 | 0.441 |
| 4.857 | 0.442 |
| 4.858 | 0.443 |
| 4.859 | 0.443 |
| 4.86 | 0.444 |
| 4.861 | 0.444 |
| 4.862 | 0.445 |
| 4.863 | 0.446 |
| 4.864 | 0.446 |
| 4.865 | 0.447 |
| 4.866 | 0.447 |
| 4.867 | 0.448 |
| 4.868 | 0.449 |
| 4.869 | 0.449 |
| 4.87 | 0.45 |
| 4.871 | 0.45 |
| 4.872 | 0.451 |
| 4.873 | 0.452 |
| 4.874 | 0.452 |
| 4.875 | 0.453 |
| 4.876 | 0.453 |
| 4.877 | 0.454 |
| 4.878 | 0.455 |
| 4.879 | 0.455 |
| 4.88 | 0.456 |
| 4.881 | 0.456 |
| 4.882 | 0.457 |
| 4.883 | 0.458 |
| 4.884 | 0.458 |
| 4.885 | 0.459 |
| 4.886 | 0.459 |
| 4.887 | 0.46 |
| 4.888 | 0.46 |
| 4.889 | 0.461 |
| 4.89 | 0.462 |
| 4.891 | 0.462 |
| 4.892 | 0.463 |
| 4.893 | 0.463 |
| 4.894 | 0.464 |
| 4.895 | 0.465 |
| 4.896 | 0.465 |
| 4.897 | 0.466 |
| 4.898 | 0.466 |
| 4.899 | 0.467 |
| 4.9 | 0.468 |
| 4.901 | 0.468 |
| 4.902 | 0.469 |
| 4.903 | 0.469 |
| 4.904 | 0.47 |
| 4.905 | 0.471 |
| 4.906 | 0.471 |
| 4.907 | 0.472 |
| 4.908 | 0.472 |
| 4.909 | 0.473 |
| 4.91 | 0.474 |
| 4.911 | 0.474 |
| 4.912 | 0.475 |
| 4.913 | 0.475 |
| 4.914 | 0.476 |
| 4.915 | 0.477 |
| 4.916 | 0.477 |
| 4.917 | 0.478 |
| 4.918 | 0.478 |
| 4.919 | 0.479 |
| 4.92 | 0.48 |
| 4.921 | 0.48 |
| 4.922 | 0.481 |
| 4.923 | 0.482 |
| 4.924 | 0.482 |
| 4.925 | 0.483 |
| 4.926 | 0.483 |
| 4.927 | 0.484 |
| 4.928 | 0.485 |
| 4.929 | 0.485 |
| 4.93 | 0.486 |
| 4.931 | 0.486 |
| 4.932 | 0.487 |
| 4.933 | 0.488 |
| 4.934 | 0.488 |
| 4.935 | 0.489 |
| 4.936 | 0.489 |
| 4.937 | 0.49 |
| 4.938 | 0.491 |
| 4.939 | 0.491 |
| 4.94 | 0.492 |
| 4.941 | 0.492 |
| 4.942 | 0.493 |
| 4.943 | 0.494 |
| 4.944 | 0.494 |
| 4.945 | 0.495 |
| 4.946 | 0.495 |
| 4.947 | 0.496 |
| 4.948 | 0.497 |
| 4.949 | 0.497 |
| 4.95 | 0.498 |
| 4.951 | 0.498 |
| 4.952 | 0.499 |
| 4.953 | 0.5 |
| 4.954 | 0.5 |
| 4.955 | 0.501 |
| 4.956 | 0.501 |
| 4.957 | 0.502 |
| 4.958 | 0.503 |
| 4.959 | 0.503 |
| 4.96 | 0.504 |
| 4.961 | 0.505 |
| 4.962 | 0.505 |
| 4.963 | 0.506 |
| 4.964 | 0.506 |
| 4.965 | 0.507 |
| 4.966 | 0.508 |
| 4.967 | 0.508 |
| 4.968 | 0.509 |
| 4.969 | 0.509 |
| 4.97 | 0.51 |
| 4.971 | 0.511 |
| 4.972 | 0.511 |
| 4.973 | 0.512 |
| 4.974 | 0.512 |
| 4.975 | 0.513 |
| 4.976 | 0.514 |
| 4.977 | 0.514 |
| 4.978 | 0.515 |
| 4.979 | 0.516 |
| 4.98 | 0.516 |
| 4.981 | 0.517 |
| 4.982 | 0.517 |
| 4.983 | 0.518 |
| 4.984 | 0.519 |
| 4.985 | 0.519 |
| 4.986 | 0.52 |
| 4.987 | 0.52 |
| 4.988 | 0.521 |
| 4.989 | 0.522 |
| 4.99 | 0.522 |
| 4.991 | 0.523 |
| 4.992 | 0.524 |
| 4.993 | 0.524 |
| 4.994 | 0.525 |
| 4.995 | 0.525 |
| 4.996 | 0.526 |
| 4.997 | 0.527 |
| 4.998 | 0.527 |
| 4.999 | 0.528 |
| 5.0 | 0.528 |
| 5.001 | 0.529 |
| 5.002 | 0.53 |
| 5.003 | 0.53 |
| 5.004 | 0.531 |
| 5.005 | 0.532 |
| 5.006 | 0.532 |
| 5.007 | 0.533 |
| 5.008 | 0.533 |
| 5.009 | 0.534 |
| 5.01 | 0.535 |
| 5.011 | 0.535 |
| 5.012 | 0.536 |
| 5.013 | 0.536 |
| 5.014 | 0.537 |
| 5.015 | 0.538 |
| 5.016 | 0.538 |
| 5.017 | 0.539 |
| 5.018 | 0.54 |
| 5.019 | 0.54 |
| 5.02 | 0.541 |
| 5.021 | 0.541 |
| 5.022 | 0.542 |
| 5.023 | 0.543 |
| 5.024 | 0.543 |
| 5.025 | 0.544 |
| 5.026 | 0.545 |
| 5.027 | 0.545 |
| 5.028 | 0.546 |
| 5.029 | 0.546 |
| 5.03 | 0.547 |
| 5.031 | 0.548 |
| 5.032 | 0.548 |
| 5.033 | 0.549 |
| 5.034 | 0.55 |
| 5.035 | 0.55 |
| 5.036 | 0.551 |
| 5.037 | 0.551 |
| 5.038 | 0.552 |
| 5.039 | 0.553 |
| 5.04 | 0.553 |
| 5.041 | 0.554 |
| 5.042 | 0.555 |
| 5.043 | 0.555 |
| 5.044 | 0.556 |
| 5.045 | 0.556 |
| 5.046 | 0.557 |
| 5.047 | 0.558 |
| 5.048 | 0.558 |
| 5.049 | 0.559 |
| 5.05 | 0.56 |
| 5.051 | 0.56 |
| 5.052 | 0.561 |
| 5.053 | 0.561 |
| 5.054 | 0.562 |
| 5.055 | 0.563 |
| 5.056 | 0.563 |
| 5.057 | 0.564 |
| 5.058 | 0.565 |
| 5.059 | 0.565 |
| 5.06 | 0.566 |
| 5.061 | 0.566 |
| 5.062 | 0.567 |
| 5.063 | 0.568 |
| 5.064 | 0.568 |
| 5.065 | 0.569 |
| 5.066 | 0.57 |
| 5.067 | 0.57 |
| 5.068 | 0.571 |
| 5.069 | 0.571 |
| 5.07 | 0.572 |
| 5.071 | 0.573 |
| 5.072 | 0.573 |
| 5.073 | 0.574 |
| 5.074 | 0.575 |
| 5.075 | 0.575 |
| 5.076 | 0.576 |
| 5.077 | 0.576 |
| 5.078 | 0.577 |
| 5.079 | 0.578 |
| 5.08 | 0.578 |
| 5.081 | 0.579 |
| 5.082 | 0.58 |
| 5.083 | 0.58 |
| 5.084 | 0.581 |
| 5.085 | 0.582 |
| 5.086 | 0.582 |
| 5.087 | 0.583 |
| 5.088 | 0.583 |
| 5.089 | 0.584 |
| 5.09 | 0.585 |
| 5.091 | 0.585 |
| 5.092 | 0.586 |
| 5.093 | 0.587 |
| 5.094 | 0.587 |
| 5.095 | 0.588 |
| 5.096 | 0.588 |
| 5.097 | 0.589 |
| 5.098 | 0.59 |
| 5.099 | 0.59 |
| 5.1 | 0.591 |
| 5.101 | 0.592 |
| 5.102 | 0.592 |
| 5.103 | 0.593 |
| 5.104 | 0.594 |
| 5.105 | 0.594 |
| 5.106 | 0.595 |
| 5.107 | 0.595 |
| 5.108 | 0.596 |
| 5.109 | 0.597 |
| 5.11 | 0.597 |
| 5.111 | 0.598 |
| 5.112 | 0.599 |
| 5.113 | 0.599 |
| 5.114 | 0.6 |
| 5.115 | 0.601 |
| 5.116 | 0.601 |
| 5.117 | 0.602 |
| 5.118 | 0.602 |
| 5.119 | 0.603 |
| 5.12 | 0.604 |
| 5.121 | 0.604 |
| 5.122 | 0.605 |
| 5.123 | 0.606 |
| 5.124 | 0.606 |
| 5.125 | 0.607 |
| 5.126 | 0.608 |
| 5.127 | 0.608 |
| 5.128 | 0.609 |
| 5.129 | 0.609 |
| 5.13 | 0.61 |
| 5.131 | 0.611 |
| 5.132 | 0.611 |
| 5.133 | 0.612 |
| 5.134 | 0.613 |
| 5.135 | 0.613 |
| 5.136 | 0.614 |
| 5.137 | 0.615 |
| 5.138 | 0.615 |
| 5.139 | 0.616 |
| 5.14 | 0.617 |
| 5.141 | 0.617 |
| 5.142 | 0.618 |
| 5.143 | 0.618 |
| 5.144 | 0.619 |
| 5.145 | 0.62 |
| 5.146 | 0.62 |
| 5.147 | 0.621 |
| 5.148 | 0.622 |
| 5.149 | 0.622 |
| 5.15 | 0.623 |
| 5.151 | 0.624 |
| 5.152 | 0.624 |
| 5.153 | 0.625 |
| 5.154 | 0.626 |
| 5.155 | 0.626 |
| 5.156 | 0.627 |
| 5.157 | 0.627 |
| 5.158 | 0.628 |
| 5.159 | 0.629 |
| 5.16 | 0.629 |
| 5.161 | 0.63 |
| 5.162 | 0.631 |
| 5.163 | 0.631 |
| 5.164 | 0.632 |
| 5.165 | 0.633 |
| 5.166 | 0.633 |
| 5.167 | 0.634 |
| 5.168 | 0.635 |
| 5.169 | 0.635 |
| 5.17 | 0.636 |
| 5.171 | 0.637 |
| 5.172 | 0.637 |
| 5.173 | 0.638 |
| 5.174 | 0.638 |
| 5.175 | 0.639 |
| 5.176 | 0.64 |
| 5.177 | 0.64 |
| 5.178 | 0.641 |
| 5.179 | 0.642 |
| 5.18 | 0.642 |
| 5.181 | 0.643 |
| 5.182 | 0.644 |
| 5.183 | 0.644 |
| 5.184 | 0.645 |
| 5.185 | 0.646 |
| 5.186 | 0.646 |
| 5.187 | 0.647 |
| 5.188 | 0.648 |
| 5.189 | 0.648 |
| 5.19 | 0.649 |
| 5.191 | 0.649 |
| 5.192 | 0.65 |
| 5.193 | 0.651 |
| 5.194 | 0.651 |
| 5.195 | 0.652 |
| 5.196 | 0.653 |
| 5.197 | 0.653 |
| 5.198 | 0.654 |
| 5.199 | 0.655 |
| 5.2 | 0.655 |
| 5.201 | 0.656 |
| 5.202 | 0.657 |
| 5.203 | 0.657 |
| 5.204 | 0.658 |
| 5.205 | 0.659 |
| 5.206 | 0.659 |
| 5.207 | 0.66 |
| 5.208 | 0.661 |
| 5.209 | 0.661 |
| 5.21 | 0.662 |
| 5.211 | 0.663 |
| 5.212 | 0.663 |
| 5.213 | 0.664 |
| 5.214 | 0.664 |
| 5.215 | 0.665 |
| 5.216 | 0.666 |
| 5.217 | 0.666 |
| 5.218 | 0.667 |
| 5.219 | 0.668 |
| 5.22 | 0.668 |
| 5.221 | 0.669 |
| 5.222 | 0.67 |
| 5.223 | 0.67 |
| 5.224 | 0.671 |
| 5.225 | 0.672 |
| 5.226 | 0.672 |
| 5.227 | 0.673 |
| 5.228 | 0.674 |
| 5.229 | 0.674 |
| 5.23 | 0.675 |
| 5.231 | 0.676 |
| 5.232 | 0.676 |
| 5.233 | 0.677 |
| 5.234 | 0.678 |
| 5.235 | 0.678 |
| 5.236 | 0.679 |
| 5.237 | 0.68 |
| 5.238 | 0.68 |
| 5.239 | 0.681 |
| 5.24 | 0.682 |
| 5.241 | 0.682 |
| 5.242 | 0.683 |
| 5.243 | 0.684 |
| 5.244 | 0.684 |
| 5.245 | 0.685 |
| 5.246 | 0.686 |
| 5.247 | 0.686 |
| 5.248 | 0.687 |
| 5.249 | 0.688 |
| 5.25 | 0.688 |
| 5.251 | 0.689 |
| 5.252 | 0.69 |
| 5.253 | 0.69 |
| 5.254 | 0.691 |
| 5.255 | 0.692 |
| 5.256 | 0.692 |
| 5.257 | 0.693 |
| 5.258 | 0.694 |
| 5.259 | 0.694 |
| 5.26 | 0.695 |
| 5.261 | 0.695 |
| 5.262 | 0.696 |
| 5.263 | 0.697 |
| 5.264 | 0.697 |
| 5.265 | 0.698 |
| 5.266 | 0.699 |
| 5.267 | 0.699 |
| 5.268 | 0.7 |
| 5.269 | 0.701 |
| 5.27 | 0.701 |
| 5.271 | 0.702 |
| 5.272 | 0.703 |
| 5.273 | 0.703 |
| 5.274 | 0.704 |
| 5.275 | 0.705 |
| 5.276 | 0.705 |
| 5.277 | 0.706 |
| 5.278 | 0.707 |
| 5.279 | 0.707 |
| 5.28 | 0.708 |
| 5.281 | 0.709 |
| 5.282 | 0.709 |
| 5.283 | 0.71 |
| 5.284 | 0.711 |
| 5.285 | 0.711 |
| 5.286 | 0.712 |
| 5.287 | 0.713 |
| 5.288 | 0.713 |
| 5.289 | 0.714 |
| 5.29 | 0.715 |
| 5.291 | 0.715 |
| 5.292 | 0.716 |
| 5.293 | 0.717 |
| 5.294 | 0.717 |
| 5.295 | 0.718 |
| 5.296 | 0.719 |
| 5.297 | 0.72 |
| 5.298 | 0.72 |
| 5.299 | 0.721 |
| 5.3 | 0.722 |
| 5.301 | 0.722 |
| 5.302 | 0.723 |
| 5.303 | 0.724 |
| 5.304 | 0.724 |
| 5.305 | 0.725 |
| 5.306 | 0.726 |
| 5.307 | 0.726 |
| 5.308 | 0.727 |
| 5.309 | 0.728 |
| 5.31 | 0.728 |
| 5.311 | 0.729 |
| 5.312 | 0.73 |
| 5.313 | 0.73 |
| 5.314 | 0.731 |
| 5.315 | 0.732 |
| 5.316 | 0.732 |
| 5.317 | 0.733 |
| 5.318 | 0.734 |
| 5.319 | 0.734 |
| 5.32 | 0.735 |
| 5.321 | 0.736 |
| 5.322 | 0.736 |
| 5.323 | 0.737 |
| 5.324 | 0.738 |
| 5.325 | 0.738 |
| 5.326 | 0.739 |
| 5.327 | 0.74 |
| 5.328 | 0.74 |
| 5.329 | 0.741 |
| 5.33 | 0.742 |
| 5.331 | 0.742 |
| 5.332 | 0.743 |
| 5.333 | 0.744 |
| 5.334 | 0.744 |
| 5.335 | 0.745 |
| 5.336 | 0.746 |
| 5.337 | 0.746 |
| 5.338 | 0.747 |
| 5.339 | 0.748 |
| 5.34 | 0.748 |
| 5.341 | 0.749 |
| 5.342 | 0.75 |
| 5.343 | 0.751 |
| 5.344 | 0.751 |
| 5.345 | 0.752 |
| 5.346 | 0.753 |
| 5.347 | 0.753 |
| 5.348 | 0.754 |
| 5.349 | 0.755 |
| 5.35 | 0.755 |
| 5.351 | 0.756 |
| 5.352 | 0.757 |
| 5.353 | 0.757 |
| 5.354 | 0.758 |
| 5.355 | 0.759 |
| 5.356 | 0.759 |
| 5.357 | 0.76 |
| 5.358 | 0.761 |
| 5.359 | 0.761 |
| 5.36 | 0.762 |
| 5.361 | 0.763 |
| 5.362 | 0.763 |
| 5.363 | 0.764 |
| 5.364 | 0.765 |
| 5.365 | 0.766 |
| 5.366 | 0.766 |
| 5.367 | 0.767 |
| 5.368 | 0.768 |
| 5.369 | 0.768 |
| 5.37 | 0.769 |
| 5.371 | 0.77 |
| 5.372 | 0.77 |
| 5.373 | 0.771 |
| 5.374 | 0.772 |
| 5.375 | 0.772 |
| 5.376 | 0.773 |
| 5.377 | 0.774 |
| 5.378 | 0.774 |
| 5.379 | 0.775 |
| 5.38 | 0.776 |
| 5.381 | 0.776 |
| 5.382 | 0.777 |
| 5.383 | 0.778 |
| 5.384 | 0.779 |
| 5.385 | 0.779 |
| 5.386 | 0.78 |
| 5.387 | 0.781 |
| 5.388 | 0.781 |
| 5.389 | 0.782 |
| 5.39 | 0.783 |
| 5.391 | 0.783 |
| 5.392 | 0.784 |
| 5.393 | 0.785 |
| 5.394 | 0.785 |
| 5.395 | 0.786 |
| 5.396 | 0.787 |
| 5.397 | 0.787 |
| 5.398 | 0.788 |
| 5.399 | 0.789 |
| 5.4 | 0.79 |
| 5.401 | 0.79 |
| 5.402 | 0.791 |
| 5.403 | 0.792 |
| 5.404 | 0.792 |
| 5.405 | 0.793 |
| 5.406 | 0.794 |
| 5.407 | 0.794 |
| 5.408 | 0.795 |
| 5.409 | 0.796 |
| 5.41 | 0.796 |
| 5.411 | 0.797 |
| 5.412 | 0.798 |
| 5.413 | 0.799 |
| 5.414 | 0.799 |
| 5.415 | 0.8 |
| 5.416 | 0.801 |
| 5.417 | 0.801 |
| 5.418 | 0.802 |
| 5.419 | 0.803 |
| 5.42 | 0.803 |
| 5.421 | 0.804 |
| 5.422 | 0.805 |
| 5.423 | 0.805 |
| 5.424 | 0.806 |
| 5.425 | 0.807 |
| 5.426 | 0.808 |
| 5.427 | 0.808 |
| 5.428 | 0.809 |
| 5.429 | 0.81 |
| 5.43 | 0.81 |
| 5.431 | 0.811 |
| 5.432 | 0.812 |
| 5.433 | 0.812 |
| 5.434 | 0.813 |
| 5.435 | 0.814 |
| 5.436 | 0.815 |
| 5.437 | 0.815 |
| 5.438 | 0.816 |
| 5.439 | 0.817 |
| 5.44 | 0.817 |
| 5.441 | 0.818 |
| 5.442 | 0.819 |
| 5.443 | 0.819 |
| 5.444 | 0.82 |
| 5.445 | 0.821 |
| 5.446 | 0.821 |
| 5.447 | 0.822 |
| 5.448 | 0.823 |
| 5.449 | 0.824 |
| 5.45 | 0.824 |
| 5.451 | 0.825 |
| 5.452 | 0.826 |
| 5.453 | 0.826 |
| 5.454 | 0.827 |
| 5.455 | 0.828 |
| 5.456 | 0.828 |
| 5.457 | 0.829 |
| 5.458 | 0.83 |
| 5.459 | 0.831 |
| 5.46 | 0.831 |
| 5.461 | 0.832 |
| 5.462 | 0.833 |
| 5.463 | 0.833 |
| 5.464 | 0.834 |
| 5.465 | 0.835 |
| 5.466 | 0.836 |
| 5.467 | 0.836 |
| 5.468 | 0.837 |
| 5.469 | 0.838 |
| 5.47 | 0.838 |
| 5.471 | 0.839 |
| 5.472 | 0.84 |
| 5.473 | 0.84 |
| 5.474 | 0.841 |
| 5.475 | 0.842 |
| 5.476 | 0.843 |
| 5.477 | 0.843 |
| 5.478 | 0.844 |
| 5.479 | 0.845 |
| 5.48 | 0.845 |
| 5.481 | 0.846 |
| 5.482 | 0.847 |
| 5.483 | 0.847 |
| 5.484 | 0.848 |
| 5.485 | 0.849 |
| 5.486 | 0.85 |
| 5.487 | 0.85 |
| 5.488 | 0.851 |
| 5.489 | 0.852 |
| 5.49 | 0.852 |
| 5.491 | 0.853 |
| 5.492 | 0.854 |
| 5.493 | 0.855 |
| 5.494 | 0.855 |
| 5.495 | 0.856 |
| 5.496 | 0.857 |
| 5.497 | 0.857 |
| 5.498 | 0.858 |
| 5.499 | 0.859 |
| 5.5 | 0.86 |
| 5.501 | 0.86 |
| 5.502 | 0.861 |
| 5.503 | 0.862 |
| 5.504 | 0.862 |
| 5.505 | 0.863 |
| 5.506 | 0.864 |
| 5.507 | 0.864 |
| 5.508 | 0.865 |
| 5.509 | 0.866 |
| 5.51 | 0.867 |
| 5.511 | 0.867 |
| 5.512 | 0.868 |
| 5.513 | 0.869 |
| 5.514 | 0.869 |
| 5.515 | 0.87 |
| 5.516 | 0.871 |
| 5.517 | 0.872 |
| 5.518 | 0.872 |
| 5.519 | 0.873 |
| 5.52 | 0.874 |
| 5.521 | 0.874 |
| 5.522 | 0.875 |
| 5.523 | 0.876 |
| 5.524 | 0.877 |
| 5.525 | 0.877 |
| 5.526 | 0.878 |
| 5.527 | 0.879 |
| 5.528 | 0.879 |
| 5.529 | 0.88 |
| 5.53 | 0.881 |
| 5.531 | 0.882 |
| 5.532 | 0.882 |
| 5.533 | 0.883 |
| 5.534 | 0.884 |
| 5.535 | 0.884 |
| 5.536 | 0.885 |
| 5.537 | 0.886 |
| 5.538 | 0.887 |
| 5.539 | 0.887 |
| 5.54 | 0.888 |
| 5.541 | 0.889 |
| 5.542 | 0.889 |
| 5.543 | 0.89 |
| 5.544 | 0.891 |
| 5.545 | 0.892 |
| 5.546 | 0.892 |
| 5.547 | 0.893 |
| 5.548 | 0.894 |
| 5.549 | 0.894 |
| 5.55 | 0.895 |
| 5.551 | 0.896 |
| 5.552 | 0.897 |
| 5.553 | 0.897 |
| 5.554 | 0.898 |
| 5.555 | 0.899 |
| 5.556 | 0.9 |
| 5.557 | 0.9 |
| 5.558 | 0.901 |
| 5.559 | 0.902 |
| 5.56 | 0.902 |
| 5.561 | 0.903 |
| 5.562 | 0.904 |
| 5.563 | 0.905 |
| 5.564 | 0.905 |
| 5.565 | 0.906 |
| 5.566 | 0.907 |
| 5.567 | 0.907 |
| 5.568 | 0.908 |
| 5.569 | 0.909 |
| 5.57 | 0.91 |
| 5.571 | 0.91 |
| 5.572 | 0.911 |
| 5.573 | 0.912 |
| 5.574 | 0.913 |
| 5.575 | 0.913 |
| 5.576 | 0.914 |
| 5.577 | 0.915 |
| 5.578 | 0.915 |
| 5.579 | 0.916 |
| 5.58 | 0.917 |
| 5.581 | 0.918 |
| 5.582 | 0.918 |
| 5.583 | 0.919 |
| 5.584 | 0.92 |
| 5.585 | 0.92 |
| 5.586 | 0.921 |
| 5.587 | 0.922 |
| 5.588 | 0.923 |
| 5.589 | 0.923 |
| 5.59 | 0.924 |
| 5.591 | 0.925 |
| 5.592 | 0.926 |
| 5.593 | 0.926 |
| 5.594 | 0.927 |
| 5.595 | 0.928 |
| 5.596 | 0.928 |
| 5.597 | 0.929 |
| 5.598 | 0.93 |
| 5.599 | 0.931 |
| 5.6 | 0.931 |
| 5.601 | 0.932 |
| 5.602 | 0.933 |
| 5.603 | 0.934 |
| 5.604 | 0.934 |
| 5.605 | 0.935 |
| 5.606 | 0.936 |
| 5.607 | 0.937 |
| 5.608 | 0.937 |
| 5.609 | 0.938 |
| 5.61 | 0.939 |
| 5.611 | 0.939 |
| 5.612 | 0.94 |
| 5.613 | 0.941 |
| 5.614 | 0.942 |
| 5.615 | 0.942 |
| 5.616 | 0.943 |
| 5.617 | 0.944 |
| 5.618 | 0.945 |
| 5.619 | 0.945 |
| 5.62 | 0.946 |
| 5.621 | 0.947 |
| 5.622 | 0.948 |
| 5.623 | 0.948 |
| 5.624 | 0.949 |
| 5.625 | 0.95 |
| 5.626 | 0.95 |
| 5.627 | 0.951 |
| 5.628 | 0.952 |
| 5.629 | 0.953 |
| 5.63 | 0.953 |
| 5.631 | 0.954 |
| 5.632 | 0.955 |
| 5.633 | 0.956 |
| 5.634 | 0.956 |
| 5.635 | 0.957 |
| 5.636 | 0.958 |
| 5.637 | 0.959 |
| 5.638 | 0.959 |
| 5.639 | 0.96 |
| 5.64 | 0.961 |
| 5.641 | 0.961 |
| 5.642 | 0.962 |
| 5.643 | 0.963 |
| 5.644 | 0.964 |
| 5.645 | 0.964 |
| 5.646 | 0.965 |
| 5.647 | 0.966 |
| 5.648 | 0.967 |
| 5.649 | 0.967 |
| 5.65 | 0.968 |
| 5.651 | 0.969 |
| 5.652 | 0.97 |
| 5.653 | 0.97 |
| 5.654 | 0.971 |
| 5.655 | 0.972 |
| 5.656 | 0.973 |
| 5.657 | 0.973 |
| 5.658 | 0.974 |
| 5.659 | 0.975 |
| 5.66 | 0.976 |
| 5.661 | 0.976 |
| 5.662 | 0.977 |
| 5.663 | 0.978 |
| 5.664 | 0.978 |
| 5.665 | 0.979 |
| 5.666 | 0.98 |
| 5.667 | 0.981 |
| 5.668 | 0.981 |
| 5.669 | 0.982 |
| 5.67 | 0.983 |
| 5.671 | 0.984 |
| 5.672 | 0.984 |
| 5.673 | 0.985 |
| 5.674 | 0.986 |
| 5.675 | 0.987 |
| 5.676 | 0.987 |
| 5.677 | 0.988 |
| 5.678 | 0.989 |
| 5.679 | 0.99 |
| 5.68 | 0.99 |
| 5.681 | 0.991 |
| 5.682 | 0.992 |
| 5.683 | 0.993 |
| 5.684 | 0.993 |
| 5.685 | 0.994 |
| 5.686 | 0.995 |
| 5.687 | 0.996 |
| 5.688 | 0.996 |
| 5.689 | 0.997 |
| 5.69 | 0.998 |
| 5.691 | 0.999 |
| 5.692 | 0.999 |
| 5.693 | 1 |
| 5.694 | 1.001 |
| 5.695 | 1.002 |
| 5.696 | 1.002 |
| 5.697 | 1.003 |
| 5.698 | 1.004 |
| 5.699 | 1.005 |
| 5.7 | 1.005 |
| 5.701 | 1.006 |
| 5.702 | 1.007 |
| 5.703 | 1.008 |
| 5.704 | 1.008 |
| 5.705 | 1.009 |
| 5.706 | 1.01 |
| 5.707 | 1.011 |
| 5.708 | 1.011 |
| 5.709 | 1.012 |
| 5.71 | 1.013 |
| 5.711 | 1.014 |
| 5.712 | 1.014 |
| 5.713 | 1.015 |
| 5.714 | 1.016 |
| 5.715 | 1.017 |
| 5.716 | 1.017 |
| 5.717 | 1.018 |
| 5.718 | 1.019 |
| 5.719 | 1.02 |
| 5.72 | 1.02 |
| 5.721 | 1.021 |
| 5.722 | 1.022 |
| 5.723 | 1.023 |
| 5.724 | 1.023 |
| 5.725 | 1.024 |
| 5.726 | 1.025 |
| 5.727 | 1.026 |
| 5.728 | 1.026 |
| 5.729 | 1.027 |
| 5.73 | 1.028 |
| 5.731 | 1.029 |
| 5.732 | 1.029 |
| 5.733 | 1.03 |
| 5.734 | 1.031 |
| 5.735 | 1.032 |
| 5.736 | 1.032 |
| 5.737 | 1.033 |
| 5.738 | 1.034 |
| 5.739 | 1.035 |
| 5.74 | 1.035 |
| 5.741 | 1.036 |
| 5.742 | 1.037 |
| 5.743 | 1.038 |
| 5.744 | 1.039 |
| 5.745 | 1.039 |
| 5.746 | 1.04 |
| 5.747 | 1.041 |
| 5.748 | 1.042 |
| 5.749 | 1.042 |
| 5.75 | 1.043 |
| 5.751 | 1.044 |
| 5.752 | 1.045 |
| 5.753 | 1.045 |
| 5.754 | 1.046 |
| 5.755 | 1.047 |
| 5.756 | 1.048 |
| 5.757 | 1.048 |
| 5.758 | 1.049 |
| 5.759 | 1.05 |
| 5.76 | 1.051 |
| 5.761 | 1.051 |
| 5.762 | 1.052 |
| 5.763 | 1.053 |
| 5.764 | 1.054 |
| 5.765 | 1.054 |
| 5.766 | 1.055 |
| 5.767 | 1.056 |
| 5.768 | 1.057 |
| 5.769 | 1.058 |
| 5.77 | 1.058 |
| 5.771 | 1.059 |
| 5.772 | 1.06 |
| 5.773 | 1.061 |
| 5.774 | 1.061 |
| 5.775 | 1.062 |
| 5.776 | 1.063 |
| 5.777 | 1.064 |
| 5.778 | 1.064 |
| 5.779 | 1.065 |
| 5.78 | 1.066 |
| 5.781 | 1.067 |
| 5.782 | 1.067 |
| 5.783 | 1.068 |
| 5.784 | 1.069 |
| 5.785 | 1.07 |
| 5.786 | 1.071 |
| 5.787 | 1.071 |
| 5.788 | 1.072 |
| 5.789 | 1.073 |
| 5.79 | 1.074 |
| 5.791 | 1.074 |
| 5.792 | 1.075 |
| 5.793 | 1.076 |
| 5.794 | 1.077 |
| 5.795 | 1.077 |
| 5.796 | 1.078 |
| 5.797 | 1.079 |
| 5.798 | 1.08 |
| 5.799 | 1.081 |
| 5.8 | 1.081 |
| 5.801 | 1.082 |
| 5.802 | 1.083 |
| 5.803 | 1.084 |
| 5.804 | 1.084 |
| 5.805 | 1.085 |
| 5.806 | 1.086 |
| 5.807 | 1.087 |
| 5.808 | 1.087 |
| 5.809 | 1.088 |
| 5.81 | 1.089 |
| 5.811 | 1.09 |
| 5.812 | 1.091 |
| 5.813 | 1.091 |
| 5.814 | 1.092 |
| 5.815 | 1.093 |
| 5.816 | 1.094 |
| 5.817 | 1.094 |
| 5.818 | 1.095 |
| 5.819 | 1.096 |
| 5.82 | 1.097 |
| 5.821 | 1.098 |
| 5.822 | 1.098 |
| 5.823 | 1.099 |
| 5.824 | 1.1 |
| 5.825 | 1.101 |
| 5.826 | 1.101 |
| 5.827 | 1.102 |
| 5.828 | 1.103 |
| 5.829 | 1.104 |
| 5.83 | 1.105 |
| 5.831 | 1.105 |
| 5.832 | 1.106 |
| 5.833 | 1.107 |
| 5.834 | 1.108 |
| 5.835 | 1.108 |
| 5.836 | 1.109 |
| 5.837 | 1.11 |
| 5.838 | 1.111 |
| 5.839 | 1.112 |
| 5.84 | 1.112 |
| 5.841 | 1.113 |
| 5.842 | 1.114 |
| 5.843 | 1.115 |
| 5.844 | 1.115 |
| 5.845 | 1.116 |
| 5.846 | 1.117 |
| 5.847 | 1.118 |
| 5.848 | 1.119 |
| 5.849 | 1.119 |
| 5.85 | 1.12 |
| 5.851 | 1.121 |
| 5.852 | 1.122 |
| 5.853 | 1.122 |
| 5.854 | 1.123 |
| 5.855 | 1.124 |
| 5.856 | 1.125 |
| 5.857 | 1.126 |
| 5.858 | 1.126 |
| 5.859 | 1.127 |
| 5.86 | 1.128 |
| 5.861 | 1.129 |
| 5.862 | 1.129 |
| 5.863 | 1.13 |
| 5.864 | 1.131 |
| 5.865 | 1.132 |
| 5.866 | 1.133 |
| 5.867 | 1.133 |
| 5.868 | 1.134 |
| 5.869 | 1.135 |
| 5.87 | 1.136 |
| 5.871 | 1.137 |
| 5.872 | 1.137 |
| 5.873 | 1.138 |
| 5.874 | 1.139 |
| 5.875 | 1.14 |
| 5.876 | 1.14 |
| 5.877 | 1.141 |
| 5.878 | 1.142 |
| 5.879 | 1.143 |
| 5.88 | 1.144 |
| 5.881 | 1.144 |
| 5.882 | 1.145 |
| 5.883 | 1.146 |
| 5.884 | 1.147 |
| 5.885 | 1.148 |
| 5.886 | 1.148 |
| 5.887 | 1.149 |
| 5.888 | 1.15 |
| 5.889 | 1.151 |
| 5.89 | 1.152 |
| 5.891 | 1.152 |
| 5.892 | 1.153 |
| 5.893 | 1.154 |
| 5.894 | 1.155 |
| 5.895 | 1.155 |
| 5.896 | 1.156 |
| 5.897 | 1.157 |
| 5.898 | 1.158 |
| 5.899 | 1.159 |
| 5.9 | 1.159 |
| 5.901 | 1.16 |
| 5.902 | 1.161 |
| 5.903 | 1.162 |
| 5.904 | 1.163 |
| 5.905 | 1.163 |
| 5.906 | 1.164 |
| 5.907 | 1.165 |
| 5.908 | 1.166 |
| 5.909 | 1.167 |
| 5.91 | 1.167 |
| 5.911 | 1.168 |
| 5.912 | 1.169 |
| 5.913 | 1.17 |
| 5.914 | 1.171 |
| 5.915 | 1.171 |
| 5.916 | 1.172 |
| 5.917 | 1.173 |
| 5.918 | 1.174 |
| 5.919 | 1.175 |
| 5.92 | 1.175 |
| 5.921 | 1.176 |
| 5.922 | 1.177 |
| 5.923 | 1.178 |
| 5.924 | 1.178 |
| 5.925 | 1.179 |
| 5.926 | 1.18 |
| 5.927 | 1.181 |
| 5.928 | 1.182 |
| 5.929 | 1.182 |
| 5.93 | 1.183 |
| 5.931 | 1.184 |
| 5.932 | 1.185 |
| 5.933 | 1.186 |
| 5.934 | 1.186 |
| 5.935 | 1.187 |
| 5.936 | 1.188 |
| 5.937 | 1.189 |
| 5.938 | 1.19 |
| 5.939 | 1.19 |
| 5.94 | 1.191 |
| 5.941 | 1.192 |
| 5.942 | 1.193 |
| 5.943 | 1.194 |
| 5.944 | 1.194 |
| 5.945 | 1.195 |
| 5.946 | 1.196 |
| 5.947 | 1.197 |
| 5.948 | 1.198 |
| 5.949 | 1.198 |
| 5.95 | 1.199 |
| 5.951 | 1.2 |
| 5.952 | 1.201 |
| 5.953 | 1.202 |
| 5.954 | 1.202 |
| 5.955 | 1.203 |
| 5.956 | 1.204 |
| 5.957 | 1.205 |
| 5.958 | 1.206 |
| 5.959 | 1.207 |
| 5.96 | 1.207 |
| 5.961 | 1.208 |
| 5.962 | 1.209 |
| 5.963 | 1.21 |
| 5.964 | 1.211 |
| 5.965 | 1.211 |
| 5.966 | 1.212 |
| 5.967 | 1.213 |
| 5.968 | 1.214 |
| 5.969 | 1.215 |
| 5.97 | 1.215 |
| 5.971 | 1.216 |
| 5.972 | 1.217 |
| 5.973 | 1.218 |
| 5.974 | 1.219 |
| 5.975 | 1.219 |
| 5.976 | 1.22 |
| 5.977 | 1.221 |
| 5.978 | 1.222 |
| 5.979 | 1.223 |
| 5.98 | 1.223 |
| 5.981 | 1.224 |
| 5.982 | 1.225 |
| 5.983 | 1.226 |
| 5.984 | 1.227 |
| 5.985 | 1.228 |
| 5.986 | 1.228 |
| 5.987 | 1.229 |
| 5.988 | 1.23 |
| 5.989 | 1.231 |
| 5.99 | 1.232 |
| 5.991 | 1.232 |
| 5.992 | 1.233 |
| 5.993 | 1.234 |
| 5.994 | 1.235 |
| 5.995 | 1.236 |
| 5.996 | 1.236 |
| 5.997 | 1.237 |
| 5.998 | 1.238 |
| 5.999 | 1.239 |
| 6.0 | 1.24 |
| 6.001 | 1.241 |
| 6.002 | 1.241 |
| 6.003 | 1.242 |
| 6.004 | 1.243 |
| 6.005 | 1.244 |
| 6.006 | 1.245 |
| 6.007 | 1.245 |
| 6.008 | 1.246 |
| 6.009 | 1.247 |
| 6.01 | 1.248 |
| 6.011 | 1.249 |
| 6.012 | 1.249 |
| 6.013 | 1.25 |
| 6.014 | 1.251 |
| 6.015 | 1.252 |
| 6.016 | 1.253 |
| 6.017 | 1.254 |
| 6.018 | 1.254 |
| 6.019 | 1.255 |
| 6.02 | 1.256 |
| 6.021 | 1.257 |
| 6.022 | 1.258 |
| 6.023 | 1.258 |
| 6.024 | 1.259 |
| 6.025 | 1.26 |
| 6.026 | 1.261 |
| 6.027 | 1.262 |
| 6.028 | 1.263 |
| 6.029 | 1.263 |
| 6.03 | 1.264 |
| 6.031 | 1.265 |
| 6.032 | 1.266 |
| 6.033 | 1.267 |
| 6.034 | 1.267 |
| 6.035 | 1.268 |
| 6.036 | 1.269 |
| 6.037 | 1.27 |
| 6.038 | 1.271 |
| 6.039 | 1.272 |
| 6.04 | 1.272 |
| 6.041 | 1.273 |
| 6.042 | 1.274 |
| 6.043 | 1.275 |
| 6.044 | 1.276 |
| 6.045 | 1.277 |
| 6.046 | 1.277 |
| 6.047 | 1.278 |
| 6.048 | 1.279 |
| 6.049 | 1.28 |
| 6.05 | 1.281 |
| 6.051 | 1.281 |
| 6.052 | 1.282 |
| 6.053 | 1.283 |
| 6.054 | 1.284 |
| 6.055 | 1.285 |
| 6.056 | 1.286 |
| 6.057 | 1.286 |
| 6.058 | 1.287 |
| 6.059 | 1.288 |
| 6.06 | 1.289 |
| 6.061 | 1.29 |
| 6.062 | 1.291 |
| 6.063 | 1.291 |
| 6.064 | 1.292 |
| 6.065 | 1.293 |
| 6.066 | 1.294 |
| 6.067 | 1.295 |
| 6.068 | 1.296 |
| 6.069 | 1.296 |
| 6.07 | 1.297 |
| 6.071 | 1.298 |
| 6.072 | 1.299 |
| 6.073 | 1.3 |
| 6.074 | 1.301 |
| 6.075 | 1.301 |
| 6.076 | 1.302 |
| 6.077 | 1.303 |
| 6.078 | 1.304 |
| 6.079 | 1.305 |
| 6.08 | 1.306 |
| 6.081 | 1.306 |
| 6.082 | 1.307 |
| 6.083 | 1.308 |
| 6.084 | 1.309 |
| 6.085 | 1.31 |
| 6.086 | 1.311 |
| 6.087 | 1.311 |
| 6.088 | 1.312 |
| 6.089 | 1.313 |
| 6.09 | 1.314 |
| 6.091 | 1.315 |
| 6.092 | 1.316 |
| 6.093 | 1.316 |
| 6.094 | 1.317 |
| 6.095 | 1.318 |
| 6.096 | 1.319 |
| 6.097 | 1.32 |
| 6.098 | 1.321 |
| 6.099 | 1.321 |
| 6.1 | 1.322 |
| 6.101 | 1.323 |
| 6.102 | 1.324 |
| 6.103 | 1.325 |
| 6.104 | 1.326 |
| 6.105 | 1.326 |
| 6.106 | 1.327 |
| 6.107 | 1.328 |
| 6.108 | 1.329 |
| 6.109 | 1.33 |
| 6.11 | 1.331 |
| 6.111 | 1.331 |
| 6.112 | 1.332 |
| 6.113 | 1.333 |
| 6.114 | 1.334 |
| 6.115 | 1.335 |
| 6.116 | 1.336 |
| 6.117 | 1.336 |
| 6.118 | 1.337 |
| 6.119 | 1.338 |
| 6.12 | 1.339 |
| 6.121 | 1.34 |
| 6.122 | 1.341 |
| 6.123 | 1.341 |
| 6.124 | 1.342 |
| 6.125 | 1.343 |
| 6.126 | 1.344 |
| 6.127 | 1.345 |
| 6.128 | 1.346 |
| 6.129 | 1.347 |
| 6.13 | 1.347 |
| 6.131 | 1.348 |
| 6.132 | 1.349 |
| 6.133 | 1.35 |
| 6.134 | 1.351 |
| 6.135 | 1.352 |
| 6.136 | 1.352 |
| 6.137 | 1.353 |
| 6.138 | 1.354 |
| 6.139 | 1.355 |
| 6.14 | 1.356 |
| 6.141 | 1.357 |
| 6.142 | 1.358 |
| 6.143 | 1.358 |
| 6.144 | 1.359 |
| 6.145 | 1.36 |
| 6.146 | 1.361 |
| 6.147 | 1.362 |
| 6.148 | 1.363 |
| 6.149 | 1.363 |
| 6.15 | 1.364 |
| 6.151 | 1.365 |
| 6.152 | 1.366 |
| 6.153 | 1.367 |
| 6.154 | 1.368 |
| 6.155 | 1.369 |
| 6.156 | 1.369 |
| 6.157 | 1.37 |
| 6.158 | 1.371 |
| 6.159 | 1.372 |
| 6.16 | 1.373 |
| 6.161 | 1.374 |
| 6.162 | 1.374 |
| 6.163 | 1.375 |
| 6.164 | 1.376 |
| 6.165 | 1.377 |
| 6.166 | 1.378 |
| 6.167 | 1.379 |
| 6.168 | 1.38 |
| 6.169 | 1.38 |
| 6.17 | 1.381 |
| 6.171 | 1.382 |
| 6.172 | 1.383 |
| 6.173 | 1.384 |
| 6.174 | 1.385 |
| 6.175 | 1.386 |
| 6.176 | 1.386 |
| 6.177 | 1.387 |
| 6.178 | 1.388 |
| 6.179 | 1.389 |
| 6.18 | 1.39 |
| 6.181 | 1.391 |
| 6.182 | 1.392 |
| 6.183 | 1.392 |
| 6.184 | 1.393 |
| 6.185 | 1.394 |
| 6.186 | 1.395 |
| 6.187 | 1.396 |
| 6.188 | 1.397 |
| 6.189 | 1.398 |
| 6.19 | 1.398 |
| 6.191 | 1.399 |
| 6.192 | 1.4 |
| 6.193 | 1.401 |
| 6.194 | 1.402 |
| 6.195 | 1.403 |
| 6.196 | 1.404 |
| 6.197 | 1.404 |
| 6.198 | 1.405 |
| 6.199 | 1.406 |
| 6.2 | 1.407 |
| 6.201 | 1.408 |
| 6.202 | 1.409 |
| 6.203 | 1.41 |
| 6.204 | 1.41 |
| 6.205 | 1.411 |
| 6.206 | 1.412 |
| 6.207 | 1.413 |
| 6.208 | 1.414 |
| 6.209 | 1.415 |
| 6.21 | 1.416 |
| 6.211 | 1.416 |
| 6.212 | 1.417 |
| 6.213 | 1.418 |
| 6.214 | 1.419 |
| 6.215 | 1.42 |
| 6.216 | 1.421 |
| 6.217 | 1.422 |
| 6.218 | 1.422 |
| 6.219 | 1.423 |
| 6.22 | 1.424 |
| 6.221 | 1.425 |
| 6.222 | 1.426 |
| 6.223 | 1.427 |
| 6.224 | 1.428 |
| 6.225 | 1.429 |
| 6.226 | 1.429 |
| 6.227 | 1.43 |
| 6.228 | 1.431 |
| 6.229 | 1.432 |
| 6.23 | 1.433 |
| 6.231 | 1.434 |
| 6.232 | 1.435 |
| 6.233 | 1.435 |
| 6.234 | 1.436 |
| 6.235 | 1.437 |
| 6.236 | 1.438 |
| 6.237 | 1.439 |
| 6.238 | 1.44 |
| 6.239 | 1.441 |
| 6.24 | 1.442 |
| 6.241 | 1.442 |
| 6.242 | 1.443 |
| 6.243 | 1.444 |
| 6.244 | 1.445 |
| 6.245 | 1.446 |
| 6.246 | 1.447 |
| 6.247 | 1.448 |
| 6.248 | 1.448 |
| 6.249 | 1.449 |
| 6.25 | 1.45 |
| 6.251 | 1.451 |
| 6.252 | 1.452 |
| 6.253 | 1.453 |
| 6.254 | 1.454 |
| 6.255 | 1.455 |
| 6.256 | 1.455 |
| 6.257 | 1.456 |
| 6.258 | 1.457 |
| 6.259 | 1.458 |
| 6.26 | 1.459 |
| 6.261 | 1.46 |
| 6.262 | 1.461 |
| 6.263 | 1.462 |
| 6.264 | 1.462 |
| 6.265 | 1.463 |
| 6.266 | 1.464 |
| 6.267 | 1.465 |
| 6.268 | 1.466 |
| 6.269 | 1.467 |
| 6.27 | 1.468 |
| 6.271 | 1.469 |
| 6.272 | 1.469 |
| 6.273 | 1.47 |
| 6.274 | 1.471 |
| 6.275 | 1.472 |
| 6.276 | 1.473 |
| 6.277 | 1.474 |
| 6.278 | 1.475 |
| 6.279 | 1.476 |
| 6.28 | 1.476 |
| 6.281 | 1.477 |
| 6.282 | 1.478 |
| 6.283 | 1.479 |
| 6.284 | 1.48 |
| 6.285 | 1.481 |
| 6.286 | 1.482 |
| 6.287 | 1.483 |
| 6.288 | 1.484 |
| 6.289 | 1.484 |
| 6.29 | 1.485 |
| 6.291 | 1.486 |
| 6.292 | 1.487 |
| 6.293 | 1.488 |
| 6.294 | 1.489 |
| 6.295 | 1.49 |
| 6.296 | 1.491 |
| 6.297 | 1.491 |
| 6.298 | 1.492 |
| 6.299 | 1.493 |
| 6.3 | 1.494 |
| 6.301 | 1.495 |
| 6.302 | 1.496 |
| 6.303 | 1.497 |
| 6.304 | 1.498 |
| 6.305 | 1.499 |
| 6.306 | 1.499 |
| 6.307 | 1.5 |
| 6.308 | 1.501 |
| 6.309 | 1.502 |
| 6.31 | 1.503 |
| 6.311 | 1.504 |
| 6.312 | 1.505 |
| 6.313 | 1.506 |
| 6.314 | 1.506 |
| 6.315 | 1.507 |
| 6.316 | 1.508 |
| 6.317 | 1.509 |
| 6.318 | 1.51 |
| 6.319 | 1.511 |
| 6.32 | 1.512 |
| 6.321 | 1.513 |
| 6.322 | 1.514 |
| 6.323 | 1.514 |
| 6.324 | 1.515 |
| 6.325 | 1.516 |
| 6.326 | 1.517 |
| 6.327 | 1.518 |
| 6.328 | 1.519 |
| 6.329 | 1.52 |
| 6.33 | 1.521 |
| 6.331 | 1.522 |
| 6.332 | 1.522 |
| 6.333 | 1.523 |
| 6.334 | 1.524 |
| 6.335 | 1.525 |
| 6.336 | 1.526 |
| 6.337 | 1.527 |
| 6.338 | 1.528 |
| 6.339 | 1.529 |
| 6.34 | 1.53 |
| 6.341 | 1.531 |
| 6.342 | 1.531 |
| 6.343 | 1.532 |
| 6.344 | 1.533 |
| 6.345 | 1.534 |
| 6.346 | 1.535 |
| 6.347 | 1.536 |
| 6.348 | 1.537 |
| 6.349 | 1.538 |
| 6.35 | 1.539 |
| 6.351 | 1.539 |
| 6.352 | 1.54 |
| 6.353 | 1.541 |
| 6.354 | 1.542 |
| 6.355 | 1.543 |
| 6.356 | 1.544 |
| 6.357 | 1.545 |
| 6.358 | 1.546 |
| 6.359 | 1.547 |
| 6.36 | 1.548 |
| 6.361 | 1.548 |
| 6.362 | 1.549 |
| 6.363 | 1.55 |
| 6.364 | 1.551 |
| 6.365 | 1.552 |
| 6.366 | 1.553 |
| 6.367 | 1.554 |
| 6.368 | 1.555 |
| 6.369 | 1.556 |
| 6.37 | 1.557 |
| 6.371 | 1.557 |
| 6.372 | 1.558 |
| 6.373 | 1.559 |
| 6.374 | 1.56 |
| 6.375 | 1.561 |
| 6.376 | 1.562 |
| 6.377 | 1.563 |
| 6.378 | 1.564 |
| 6.379 | 1.565 |
| 6.38 | 1.566 |
| 6.381 | 1.566 |
| 6.382 | 1.567 |
| 6.383 | 1.568 |
| 6.384 | 1.569 |
| 6.385 | 1.57 |
| 6.386 | 1.571 |
| 6.387 | 1.572 |
| 6.388 | 1.573 |
| 6.389 | 1.574 |
| 6.39 | 1.575 |
| 6.391 | 1.575 |
| 6.392 | 1.576 |
| 6.393 | 1.577 |
| 6.394 | 1.578 |
| 6.395 | 1.579 |
| 6.396 | 1.58 |
| 6.397 | 1.581 |
| 6.398 | 1.582 |
| 6.399 | 1.583 |
| 6.4 | 1.584 |
| 6.401 | 1.585 |
| 6.402 | 1.585 |
| 6.403 | 1.586 |
| 6.404 | 1.587 |
| 6.405 | 1.588 |
| 6.406 | 1.589 |
| 6.407 | 1.59 |
| 6.408 | 1.591 |
| 6.409 | 1.592 |
| 6.41 | 1.593 |
| 6.411 | 1.594 |
| 6.412 | 1.595 |
| 6.413 | 1.595 |
| 6.414 | 1.596 |
| 6.415 | 1.597 |
| 6.416 | 1.598 |
| 6.417 | 1.599 |
| 6.418 | 1.6 |
| 6.419 | 1.601 |
| 6.42 | 1.602 |
| 6.421 | 1.603 |
| 6.422 | 1.604 |
| 6.423 | 1.605 |
| 6.424 | 1.606 |
| 6.425 | 1.606 |
| 6.426 | 1.607 |
| 6.427 | 1.608 |
| 6.428 | 1.609 |
| 6.429 | 1.61 |
| 6.43 | 1.611 |
| 6.431 | 1.612 |
| 6.432 | 1.613 |
| 6.433 | 1.614 |
| 6.434 | 1.615 |
| 6.435 | 1.616 |
| 6.436 | 1.616 |
| 6.437 | 1.617 |
| 6.438 | 1.618 |
| 6.439 | 1.619 |
| 6.44 | 1.62 |
| 6.441 | 1.621 |
| 6.442 | 1.622 |
| 6.443 | 1.623 |
| 6.444 | 1.624 |
| 6.445 | 1.625 |
| 6.446 | 1.626 |
| 6.447 | 1.627 |
| 6.448 | 1.628 |
| 6.449 | 1.628 |
| 6.45 | 1.629 |
| 6.451 | 1.63 |
| 6.452 | 1.631 |
| 6.453 | 1.632 |
| 6.454 | 1.633 |
| 6.455 | 1.634 |
| 6.456 | 1.635 |
| 6.457 | 1.636 |
| 6.458 | 1.637 |
| 6.459 | 1.638 |
| 6.46 | 1.639 |
| 6.461 | 1.639 |
| 6.462 | 1.64 |
| 6.463 | 1.641 |
| 6.464 | 1.642 |
| 6.465 | 1.643 |
| 6.466 | 1.644 |
| 6.467 | 1.645 |
| 6.468 | 1.646 |
| 6.469 | 1.647 |
| 6.47 | 1.648 |
| 6.471 | 1.649 |
| 6.472 | 1.65 |
| 6.473 | 1.651 |
| 6.474 | 1.652 |
| 6.475 | 1.652 |
| 6.476 | 1.653 |
| 6.477 | 1.654 |
| 6.478 | 1.655 |
| 6.479 | 1.656 |
| 6.48 | 1.657 |
| 6.481 | 1.658 |
| 6.482 | 1.659 |
| 6.483 | 1.66 |
| 6.484 | 1.661 |
| 6.485 | 1.662 |
| 6.486 | 1.663 |
| 6.487 | 1.664 |
| 6.488 | 1.664 |
| 6.489 | 1.665 |
| 6.49 | 1.666 |
| 6.491 | 1.667 |
| 6.492 | 1.668 |
| 6.493 | 1.669 |
| 6.494 | 1.67 |
| 6.495 | 1.671 |
| 6.496 | 1.672 |
| 6.497 | 1.673 |
| 6.498 | 1.674 |
| 6.499 | 1.675 |
| 6.5 | 1.676 |
| 6.501 | 1.677 |
| 6.502 | 1.678 |
| 6.503 | 1.678 |
| 6.504 | 1.679 |
| 6.505 | 1.68 |
| 6.506 | 1.681 |
| 6.507 | 1.682 |
| 6.508 | 1.683 |
| 6.509 | 1.684 |
| 6.51 | 1.685 |
| 6.511 | 1.686 |
| 6.512 | 1.687 |
| 6.513 | 1.688 |
| 6.514 | 1.689 |
| 6.515 | 1.69 |
| 6.516 | 1.691 |
| 6.517 | 1.692 |
| 6.518 | 1.693 |
| 6.519 | 1.693 |
| 6.52 | 1.694 |
| 6.521 | 1.695 |
| 6.522 | 1.696 |
| 6.523 | 1.697 |
| 6.524 | 1.698 |
| 6.525 | 1.699 |
| 6.526 | 1.7 |
| 6.527 | 1.701 |
| 6.528 | 1.702 |
| 6.529 | 1.703 |
| 6.53 | 1.704 |
| 6.531 | 1.705 |
| 6.532 | 1.706 |
| 6.533 | 1.707 |
| 6.534 | 1.708 |
| 6.535 | 1.708 |
| 6.536 | 1.709 |
| 6.537 | 1.71 |
| 6.538 | 1.711 |
| 6.539 | 1.712 |
| 6.54 | 1.713 |
| 6.541 | 1.714 |
| 6.542 | 1.715 |
| 6.543 | 1.716 |
| 6.544 | 1.717 |
| 6.545 | 1.718 |
| 6.546 | 1.719 |
| 6.547 | 1.72 |
| 6.548 | 1.721 |
| 6.549 | 1.722 |
| 6.55 | 1.723 |
| 6.551 | 1.724 |
| 6.552 | 1.725 |
| 6.553 | 1.725 |
| 6.554 | 1.726 |
| 6.555 | 1.727 |
| 6.556 | 1.728 |
| 6.557 | 1.729 |
| 6.558 | 1.73 |
| 6.559 | 1.731 |
| 6.56 | 1.732 |
| 6.561 | 1.733 |
| 6.562 | 1.734 |
| 6.563 | 1.735 |
| 6.564 | 1.736 |
| 6.565 | 1.737 |
| 6.566 | 1.738 |
| 6.567 | 1.739 |
| 6.568 | 1.74 |
| 6.569 | 1.741 |
| 6.57 | 1.742 |
| 6.571 | 1.743 |
| 6.572 | 1.744 |
| 6.573 | 1.744 |
| 6.574 | 1.745 |
| 6.575 | 1.746 |
| 6.576 | 1.747 |
| 6.577 | 1.748 |
| 6.578 | 1.749 |
| 6.579 | 1.75 |
| 6.58 | 1.751 |
| 6.581 | 1.752 |
| 6.582 | 1.753 |
| 6.583 | 1.754 |
| 6.584 | 1.755 |
| 6.585 | 1.756 |
| 6.586 | 1.757 |
| 6.587 | 1.758 |
| 6.588 | 1.759 |
| 6.589 | 1.76 |
| 6.59 | 1.761 |
| 6.591 | 1.762 |
| 6.592 | 1.763 |
| 6.593 | 1.764 |
| 6.594 | 1.765 |
| 6.595 | 1.765 |
| 6.596 | 1.766 |
| 6.597 | 1.767 |
| 6.598 | 1.768 |
| 6.599 | 1.769 |
| 6.6 | 1.77 |
| 6.601 | 1.771 |
| 6.602 | 1.772 |
| 6.603 | 1.773 |
| 6.604 | 1.774 |
| 6.605 | 1.775 |
| 6.606 | 1.776 |
| 6.607 | 1.777 |
| 6.608 | 1.778 |
| 6.609 | 1.779 |
| 6.61 | 1.78 |
| 6.611 | 1.781 |
| 6.612 | 1.782 |
| 6.613 | 1.783 |
| 6.614 | 1.784 |
| 6.615 | 1.785 |
| 6.616 | 1.786 |
| 6.617 | 1.787 |
| 6.618 | 1.788 |
| 6.619 | 1.789 |
| 6.62 | 1.789 |
| 6.621 | 1.79 |
| 6.622 | 1.791 |
| 6.623 | 1.792 |
| 6.624 | 1.793 |
| 6.625 | 1.794 |
| 6.626 | 1.795 |
| 6.627 | 1.796 |
| 6.628 | 1.797 |
| 6.629 | 1.798 |
| 6.63 | 1.799 |
| 6.631 | 1.8 |
| 6.632 | 1.801 |
| 6.633 | 1.802 |
| 6.634 | 1.803 |
| 6.635 | 1.804 |
| 6.636 | 1.805 |
| 6.637 | 1.806 |
| 6.638 | 1.807 |
| 6.639 | 1.808 |
| 6.64 | 1.809 |
| 6.641 | 1.81 |
| 6.642 | 1.811 |
| 6.643 | 1.812 |
| 6.644 | 1.813 |
| 6.645 | 1.814 |
| 6.646 | 1.815 |
| 6.647 | 1.816 |
| 6.648 | 1.817 |
| 6.649 | 1.818 |
| 6.65 | 1.819 |
| 6.651 | 1.82 |
| 6.652 | 1.82 |
| 6.653 | 1.821 |
| 6.654 | 1.822 |
| 6.655 | 1.823 |
| 6.656 | 1.824 |
| 6.657 | 1.825 |
| 6.658 | 1.826 |
| 6.659 | 1.827 |
| 6.66 | 1.828 |
| 6.661 | 1.829 |
| 6.662 | 1.83 |
| 6.663 | 1.831 |
| 6.664 | 1.832 |
| 6.665 | 1.833 |
| 6.666 | 1.834 |
| 6.667 | 1.835 |
| 6.668 | 1.836 |
| 6.669 | 1.837 |
| 6.67 | 1.838 |
| 6.671 | 1.839 |
| 6.672 | 1.84 |
| 6.673 | 1.841 |
| 6.674 | 1.842 |
| 6.675 | 1.843 |
| 6.676 | 1.844 |
| 6.677 | 1.845 |
| 6.678 | 1.846 |
| 6.679 | 1.847 |
| 6.68 | 1.848 |
| 6.681 | 1.849 |
| 6.682 | 1.85 |
| 6.683 | 1.851 |
| 6.684 | 1.852 |
| 6.685 | 1.853 |
| 6.686 | 1.854 |
| 6.687 | 1.855 |
| 6.688 | 1.856 |
| 6.689 | 1.857 |
| 6.69 | 1.858 |
| 6.691 | 1.859 |
| 6.692 | 1.86 |
| 6.693 | 1.861 |
| 6.694 | 1.862 |
| 6.695 | 1.863 |
| 6.696 | 1.864 |
| 6.697 | 1.865 |
| 6.698 | 1.865 |
| 6.699 | 1.866 |
| 6.7 | 1.867 |
| 6.701 | 1.868 |
| 6.702 | 1.869 |
| 6.703 | 1.87 |
| 6.704 | 1.871 |
| 6.705 | 1.872 |
| 6.706 | 1.873 |
| 6.707 | 1.874 |
| 6.708 | 1.875 |
| 6.709 | 1.876 |
| 6.71 | 1.877 |
| 6.711 | 1.878 |
| 6.712 | 1.879 |
| 6.713 | 1.88 |
| 6.714 | 1.881 |
| 6.715 | 1.882 |
| 6.716 | 1.883 |
| 6.717 | 1.884 |
| 6.718 | 1.885 |
| 6.719 | 1.886 |
| 6.72 | 1.887 |
| 6.721 | 1.888 |
| 6.722 | 1.889 |
| 6.723 | 1.89 |
| 6.724 | 1.891 |
| 6.725 | 1.892 |
| 6.726 | 1.893 |
| 6.727 | 1.894 |
| 6.728 | 1.895 |
| 6.729 | 1.896 |
| 6.73 | 1.897 |
| 6.731 | 1.898 |
| 6.732 | 1.899 |
| 6.733 | 1.9 |
| 6.734 | 1.901 |
| 6.735 | 1.902 |
| 6.736 | 1.903 |
| 6.737 | 1.904 |
| 6.738 | 1.905 |
| 6.739 | 1.906 |
| 6.74 | 1.907 |
| 6.741 | 1.908 |
| 6.742 | 1.909 |
| 6.743 | 1.91 |
| 6.744 | 1.911 |
| 6.745 | 1.912 |
| 6.746 | 1.913 |
| 6.747 | 1.914 |
| 6.748 | 1.915 |
| 6.749 | 1.916 |
| 6.75 | 1.917 |
| 6.751 | 1.918 |
| 6.752 | 1.919 |
| 6.753 | 1.92 |
| 6.754 | 1.921 |
| 6.755 | 1.922 |
| 6.756 | 1.923 |
| 6.757 | 1.924 |
| 6.758 | 1.925 |
| 6.759 | 1.926 |
| 6.76 | 1.927 |
| 6.761 | 1.928 |
| 6.762 | 1.929 |
| 6.763 | 1.93 |
| 6.764 | 1.931 |
| 6.765 | 1.932 |
| 6.766 | 1.933 |
| 6.767 | 1.934 |
| 6.768 | 1.935 |
| 6.769 | 1.936 |
| 6.77 | 1.937 |
| 6.771 | 1.938 |
| 6.772 | 1.939 |
| 6.773 | 1.94 |
| 6.774 | 1.941 |
| 6.775 | 1.942 |
| 6.776 | 1.943 |
| 6.777 | 1.944 |
| 6.778 | 1.945 |
| 6.779 | 1.946 |
| 6.78 | 1.947 |
| 6.781 | 1.948 |
| 6.782 | 1.949 |
| 6.783 | 1.95 |
| 6.784 | 1.951 |
| 6.785 | 1.952 |
| 6.786 | 1.953 |
| 6.787 | 1.954 |
| 6.788 | 1.955 |
| 6.789 | 1.956 |
| 6.79 | 1.957 |
| 6.791 | 1.958 |
| 6.792 | 1.959 |
| 6.793 | 1.96 |
| 6.794 | 1.961 |
| 6.795 | 1.962 |
| 6.796 | 1.963 |
| 6.797 | 1.964 |
| 6.798 | 1.965 |
| 6.799 | 1.966 |
| 6.8 | 1.967 |
| 6.801 | 1.968 |
| 6.802 | 1.969 |
| 6.803 | 1.97 |
| 6.804 | 1.971 |
| 6.805 | 1.972 |
| 6.806 | 1.973 |
| 6.807 | 1.974 |
| 6.808 | 1.975 |
| 6.809 | 1.976 |
| 6.81 | 1.978 |
| 6.811 | 1.979 |
| 6.812 | 1.98 |
| 6.813 | 1.981 |
| 6.814 | 1.982 |
| 6.815 | 1.983 |
| 6.816 | 1.984 |
| 6.817 | 1.985 |
| 6.818 | 1.986 |
| 6.819 | 1.987 |
| 6.82 | 1.988 |
| 6.821 | 1.989 |
| 6.822 | 1.99 |
| 6.823 | 1.991 |
| 6.824 | 1.992 |
| 6.825 | 1.993 |
| 6.826 | 1.994 |
| 6.827 | 1.995 |
| 6.828 | 1.996 |
| 6.829 | 1.997 |
| 6.83 | 1.998 |
| 6.831 | 1.999 |
| 6.832 | 2 |
| 6.833 | 2.001 |
| 6.834 | 2.002 |
| 6.835 | 2.003 |
| 6.836 | 2.004 |
| 6.837 | 2.005 |
| 6.838 | 2.006 |
| 6.839 | 2.007 |
| 6.84 | 2.008 |
| 6.841 | 2.009 |
| 6.842 | 2.01 |
| 6.843 | 2.011 |
| 6.844 | 2.012 |
| 6.845 | 2.013 |
| 6.846 | 2.014 |
| 6.847 | 2.015 |
| 6.848 | 2.016 |
| 6.849 | 2.017 |
| 6.85 | 2.018 |
| 6.851 | 2.019 |
| 6.852 | 2.02 |
| 6.853 | 2.021 |
| 6.854 | 2.022 |
| 6.855 | 2.023 |
| 6.856 | 2.025 |
| 6.857 | 2.026 |
| 6.858 | 2.027 |
| 6.859 | 2.028 |
| 6.86 | 2.029 |
| 6.861 | 2.03 |
| 6.862 | 2.031 |
| 6.863 | 2.032 |
| 6.864 | 2.033 |
| 6.865 | 2.034 |
| 6.866 | 2.035 |
| 6.867 | 2.036 |
| 6.868 | 2.037 |
| 6.869 | 2.038 |
| 6.87 | 2.039 |
| 6.871 | 2.04 |
| 6.872 | 2.041 |
| 6.873 | 2.042 |
| 6.874 | 2.043 |
| 6.875 | 2.044 |
| 6.876 | 2.045 |
| 6.877 | 2.046 |
| 6.878 | 2.047 |
| 6.879 | 2.048 |
| 6.88 | 2.049 |
| 6.881 | 2.05 |
| 6.882 | 2.051 |
| 6.883 | 2.052 |
| 6.884 | 2.053 |
| 6.885 | 2.054 |
| 6.886 | 2.056 |
| 6.887 | 2.057 |
| 6.888 | 2.058 |
| 6.889 | 2.059 |
| 6.89 | 2.06 |
| 6.891 | 2.061 |
| 6.892 | 2.062 |
| 6.893 | 2.063 |
| 6.894 | 2.064 |
| 6.895 | 2.065 |
| 6.896 | 2.066 |
| 6.897 | 2.067 |
| 6.898 | 2.068 |
| 6.899 | 2.069 |
| 6.9 | 2.07 |
| 6.901 | 2.071 |
| 6.902 | 2.072 |
| 6.903 | 2.073 |
| 6.904 | 2.074 |
| 6.905 | 2.075 |
| 6.906 | 2.076 |
| 6.907 | 2.077 |
| 6.908 | 2.078 |
| 6.909 | 2.079 |
| 6.91 | 2.08 |
| 6.911 | 2.082 |
| 6.912 | 2.083 |
| 6.913 | 2.084 |
| 6.914 | 2.085 |
| 6.915 | 2.086 |
| 6.916 | 2.087 |
| 6.917 | 2.088 |
| 6.918 | 2.089 |
| 6.919 | 2.09 |
| 6.92 | 2.091 |
| 6.921 | 2.092 |
| 6.922 | 2.093 |
| 6.923 | 2.094 |
| 6.924 | 2.095 |
| 6.925 | 2.096 |
| 6.926 | 2.097 |
| 6.927 | 2.098 |
| 6.928 | 2.099 |
| 6.929 | 2.1 |
| 6.93 | 2.101 |
| 6.931 | 2.102 |
| 6.932 | 2.104 |
| 6.933 | 2.105 |
| 6.934 | 2.106 |
| 6.935 | 2.107 |
| 6.936 | 2.108 |
| 6.937 | 2.109 |
| 6.938 | 2.11 |
| 6.939 | 2.111 |
| 6.94 | 2.112 |
| 6.941 | 2.113 |
| 6.942 | 2.114 |
| 6.943 | 2.115 |
| 6.944 | 2.116 |
| 6.945 | 2.117 |
| 6.946 | 2.118 |
| 6.947 | 2.119 |
| 6.948 | 2.12 |
| 6.949 | 2.121 |
| 6.95 | 2.122 |
| 6.951 | 2.124 |
| 6.952 | 2.125 |
| 6.953 | 2.126 |
| 6.954 | 2.127 |
| 6.955 | 2.128 |
| 6.956 | 2.129 |
| 6.957 | 2.13 |
| 6.958 | 2.131 |
| 6.959 | 2.132 |
| 6.96 | 2.133 |
| 6.961 | 2.134 |
| 6.962 | 2.135 |
| 6.963 | 2.136 |
| 6.964 | 2.137 |
| 6.965 | 2.138 |
| 6.966 | 2.139 |
| 6.967 | 2.14 |
| 6.968 | 2.142 |
| 6.969 | 2.143 |
| 6.97 | 2.144 |
| 6.971 | 2.145 |
| 6.972 | 2.146 |
| 6.973 | 2.147 |
| 6.974 | 2.148 |
| 6.975 | 2.149 |
| 6.976 | 2.15 |
| 6.977 | 2.151 |
| 6.978 | 2.152 |
| 6.979 | 2.153 |
| 6.98 | 2.154 |
| 6.981 | 2.155 |
| 6.982 | 2.156 |
| 6.983 | 2.157 |
| 6.984 | 2.159 |
| 6.985 | 2.16 |
| 6.986 | 2.161 |
| 6.987 | 2.162 |
| 6.988 | 2.163 |
| 6.989 | 2.164 |
| 6.99 | 2.165 |
| 6.991 | 2.166 |
| 6.992 | 2.167 |
| 6.993 | 2.168 |
| 6.994 | 2.169 |
| 6.995 | 2.17 |
| 6.996 | 2.171 |
| 6.997 | 2.172 |
| 6.998 | 2.173 |
| 6.999 | 2.175 |
| 7.0 | 2.176 |
| 7.001 | 2.177 |
| 7.002 | 2.178 |
| 7.003 | 2.179 |
| 7.004 | 2.18 |
| 7.005 | 2.181 |
| 7.006 | 2.182 |
| 7.007 | 2.183 |
| 7.008 | 2.184 |
| 7.009 | 2.185 |
| 7.01 | 2.186 |
| 7.011 | 2.187 |
| 7.012 | 2.188 |
| 7.013 | 2.19 |
| 7.014 | 2.191 |
| 7.015 | 2.192 |
| 7.016 | 2.193 |
| 7.017 | 2.194 |
| 7.018 | 2.195 |
| 7.019 | 2.196 |
| 7.02 | 2.197 |
| 7.021 | 2.198 |
| 7.022 | 2.199 |
| 7.023 | 2.2 |
| 7.024 | 2.201 |
| 7.025 | 2.202 |
| 7.026 | 2.204 |
| 7.027 | 2.205 |
| 7.028 | 2.206 |
| 7.029 | 2.207 |
| 7.03 | 2.208 |
| 7.031 | 2.209 |
| 7.032 | 2.21 |
| 7.033 | 2.211 |
| 7.034 | 2.212 |
| 7.035 | 2.213 |
| 7.036 | 2.214 |
| 7.037 | 2.215 |
| 7.038 | 2.216 |
| 7.039 | 2.218 |
| 7.04 | 2.219 |
| 7.041 | 2.22 |
| 7.042 | 2.221 |
| 7.043 | 2.222 |
| 7.044 | 2.223 |
| 7.045 | 2.224 |
| 7.046 | 2.225 |
| 7.047 | 2.226 |
| 7.048 | 2.227 |
| 7.049 | 2.228 |
| 7.05 | 2.23 |
| 7.051 | 2.231 |
| 7.052 | 2.232 |
| 7.053 | 2.233 |
| 7.054 | 2.234 |
| 7.055 | 2.235 |
| 7.056 | 2.236 |
| 7.057 | 2.237 |
| 7.058 | 2.238 |
| 7.059 | 2.239 |
| 7.06 | 2.24 |
| 7.061 | 2.241 |
| 7.062 | 2.243 |
| 7.063 | 2.244 |
| 7.064 | 2.245 |
| 7.065 | 2.246 |
| 7.066 | 2.247 |
| 7.067 | 2.248 |
| 7.068 | 2.249 |
| 7.069 | 2.25 |
| 7.07 | 2.251 |
| 7.071 | 2.252 |
| 7.072 | 2.253 |
| 7.073 | 2.255 |
| 7.074 | 2.256 |
| 7.075 | 2.257 |
| 7.076 | 2.258 |
| 7.077 | 2.259 |
| 7.078 | 2.26 |
| 7.079 | 2.261 |
| 7.08 | 2.262 |
| 7.081 | 2.263 |
| 7.082 | 2.264 |
| 7.083 | 2.265 |
| 7.084 | 2.267 |
| 7.085 | 2.268 |
| 7.086 | 2.269 |
| 7.087 | 2.27 |
| 7.088 | 2.271 |
| 7.089 | 2.272 |
| 7.09 | 2.273 |
| 7.091 | 2.274 |
| 7.092 | 2.275 |
| 7.093 | 2.276 |
| 7.094 | 2.278 |
| 7.095 | 2.279 |
| 7.096 | 2.28 |
| 7.097 | 2.281 |
| 7.098 | 2.282 |
| 7.099 | 2.283 |
| 7.1 | 2.284 |
| 7.101 | 2.285 |
| 7.102 | 2.286 |
| 7.103 | 2.287 |
| 7.104 | 2.289 |
| 7.105 | 2.29 |
| 7.106 | 2.291 |
| 7.107 | 2.292 |
| 7.108 | 2.293 |
| 7.109 | 2.294 |
| 7.11 | 2.295 |
| 7.111 | 2.296 |
| 7.112 | 2.297 |
| 7.113 | 2.298 |
| 7.114 | 2.3 |
| 7.115 | 2.301 |
| 7.116 | 2.302 |
| 7.117 | 2.303 |
| 7.118 | 2.304 |
| 7.119 | 2.305 |
| 7.12 | 2.306 |
| 7.121 | 2.307 |
| 7.122 | 2.308 |
| 7.123 | 2.31 |
| 7.124 | 2.311 |
| 7.125 | 2.312 |
| 7.126 | 2.313 |
| 7.127 | 2.314 |
| 7.128 | 2.315 |
| 7.129 | 2.316 |
| 7.13 | 2.317 |
| 7.131 | 2.318 |
| 7.132 | 2.32 |
| 7.133 | 2.321 |
| 7.134 | 2.322 |
| 7.135 | 2.323 |
| 7.136 | 2.324 |
| 7.137 | 2.325 |
| 7.138 | 2.326 |
| 7.139 | 2.327 |
| 7.14 | 2.328 |
| 7.141 | 2.33 |
| 7.142 | 2.331 |
| 7.143 | 2.332 |
| 7.144 | 2.333 |
| 7.145 | 2.334 |
| 7.146 | 2.335 |
| 7.147 | 2.336 |
| 7.148 | 2.337 |
| 7.149 | 2.338 |
| 7.15 | 2.34 |
| 7.151 | 2.341 |
| 7.152 | 2.342 |
| 7.153 | 2.343 |
| 7.154 | 2.344 |
| 7.155 | 2.345 |
| 7.156 | 2.346 |
| 7.157 | 2.347 |
| 7.158 | 2.348 |
| 7.159 | 2.35 |
| 7.16 | 2.351 |
| 7.161 | 2.352 |
| 7.162 | 2.353 |
| 7.163 | 2.354 |
| 7.164 | 2.355 |
| 7.165 | 2.356 |
| 7.166 | 2.357 |
| 7.167 | 2.359 |
| 7.168 | 2.36 |
| 7.169 | 2.361 |
| 7.17 | 2.362 |
| 7.171 | 2.363 |
| 7.172 | 2.364 |
| 7.173 | 2.365 |
| 7.174 | 2.366 |
| 7.175 | 2.368 |
| 7.176 | 2.369 |
| 7.177 | 2.37 |
| 7.178 | 2.371 |
| 7.179 | 2.372 |
| 7.18 | 2.373 |
| 7.181 | 2.374 |
| 7.182 | 2.375 |
| 7.183 | 2.377 |
| 7.184 | 2.378 |
| 7.185 | 2.379 |
| 7.186 | 2.38 |
| 7.187 | 2.381 |
| 7.188 | 2.382 |
| 7.189 | 2.383 |
| 7.19 | 2.384 |
| 7.191 | 2.386 |
| 7.192 | 2.387 |
| 7.193 | 2.388 |
| 7.194 | 2.389 |
| 7.195 | 2.39 |
| 7.196 | 2.391 |
| 7.197 | 2.392 |
| 7.198 | 2.393 |
| 7.199 | 2.395 |
| 7.2 | 2.396 |
| 7.201 | 2.397 |
| 7.202 | 2.398 |
| 7.203 | 2.399 |
| 7.204 | 2.4 |
| 7.205 | 2.401 |
| 7.206 | 2.402 |
| 7.207 | 2.404 |
| 7.208 | 2.405 |
| 7.209 | 2.406 |
| 7.21 | 2.407 |
| 7.211 | 2.408 |
| 7.212 | 2.409 |
| 7.213 | 2.41 |
| 7.214 | 2.412 |
| 7.215 | 2.413 |
| 7.216 | 2.414 |
| 7.217 | 2.415 |
| 7.218 | 2.416 |
| 7.219 | 2.417 |
| 7.22 | 2.418 |
| 7.221 | 2.42 |
| 7.222 | 2.421 |
| 7.223 | 2.422 |
| 7.224 | 2.423 |
| 7.225 | 2.424 |
| 7.226 | 2.425 |
| 7.227 | 2.426 |
| 7.228 | 2.428 |
| 7.229 | 2.429 |
| 7.23 | 2.43 |
| 7.231 | 2.431 |
| 7.232 | 2.432 |
| 7.233 | 2.433 |
| 7.234 | 2.434 |
| 7.235 | 2.435 |
| 7.236 | 2.437 |
| 7.237 | 2.438 |
| 7.238 | 2.439 |
| 7.239 | 2.44 |
| 7.24 | 2.441 |
| 7.241 | 2.442 |
| 7.242 | 2.444 |
| 7.243 | 2.445 |
| 7.244 | 2.446 |
| 7.245 | 2.447 |
| 7.246 | 2.448 |
| 7.247 | 2.449 |
| 7.248 | 2.45 |
| 7.249 | 2.452 |
| 7.25 | 2.453 |
| 7.251 | 2.454 |
| 7.252 | 2.455 |
| 7.253 | 2.456 |
| 7.254 | 2.457 |
| 7.255 | 2.458 |
| 7.256 | 2.46 |
| 7.257 | 2.461 |
| 7.258 | 2.462 |
| 7.259 | 2.463 |
| 7.26 | 2.464 |
| 7.261 | 2.465 |
| 7.262 | 2.466 |
| 7.263 | 2.468 |
| 7.264 | 2.469 |
| 7.265 | 2.47 |
| 7.266 | 2.471 |
| 7.267 | 2.472 |
| 7.268 | 2.473 |
| 7.269 | 2.475 |
| 7.27 | 2.476 |
| 7.271 | 2.477 |
| 7.272 | 2.478 |
| 7.273 | 2.479 |
| 7.274 | 2.48 |
| 7.275 | 2.481 |
| 7.276 | 2.483 |
| 7.277 | 2.484 |
| 7.278 | 2.485 |
| 7.279 | 2.486 |
| 7.28 | 2.487 |
| 7.281 | 2.488 |
| 7.282 | 2.49 |
| 7.283 | 2.491 |
| 7.284 | 2.492 |
| 7.285 | 2.493 |
| 7.286 | 2.494 |
| 7.287 | 2.495 |
| 7.288 | 2.496 |
| 7.289 | 2.498 |
| 7.29 | 2.499 |
| 7.291 | 2.5 |
| 7.292 | 2.501 |
| 7.293 | 2.502 |
| 7.294 | 2.503 |
| 7.295 | 2.505 |
| 7.296 | 2.506 |
| 7.297 | 2.507 |
| 7.298 | 2.508 |
| 7.299 | 2.509 |
| 7.3 | 2.51 |
| 7.301 | 2.512 |
| 7.302 | 2.513 |
| 7.303 | 2.514 |
| 7.304 | 2.515 |
| 7.305 | 2.516 |
| 7.306 | 2.517 |
| 7.307 | 2.519 |
| 7.308 | 2.52 |
| 7.309 | 2.521 |
| 7.31 | 2.522 |
| 7.311 | 2.523 |
| 7.312 | 2.524 |
| 7.313 | 2.526 |
| 7.314 | 2.527 |
| 7.315 | 2.528 |
| 7.316 | 2.529 |
| 7.317 | 2.53 |
| 7.318 | 2.531 |
| 7.319 | 2.533 |
| 7.32 | 2.534 |
| 7.321 | 2.535 |
| 7.322 | 2.536 |
| 7.323 | 2.537 |
| 7.324 | 2.538 |
| 7.325 | 2.54 |
| 7.326 | 2.541 |
| 7.327 | 2.542 |
| 7.328 | 2.543 |
| 7.329 | 2.544 |
| 7.33 | 2.545 |
| 7.331 | 2.547 |
| 7.332 | 2.548 |
| 7.333 | 2.549 |
| 7.334 | 2.55 |
| 7.335 | 2.551 |
| 7.336 | 2.553 |
| 7.337 | 2.554 |
| 7.338 | 2.555 |
| 7.339 | 2.556 |
| 7.34 | 2.557 |
| 7.341 | 2.558 |
| 7.342 | 2.56 |
| 7.343 | 2.561 |
| 7.344 | 2.562 |
| 7.345 | 2.563 |
| 7.346 | 2.564 |
| 7.347 | 2.565 |
| 7.348 | 2.567 |
| 7.349 | 2.568 |
| 7.35 | 2.569 |
| 7.351 | 2.57 |
| 7.352 | 2.571 |
| 7.353 | 2.573 |
| 7.354 | 2.574 |
| 7.355 | 2.575 |
| 7.356 | 2.576 |
| 7.357 | 2.577 |
| 7.358 | 2.578 |
| 7.359 | 2.58 |
| 7.36 | 2.581 |
| 7.361 | 2.582 |
| 7.362 | 2.583 |
| 7.363 | 2.584 |
| 7.364 | 2.586 |
| 7.365 | 2.587 |
| 7.366 | 2.588 |
| 7.367 | 2.589 |
| 7.368 | 2.59 |
| 7.369 | 2.591 |
| 7.37 | 2.593 |
| 7.371 | 2.594 |
| 7.372 | 2.595 |
| 7.373 | 2.596 |
| 7.374 | 2.597 |
| 7.375 | 2.599 |
| 7.376 | 2.6 |
| 7.377 | 2.601 |
| 7.378 | 2.602 |
| 7.379 | 2.603 |
| 7.38 | 2.605 |
| 7.381 | 2.606 |
| 7.382 | 2.607 |
| 7.383 | 2.608 |
| 7.384 | 2.609 |
| 7.385 | 2.61 |
| 7.386 | 2.612 |
| 7.387 | 2.613 |
| 7.388 | 2.614 |
| 7.389 | 2.615 |
| 7.39 | 2.616 |
| 7.391 | 2.618 |
| 7.392 | 2.619 |
| 7.393 | 2.62 |
| 7.394 | 2.621 |
| 7.395 | 2.622 |
| 7.396 | 2.624 |
| 7.397 | 2.625 |
| 7.398 | 2.626 |
| 7.399 | 2.627 |
| 7.4 | 2.628 |
| 7.401 | 2.63 |
| 7.402 | 2.631 |
| 7.403 | 2.632 |
| 7.404 | 2.633 |
| 7.405 | 2.634 |
| 7.406 | 2.636 |
| 7.407 | 2.637 |
| 7.408 | 2.638 |
| 7.409 | 2.639 |
| 7.41 | 2.64 |
| 7.411 | 2.642 |
| 7.412 | 2.643 |
| 7.413 | 2.644 |
| 7.414 | 2.645 |
| 7.415 | 2.646 |
| 7.416 | 2.648 |
| 7.417 | 2.649 |
| 7.418 | 2.65 |
| 7.419 | 2.651 |
| 7.42 | 2.652 |
| 7.421 | 2.654 |
| 7.422 | 2.655 |
| 7.423 | 2.656 |
| 7.424 | 2.657 |
| 7.425 | 2.658 |
| 7.426 | 2.66 |
| 7.427 | 2.661 |
| 7.428 | 2.662 |
| 7.429 | 2.663 |
| 7.43 | 2.664 |
| 7.431 | 2.666 |
| 7.432 | 2.667 |
| 7.433 | 2.668 |
| 7.434 | 2.669 |
| 7.435 | 2.67 |
| 7.436 | 2.672 |
| 7.437 | 2.673 |
| 7.438 | 2.674 |
| 7.439 | 2.675 |
| 7.44 | 2.676 |
| 7.441 | 2.678 |
| 7.442 | 2.679 |
| 7.443 | 2.68 |
| 7.444 | 2.681 |
| 7.445 | 2.683 |
| 7.446 | 2.684 |
| 7.447 | 2.685 |
| 7.448 | 2.686 |
| 7.449 | 2.687 |
| 7.45 | 2.689 |
| 7.451 | 2.69 |
| 7.452 | 2.691 |
| 7.453 | 2.692 |
| 7.454 | 2.693 |
| 7.455 | 2.695 |
| 7.456 | 2.696 |
| 7.457 | 2.697 |
| 7.458 | 2.698 |
| 7.459 | 2.7 |
| 7.46 | 2.701 |
| 7.461 | 2.702 |
| 7.462 | 2.703 |
| 7.463 | 2.704 |
| 7.464 | 2.706 |
| 7.465 | 2.707 |
| 7.466 | 2.708 |
| 7.467 | 2.709 |
| 7.468 | 2.711 |
| 7.469 | 2.712 |
| 7.47 | 2.713 |
| 7.471 | 2.714 |
| 7.472 | 2.715 |
| 7.473 | 2.717 |
| 7.474 | 2.718 |
| 7.475 | 2.719 |
| 7.476 | 2.72 |
| 7.477 | 2.721 |
| 7.478 | 2.723 |
| 7.479 | 2.724 |
| 7.48 | 2.725 |
| 7.481 | 2.726 |
| 7.482 | 2.728 |
| 7.483 | 2.729 |
| 7.484 | 2.73 |
| 7.485 | 2.731 |
| 7.486 | 2.733 |
| 7.487 | 2.734 |
| 7.488 | 2.735 |
| 7.489 | 2.736 |
| 7.49 | 2.737 |
| 7.491 | 2.739 |
| 7.492 | 2.74 |
| 7.493 | 2.741 |
| 7.494 | 2.742 |
| 7.495 | 2.744 |
| 7.496 | 2.745 |
| 7.497 | 2.746 |
| 7.498 | 2.747 |
| 7.499 | 2.748 |
| 7.5 | 2.75 |
| 7.501 | 2.751 |
| 7.502 | 2.752 |
| 7.503 | 2.753 |
| 7.504 | 2.755 |
| 7.505 | 2.756 |
| 7.506 | 2.757 |
| 7.507 | 2.758 |
| 7.508 | 2.76 |
| 7.509 | 2.761 |
| 7.51 | 2.762 |
| 7.511 | 2.763 |
| 7.512 | 2.764 |
| 7.513 | 2.766 |
| 7.514 | 2.767 |
| 7.515 | 2.768 |
| 7.516 | 2.769 |
| 7.517 | 2.771 |
| 7.518 | 2.772 |
| 7.519 | 2.773 |
| 7.52 | 2.774 |
| 7.521 | 2.776 |
| 7.522 | 2.777 |
| 7.523 | 2.778 |
| 7.524 | 2.779 |
| 7.525 | 2.781 |
| 7.526 | 2.782 |
| 7.527 | 2.783 |
| 7.528 | 2.784 |
| 7.529 | 2.786 |
| 7.53 | 2.787 |
| 7.531 | 2.788 |
| 7.532 | 2.789 |
| 7.533 | 2.79 |
| 7.534 | 2.792 |
| 7.535 | 2.793 |
| 7.536 | 2.794 |
| 7.537 | 2.795 |
| 7.538 | 2.797 |
| 7.539 | 2.798 |
| 7.54 | 2.799 |
| 7.541 | 2.8 |
| 7.542 | 2.802 |
| 7.543 | 2.803 |
| 7.544 | 2.804 |
| 7.545 | 2.805 |
| 7.546 | 2.807 |
| 7.547 | 2.808 |
| 7.548 | 2.809 |
| 7.549 | 2.81 |
| 7.55 | 2.812 |
| 7.551 | 2.813 |
| 7.552 | 2.814 |
| 7.553 | 2.815 |
| 7.554 | 2.817 |
| 7.555 | 2.818 |
| 7.556 | 2.819 |
| 7.557 | 2.82 |
| 7.558 | 2.822 |
| 7.559 | 2.823 |
| 7.56 | 2.824 |
| 7.561 | 2.825 |
| 7.562 | 2.827 |
| 7.563 | 2.828 |
| 7.564 | 2.829 |
| 7.565 | 2.83 |
| 7.566 | 2.832 |
| 7.567 | 2.833 |
| 7.568 | 2.834 |
| 7.569 | 2.835 |
| 7.57 | 2.837 |
| 7.571 | 2.838 |
| 7.572 | 2.839 |
| 7.573 | 2.84 |
| 7.574 | 2.842 |
| 7.575 | 2.843 |
| 7.576 | 2.844 |
| 7.577 | 2.845 |
| 7.578 | 2.847 |
| 7.579 | 2.848 |
| 7.58 | 2.849 |
| 7.581 | 2.85 |
| 7.582 | 2.852 |
| 7.583 | 2.853 |
| 7.584 | 2.854 |
| 7.585 | 2.856 |
| 7.586 | 2.857 |
| 7.587 | 2.858 |
| 7.588 | 2.859 |
| 7.589 | 2.861 |
| 7.59 | 2.862 |
| 7.591 | 2.863 |
| 7.592 | 2.864 |
| 7.593 | 2.866 |
| 7.594 | 2.867 |
| 7.595 | 2.868 |
| 7.596 | 2.869 |
| 7.597 | 2.871 |
| 7.598 | 2.872 |
| 7.599 | 2.873 |
| 7.6 | 2.874 |
| 7.601 | 2.876 |
| 7.602 | 2.877 |
| 7.603 | 2.878 |
| 7.604 | 2.88 |
| 7.605 | 2.881 |
| 7.606 | 2.882 |
| 7.607 | 2.883 |
| 7.608 | 2.885 |
| 7.609 | 2.886 |
| 7.61 | 2.887 |
| 7.611 | 2.888 |
| 7.612 | 2.89 |
| 7.613 | 2.891 |
| 7.614 | 2.892 |
| 7.615 | 2.894 |
| 7.616 | 2.895 |
| 7.617 | 2.896 |
| 7.618 | 2.897 |
| 7.619 | 2.899 |
| 7.62 | 2.9 |
| 7.621 | 2.901 |
| 7.622 | 2.902 |
| 7.623 | 2.904 |
| 7.624 | 2.905 |
| 7.625 | 2.906 |
| 7.626 | 2.908 |
| 7.627 | 2.909 |
| 7.628 | 2.91 |
| 7.629 | 2.911 |
| 7.63 | 2.913 |
| 7.631 | 2.914 |
| 7.632 | 2.915 |
| 7.633 | 2.916 |
| 7.634 | 2.918 |
| 7.635 | 2.919 |
| 7.636 | 2.92 |
| 7.637 | 2.922 |
| 7.638 | 2.923 |
| 7.639 | 2.924 |
| 7.64 | 2.925 |
| 7.641 | 2.927 |
| 7.642 | 2.928 |
| 7.643 | 2.929 |
| 7.644 | 2.931 |
| 7.645 | 2.932 |
| 7.646 | 2.933 |
| 7.647 | 2.934 |
| 7.648 | 2.936 |
| 7.649 | 2.937 |
| 7.65 | 2.938 |
| 7.651 | 2.939 |
| 7.652 | 2.941 |
| 7.653 | 2.942 |
| 7.654 | 2.943 |
| 7.655 | 2.945 |
| 7.656 | 2.946 |
| 7.657 | 2.947 |
| 7.658 | 2.948 |
| 7.659 | 2.95 |
| 7.66 | 2.951 |
| 7.661 | 2.952 |
| 7.662 | 2.954 |
| 7.663 | 2.955 |
| 7.664 | 2.956 |
| 7.665 | 2.958 |
| 7.666 | 2.959 |
| 7.667 | 2.96 |
| 7.668 | 2.961 |
| 7.669 | 2.963 |
| 7.67 | 2.964 |
| 7.671 | 2.965 |
| 7.672 | 2.967 |
| 7.673 | 2.968 |
| 7.674 | 2.969 |
| 7.675 | 2.97 |
| 7.676 | 2.972 |
| 7.677 | 2.973 |
| 7.678 | 2.974 |
| 7.679 | 2.976 |
| 7.68 | 2.977 |
| 7.681 | 2.978 |
| 7.682 | 2.979 |
| 7.683 | 2.981 |
| 7.684 | 2.982 |
| 7.685 | 2.983 |
| 7.686 | 2.985 |
| 7.687 | 2.986 |
| 7.688 | 2.987 |
| 7.689 | 2.989 |
| 7.69 | 2.99 |
| 7.691 | 2.991 |
| 7.692 | 2.992 |
| 7.693 | 2.994 |
| 7.694 | 2.995 |
| 7.695 | 2.996 |
| 7.696 | 2.998 |
| 7.697 | 2.999 |
| 7.698 | 3 |
| 7.699 | 3.002 |
| 7.7 | 3.003 |
| 7.701 | 3.004 |
| 7.702 | 3.005 |
| 7.703 | 3.007 |
| 7.704 | 3.008 |
| 7.705 | 3.009 |
| 7.706 | 3.011 |
| 7.707 | 3.012 |
| 7.708 | 3.013 |
| 7.709 | 3.015 |
| 7.71 | 3.016 |
| 7.711 | 3.017 |
| 7.712 | 3.018 |
| 7.713 | 3.02 |
| 7.714 | 3.021 |
| 7.715 | 3.022 |
| 7.716 | 3.024 |
| 7.717 | 3.025 |
| 7.718 | 3.026 |
| 7.719 | 3.028 |
| 7.72 | 3.029 |
| 7.721 | 3.03 |
| 7.722 | 3.032 |
| 7.723 | 3.033 |
| 7.724 | 3.034 |
| 7.725 | 3.036 |
| 7.726 | 3.037 |
| 7.727 | 3.038 |
| 7.728 | 3.039 |
| 7.729 | 3.041 |
| 7.73 | 3.042 |
| 7.731 | 3.043 |
| 7.732 | 3.045 |
| 7.733 | 3.046 |
| 7.734 | 3.047 |
| 7.735 | 3.049 |
| 7.736 | 3.05 |
| 7.737 | 3.051 |
| 7.738 | 3.053 |
| 7.739 | 3.054 |
| 7.74 | 3.055 |
| 7.741 | 3.057 |
| 7.742 | 3.058 |
| 7.743 | 3.059 |
| 7.744 | 3.06 |
| 7.745 | 3.062 |
| 7.746 | 3.063 |
| 7.747 | 3.064 |
| 7.748 | 3.066 |
| 7.749 | 3.067 |
| 7.75 | 3.068 |
| 7.751 | 3.07 |
| 7.752 | 3.071 |
| 7.753 | 3.072 |
| 7.754 | 3.074 |
| 7.755 | 3.075 |
| 7.756 | 3.076 |
| 7.757 | 3.078 |
| 7.758 | 3.079 |
| 7.759 | 3.08 |
| 7.76 | 3.082 |
| 7.761 | 3.083 |
| 7.762 | 3.084 |
| 7.763 | 3.086 |
| 7.764 | 3.087 |
| 7.765 | 3.088 |
| 7.766 | 3.09 |
| 7.767 | 3.091 |
| 7.768 | 3.092 |
| 7.769 | 3.094 |
| 7.77 | 3.095 |
| 7.771 | 3.096 |
| 7.772 | 3.098 |
| 7.773 | 3.099 |
| 7.774 | 3.1 |
| 7.775 | 3.102 |
| 7.776 | 3.103 |
| 7.777 | 3.104 |
| 7.778 | 3.106 |
| 7.779 | 3.107 |
| 7.78 | 3.108 |
| 7.781 | 3.11 |
| 7.782 | 3.111 |
| 7.783 | 3.112 |
| 7.784 | 3.114 |
| 7.785 | 3.115 |
| 7.786 | 3.116 |
| 7.787 | 3.118 |
| 7.788 | 3.119 |
| 7.789 | 3.12 |
| 7.79 | 3.122 |
| 7.791 | 3.123 |
| 7.792 | 3.124 |
| 7.793 | 3.126 |
| 7.794 | 3.127 |
| 7.795 | 3.128 |
| 7.796 | 3.13 |
| 7.797 | 3.131 |
| 7.798 | 3.132 |
| 7.799 | 3.134 |
| 7.8 | 3.135 |
| 7.801 | 3.136 |
| 7.802 | 3.138 |
| 7.803 | 3.139 |
| 7.804 | 3.14 |
| 7.805 | 3.142 |
| 7.806 | 3.143 |
| 7.807 | 3.144 |
| 7.808 | 3.146 |
| 7.809 | 3.147 |
| 7.81 | 3.148 |
| 7.811 | 3.15 |
| 7.812 | 3.151 |
| 7.813 | 3.152 |
| 7.814 | 3.154 |
| 7.815 | 3.155 |
| 7.816 | 3.156 |
| 7.817 | 3.158 |
| 7.818 | 3.159 |
| 7.819 | 3.16 |
| 7.82 | 3.162 |
| 7.821 | 3.163 |
| 7.822 | 3.164 |
| 7.823 | 3.166 |
| 7.824 | 3.167 |
| 7.825 | 3.169 |
| 7.826 | 3.17 |
| 7.827 | 3.171 |
| 7.828 | 3.173 |
| 7.829 | 3.174 |
| 7.83 | 3.175 |
| 7.831 | 3.177 |
| 7.832 | 3.178 |
| 7.833 | 3.179 |
| 7.834 | 3.181 |
| 7.835 | 3.182 |
| 7.836 | 3.183 |
| 7.837 | 3.185 |
| 7.838 | 3.186 |
| 7.839 | 3.187 |
| 7.84 | 3.189 |
| 7.841 | 3.19 |
| 7.842 | 3.192 |
| 7.843 | 3.193 |
| 7.844 | 3.194 |
| 7.845 | 3.196 |
| 7.846 | 3.197 |
| 7.847 | 3.198 |
| 7.848 | 3.2 |
| 7.849 | 3.201 |
| 7.85 | 3.202 |
| 7.851 | 3.204 |
| 7.852 | 3.205 |
| 7.853 | 3.206 |
| 7.854 | 3.208 |
| 7.855 | 3.209 |
| 7.856 | 3.211 |
| 7.857 | 3.212 |
| 7.858 | 3.213 |
| 7.859 | 3.215 |
| 7.86 | 3.216 |
| 7.861 | 3.217 |
| 7.862 | 3.219 |
| 7.863 | 3.22 |
| 7.864 | 3.221 |
| 7.865 | 3.223 |
| 7.866 | 3.224 |
| 7.867 | 3.226 |
| 7.868 | 3.227 |
| 7.869 | 3.228 |
| 7.87 | 3.23 |
| 7.871 | 3.231 |
| 7.872 | 3.232 |
| 7.873 | 3.234 |
| 7.874 | 3.235 |
| 7.875 | 3.236 |
| 7.876 | 3.238 |
| 7.877 | 3.239 |
| 7.878 | 3.241 |
| 7.879 | 3.242 |
| 7.88 | 3.243 |
| 7.881 | 3.245 |
| 7.882 | 3.246 |
| 7.883 | 3.247 |
| 7.884 | 3.249 |
| 7.885 | 3.25 |
| 7.886 | 3.252 |
| 7.887 | 3.253 |
| 7.888 | 3.254 |
| 7.889 | 3.256 |
| 7.89 | 3.257 |
| 7.891 | 3.258 |
| 7.892 | 3.26 |
| 7.893 | 3.261 |
| 7.894 | 3.263 |
| 7.895 | 3.264 |
| 7.896 | 3.265 |
| 7.897 | 3.267 |
| 7.898 | 3.268 |
| 7.899 | 3.269 |
| 7.9 | 3.271 |
| 7.901 | 3.272 |
| 7.902 | 3.274 |
| 7.903 | 3.275 |
| 7.904 | 3.276 |
| 7.905 | 3.278 |
| 7.906 | 3.279 |
| 7.907 | 3.28 |
| 7.908 | 3.282 |
| 7.909 | 3.283 |
| 7.91 | 3.285 |
| 7.911 | 3.286 |
| 7.912 | 3.287 |
| 7.913 | 3.289 |
| 7.914 | 3.29 |
| 7.915 | 3.292 |
| 7.916 | 3.293 |
| 7.917 | 3.294 |
| 7.918 | 3.296 |
| 7.919 | 3.297 |
| 7.92 | 3.298 |
| 7.921 | 3.3 |
| 7.922 | 3.301 |
| 7.923 | 3.303 |
| 7.924 | 3.304 |
| 7.925 | 3.305 |
| 7.926 | 3.307 |
| 7.927 | 3.308 |
| 7.928 | 3.31 |
| 7.929 | 3.311 |
| 7.93 | 3.312 |
| 7.931 | 3.314 |
| 7.932 | 3.315 |
| 7.933 | 3.317 |
| 7.934 | 3.318 |
| 7.935 | 3.319 |
| 7.936 | 3.321 |
| 7.937 | 3.322 |
| 7.938 | 3.324 |
| 7.939 | 3.325 |
| 7.94 | 3.326 |
| 7.941 | 3.328 |
| 7.942 | 3.329 |
| 7.943 | 3.33 |
| 7.944 | 3.332 |
| 7.945 | 3.333 |
| 7.946 | 3.335 |
| 7.947 | 3.336 |
| 7.948 | 3.337 |
| 7.949 | 3.339 |
| 7.95 | 3.34 |
| 7.951 | 3.342 |
| 7.952 | 3.343 |
| 7.953 | 3.344 |
| 7.954 | 3.346 |
| 7.955 | 3.347 |
| 7.956 | 3.349 |
| 7.957 | 3.35 |
| 7.958 | 3.351 |
| 7.959 | 3.353 |
| 7.96 | 3.354 |
| 7.961 | 3.356 |
| 7.962 | 3.357 |
| 7.963 | 3.358 |
| 7.964 | 3.36 |
| 7.965 | 3.361 |
| 7.966 | 3.363 |
| 7.967 | 3.364 |
| 7.968 | 3.366 |
| 7.969 | 3.367 |
| 7.97 | 3.368 |
| 7.971 | 3.37 |
| 7.972 | 3.371 |
| 7.973 | 3.373 |
| 7.974 | 3.374 |
| 7.975 | 3.375 |
| 7.976 | 3.377 |
| 7.977 | 3.378 |
| 7.978 | 3.38 |
| 7.979 | 3.381 |
| 7.98 | 3.382 |
| 7.981 | 3.384 |
| 7.982 | 3.385 |
| 7.983 | 3.387 |
| 7.984 | 3.388 |
| 7.985 | 3.389 |
| 7.986 | 3.391 |
| 7.987 | 3.392 |
| 7.988 | 3.394 |
| 7.989 | 3.395 |
| 7.99 | 3.397 |
| 7.991 | 3.398 |
| 7.992 | 3.399 |
| 7.993 | 3.401 |
| 7.994 | 3.402 |
| 7.995 | 3.404 |
| 7.996 | 3.405 |
| 7.997 | 3.406 |
| 7.998 | 3.408 |
| 7.999 | 3.409 |
| 8.0 | 3.411 |